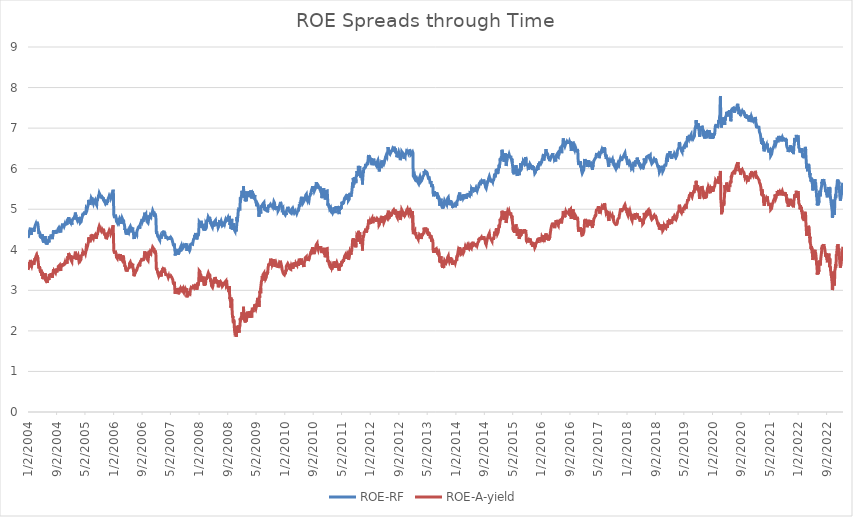
| Category | ROE-RF | ROE-A-yield |
|---|---|---|
| 1/2/04 | 4.291 | 3.504 |
| 1/5/04 | 4.27 | 3.485 |
| 1/6/04 | 4.33 | 3.547 |
| 1/7/04 | 4.342 | 3.57 |
| 1/8/04 | 4.313 | 3.534 |
| 1/9/04 | 4.4 | 3.624 |
| 1/12/04 | 4.406 | 3.625 |
| 1/13/04 | 4.434 | 3.646 |
| 1/14/04 | 4.46 | 3.697 |
| 1/15/04 | 4.479 | 3.71 |
| 1/16/04 | 4.452 | 3.661 |
| 1/19/04 | 4.447 | 3.651 |
| 1/20/04 | 4.445 | 3.657 |
| 1/21/04 | 4.483 | 3.694 |
| 1/22/04 | 4.544 | 3.751 |
| 1/23/04 | 4.451 | 3.655 |
| 1/26/04 | 4.414 | 3.614 |
| 1/27/04 | 4.44 | 3.639 |
| 1/28/04 | 4.366 | 3.569 |
| 1/29/04 | 4.371 | 3.569 |
| 1/30/04 | 4.428 | 3.629 |
| 2/2/04 | 4.411 | 3.604 |
| 2/3/04 | 4.425 | 3.612 |
| 2/4/04 | 4.427 | 3.63 |
| 2/5/04 | 4.421 | 3.623 |
| 2/6/04 | 4.495 | 3.692 |
| 2/9/04 | 4.506 | 3.703 |
| 2/10/04 | 4.475 | 3.671 |
| 2/11/04 | 4.518 | 3.717 |
| 2/12/04 | 4.497 | 3.691 |
| 2/13/04 | 4.512 | 3.704 |
| 2/16/04 | 4.512 | 3.704 |
| 2/17/04 | 4.512 | 3.704 |
| 2/18/04 | 4.49 | 3.679 |
| 2/19/04 | 4.479 | 3.659 |
| 2/20/04 | 4.444 | 3.634 |
| 2/23/04 | 4.468 | 3.662 |
| 2/24/04 | 4.494 | 3.691 |
| 2/25/04 | 4.508 | 3.707 |
| 2/26/04 | 4.498 | 3.694 |
| 2/27/04 | 4.54 | 3.738 |
| 3/1/04 | 4.577 | 3.786 |
| 3/2/04 | 4.575 | 3.754 |
| 3/3/04 | 4.553 | 3.74 |
| 3/4/04 | 4.554 | 3.744 |
| 3/5/04 | 4.616 | 3.8 |
| 3/8/04 | 4.64 | 3.821 |
| 3/9/04 | 4.644 | 3.831 |
| 3/10/04 | 4.634 | 3.815 |
| 3/11/04 | 4.623 | 3.802 |
| 3/12/04 | 4.61 | 3.783 |
| 3/15/04 | 4.634 | 3.786 |
| 3/16/04 | 4.659 | 3.811 |
| 3/17/04 | 4.688 | 3.847 |
| 3/18/04 | 4.682 | 3.829 |
| 3/19/04 | 4.674 | 3.816 |
| 3/22/04 | 4.703 | 3.854 |
| 3/23/04 | 4.702 | 3.856 |
| 3/24/04 | 4.705 | 3.86 |
| 3/25/04 | 4.702 | 3.85 |
| 3/26/04 | 4.622 | 3.77 |
| 3/29/04 | 4.565 | 3.703 |
| 3/30/04 | 4.56 | 3.704 |
| 3/31/04 | 4.565 | 3.699 |
| 4/1/04 | 4.55 | 3.691 |
| 4/2/04 | 4.426 | 3.568 |
| 4/5/04 | 4.393 | 3.542 |
| 4/6/04 | 4.402 | 3.553 |
| 4/7/04 | 4.439 | 3.59 |
| 4/8/04 | 4.437 | 3.586 |
| 4/12/04 | 4.409 | 3.552 |
| 4/13/04 | 4.345 | 3.489 |
| 4/14/04 | 4.321 | 3.472 |
| 4/15/04 | 4.324 | 3.465 |
| 4/16/04 | 4.368 | 3.51 |
| 4/19/04 | 4.336 | 3.479 |
| 4/20/04 | 4.296 | 3.435 |
| 4/21/04 | 4.324 | 3.467 |
| 4/22/04 | 4.364 | 3.51 |
| 4/23/04 | 4.326 | 3.472 |
| 4/26/04 | 4.324 | 3.467 |
| 4/27/04 | 4.336 | 3.484 |
| 4/28/04 | 4.299 | 3.393 |
| 4/29/04 | 4.271 | 3.353 |
| 4/30/04 | 4.35 | 3.432 |
| 5/3/04 | 4.38 | 3.457 |
| 5/4/04 | 4.343 | 3.415 |
| 5/5/04 | 4.327 | 3.401 |
| 5/6/04 | 4.333 | 3.406 |
| 5/7/04 | 4.233 | 3.287 |
| 5/10/04 | 4.247 | 3.341 |
| 5/11/04 | 4.258 | 3.346 |
| 5/12/04 | 4.178 | 3.276 |
| 5/13/04 | 4.154 | 3.257 |
| 5/14/04 | 4.205 | 3.304 |
| 5/17/04 | 4.275 | 3.375 |
| 5/18/04 | 4.247 | 3.35 |
| 5/19/04 | 4.208 | 3.313 |
| 5/20/04 | 4.24 | 3.333 |
| 5/21/04 | 4.22 | 3.301 |
| 5/25/04 | 4.208 | 3.286 |
| 5/26/04 | 4.277 | 3.362 |
| 5/27/04 | 4.339 | 3.418 |
| 5/28/04 | 4.3 | 3.368 |
| 5/31/04 | 4.294 | 3.36 |
| 6/1/04 | 4.27 | 3.34 |
| 6/2/04 | 4.208 | 3.278 |
| 6/3/04 | 4.212 | 3.283 |
| 6/4/04 | 4.139 | 3.219 |
| 6/7/04 | 4.14 | 3.219 |
| 6/8/04 | 4.166 | 3.248 |
| 6/9/04 | 4.159 | 3.251 |
| 6/10/04 | 4.157 | 3.237 |
| 6/11/04 | 4.127 | 3.206 |
| 6/14/04 | 4.107 | 3.181 |
| 6/15/04 | 4.2 | 3.277 |
| 6/16/04 | 4.172 | 3.267 |
| 6/17/04 | 4.181 | 3.274 |
| 6/18/04 | 4.181 | 3.246 |
| 6/21/04 | 4.176 | 3.263 |
| 6/22/04 | 4.169 | 3.263 |
| 6/23/04 | 4.219 | 3.312 |
| 6/24/04 | 4.25 | 3.334 |
| 6/25/04 | 4.239 | 3.31 |
| 6/28/04 | 4.184 | 3.257 |
| 6/29/04 | 4.203 | 3.27 |
| 6/30/04 | 4.265 | 3.336 |
| 7/2/04 | 4.339 | 3.404 |
| 7/5/04 | 4.329 | 3.396 |
| 7/6/04 | 4.306 | 3.37 |
| 7/7/04 | 4.297 | 3.351 |
| 7/8/04 | 4.31 | 3.362 |
| 7/9/04 | 4.323 | 3.374 |
| 7/12/04 | 4.327 | 3.381 |
| 7/13/04 | 4.31 | 3.364 |
| 7/14/04 | 4.308 | 3.364 |
| 7/15/04 | 4.311 | 3.36 |
| 7/16/04 | 4.377 | 3.429 |
| 7/19/04 | 4.375 | 3.434 |
| 7/20/04 | 4.333 | 3.394 |
| 7/21/04 | 4.306 | 3.358 |
| 7/22/04 | 4.324 | 3.374 |
| 7/23/04 | 4.339 | 3.388 |
| 7/26/04 | 4.338 | 3.39 |
| 7/27/04 | 4.263 | 3.312 |
| 7/28/04 | 4.27 | 3.313 |
| 7/29/04 | 4.273 | 3.325 |
| 7/30/04 | 4.32 | 3.37 |
| 8/3/04 | 4.382 | 3.43 |
| 8/4/04 | 4.381 | 3.438 |
| 8/5/04 | 4.381 | 3.428 |
| 8/6/04 | 4.48 | 3.521 |
| 8/9/04 | 4.432 | 3.47 |
| 8/10/04 | 4.394 | 3.437 |
| 8/11/04 | 4.428 | 3.442 |
| 8/12/04 | 4.446 | 3.48 |
| 8/13/04 | 4.462 | 3.495 |
| 8/16/04 | 4.43 | 3.457 |
| 8/17/04 | 4.458 | 3.493 |
| 8/18/04 | 4.42 | 3.458 |
| 8/19/04 | 4.446 | 3.478 |
| 8/20/04 | 4.448 | 3.485 |
| 8/23/04 | 4.399 | 3.432 |
| 8/24/04 | 4.389 | 3.428 |
| 8/25/04 | 4.418 | 3.466 |
| 8/26/04 | 4.433 | 3.479 |
| 8/27/04 | 4.44 | 3.483 |
| 8/30/04 | 4.459 | 3.501 |
| 8/31/04 | 4.483 | 3.522 |
| 9/1/04 | 4.49 | 3.536 |
| 9/2/04 | 4.462 | 3.507 |
| 9/3/04 | 4.41 | 3.444 |
| 9/7/04 | 4.418 | 3.451 |
| 9/8/04 | 4.459 | 3.509 |
| 9/9/04 | 4.443 | 3.492 |
| 9/10/04 | 4.467 | 3.513 |
| 9/13/04 | 4.47 | 3.519 |
| 9/14/04 | 4.474 | 3.532 |
| 9/15/04 | 4.47 | 3.534 |
| 9/16/04 | 4.523 | 3.588 |
| 9/17/04 | 4.509 | 3.58 |
| 9/20/04 | 4.547 | 3.607 |
| 9/21/04 | 4.539 | 3.599 |
| 9/22/04 | 4.55 | 3.603 |
| 9/23/04 | 4.542 | 3.586 |
| 9/24/04 | 4.546 | 3.596 |
| 9/27/04 | 4.563 | 3.621 |
| 9/28/04 | 4.574 | 3.638 |
| 9/29/04 | 4.533 | 3.598 |
| 9/30/04 | 4.498 | 3.555 |
| 10/1/04 | 4.463 | 3.521 |
| 10/4/04 | 4.467 | 3.534 |
| 10/5/04 | 4.481 | 3.545 |
| 10/6/04 | 4.454 | 3.513 |
| 10/7/04 | 4.426 | 3.479 |
| 10/8/04 | 4.488 | 3.54 |
| 10/12/04 | 4.519 | 3.579 |
| 10/13/04 | 4.523 | 3.583 |
| 10/14/04 | 4.558 | 3.615 |
| 10/15/04 | 4.538 | 3.59 |
| 10/18/04 | 4.558 | 3.609 |
| 10/19/04 | 4.577 | 3.62 |
| 10/20/04 | 4.611 | 3.66 |
| 10/21/04 | 4.617 | 3.662 |
| 10/22/04 | 4.635 | 3.663 |
| 10/25/04 | 4.644 | 3.665 |
| 10/26/04 | 4.633 | 3.653 |
| 10/27/04 | 4.583 | 3.595 |
| 10/28/04 | 4.609 | 3.614 |
| 10/29/04 | 4.635 | 3.653 |
| 11/1/04 | 4.614 | 3.627 |
| 11/2/04 | 4.625 | 3.64 |
| 11/3/04 | 4.638 | 3.669 |
| 11/4/04 | 4.635 | 3.674 |
| 11/5/04 | 4.582 | 3.623 |
| 11/8/04 | 4.58 | 3.619 |
| 11/9/04 | 4.565 | 3.607 |
| 11/10/04 | 4.575 | 3.611 |
| 11/12/04 | 4.643 | 3.689 |
| 11/15/04 | 4.624 | 3.673 |
| 11/16/04 | 4.608 | 3.647 |
| 11/17/04 | 4.659 | 3.712 |
| 11/18/04 | 4.655 | 3.717 |
| 11/19/04 | 4.609 | 3.662 |
| 11/22/04 | 4.621 | 3.664 |
| 11/23/04 | 4.652 | 3.704 |
| 11/24/04 | 4.682 | 3.739 |
| 11/25/04 | 4.704 | 3.759 |
| 11/26/04 | 4.682 | 3.726 |
| 11/29/04 | 4.619 | 3.664 |
| 11/30/04 | 4.607 | 3.648 |
| 12/1/04 | 4.635 | 3.698 |
| 12/2/04 | 4.62 | 3.675 |
| 12/3/04 | 4.703 | 3.749 |
| 12/6/04 | 4.724 | 3.793 |
| 12/7/04 | 4.726 | 3.792 |
| 12/8/04 | 4.766 | 3.843 |
| 12/9/04 | 4.714 | 3.786 |
| 12/10/04 | 4.728 | 3.796 |
| 12/13/04 | 4.746 | 3.825 |
| 12/14/04 | 4.78 | 3.879 |
| 12/15/04 | 4.805 | 3.915 |
| 12/16/04 | 4.756 | 3.86 |
| 12/17/04 | 4.727 | 3.828 |
| 12/20/04 | 4.737 | 3.854 |
| 12/21/04 | 4.745 | 3.872 |
| 12/22/04 | 4.708 | 3.832 |
| 12/23/04 | 4.728 | 3.857 |
| 12/24/04 | 4.728 | 3.847 |
| 12/29/04 | 4.674 | 3.796 |
| 12/30/04 | 4.72 | 3.827 |
| 12/31/04 | 4.759 | 3.865 |
| 1/4/05 | 4.636 | 3.741 |
| 1/5/05 | 4.653 | 3.753 |
| 1/6/05 | 4.661 | 3.763 |
| 1/7/05 | 4.638 | 3.727 |
| 1/10/05 | 4.623 | 3.708 |
| 1/11/05 | 4.654 | 3.751 |
| 1/12/05 | 4.669 | 3.774 |
| 1/13/05 | 4.722 | 3.812 |
| 1/14/05 | 4.716 | 3.816 |
| 1/17/05 | 4.737 | 3.814 |
| 1/18/05 | 4.742 | 3.805 |
| 1/19/05 | 4.762 | 3.83 |
| 1/20/05 | 4.751 | 3.805 |
| 1/21/05 | 4.762 | 3.808 |
| 1/24/05 | 4.772 | 3.814 |
| 1/25/05 | 4.756 | 3.8 |
| 1/26/05 | 4.763 | 3.804 |
| 1/27/05 | 4.761 | 3.811 |
| 1/28/05 | 4.792 | 3.831 |
| 1/31/05 | 4.786 | 3.824 |
| 2/1/05 | 4.779 | 3.818 |
| 2/2/05 | 4.768 | 3.803 |
| 2/3/05 | 4.748 | 3.786 |
| 2/4/05 | 4.829 | 3.862 |
| 2/7/05 | 4.87 | 3.906 |
| 2/8/05 | 4.887 | 3.924 |
| 2/9/05 | 4.917 | 3.954 |
| 2/10/05 | 4.871 | 3.911 |
| 2/11/05 | 4.863 | 3.896 |
| 2/14/05 | 4.888 | 3.923 |
| 2/15/05 | 4.876 | 3.926 |
| 2/16/05 | 4.854 | 3.898 |
| 2/17/05 | 4.84 | 3.874 |
| 2/18/05 | 4.785 | 3.822 |
| 2/21/05 | 4.778 | 3.82 |
| 2/22/05 | 4.768 | 3.814 |
| 2/23/05 | 4.747 | 3.803 |
| 2/24/05 | 4.729 | 3.752 |
| 2/25/05 | 4.779 | 3.818 |
| 2/28/05 | 4.749 | 3.805 |
| 3/1/05 | 4.749 | 3.803 |
| 3/2/05 | 4.739 | 3.802 |
| 3/3/05 | 4.754 | 3.817 |
| 3/4/05 | 4.797 | 3.861 |
| 3/7/05 | 4.816 | 3.877 |
| 3/8/05 | 4.794 | 3.856 |
| 3/9/05 | 4.707 | 3.772 |
| 3/10/05 | 4.71 | 3.773 |
| 3/11/05 | 4.673 | 3.735 |
| 3/14/05 | 4.684 | 3.748 |
| 3/15/05 | 4.652 | 3.717 |
| 3/16/05 | 4.691 | 3.75 |
| 3/17/05 | 4.72 | 3.775 |
| 3/18/05 | 4.727 | 3.795 |
| 3/21/05 | 4.71 | 3.784 |
| 3/22/05 | 4.665 | 3.727 |
| 3/23/05 | 4.675 | 3.727 |
| 3/24/05 | 4.677 | 3.741 |
| 3/28/05 | 4.659 | 3.725 |
| 3/29/05 | 4.691 | 3.762 |
| 3/30/05 | 4.72 | 3.796 |
| 3/31/05 | 4.786 | 3.849 |
| 4/1/05 | 4.812 | 3.867 |
| 4/4/05 | 4.803 | 3.861 |
| 4/5/05 | 4.778 | 3.835 |
| 4/6/05 | 4.793 | 3.854 |
| 4/7/05 | 4.765 | 3.826 |
| 4/8/05 | 4.786 | 3.842 |
| 4/11/05 | 4.839 | 3.9 |
| 4/12/05 | 4.879 | 3.939 |
| 4/13/05 | 4.855 | 3.916 |
| 4/14/05 | 4.847 | 3.905 |
| 4/15/05 | 4.884 | 3.94 |
| 4/18/05 | 4.872 | 3.921 |
| 4/19/05 | 4.907 | 3.953 |
| 4/20/05 | 4.907 | 3.95 |
| 4/21/05 | 4.872 | 3.909 |
| 4/22/05 | 4.89 | 3.925 |
| 4/25/05 | 4.894 | 3.925 |
| 4/26/05 | 4.896 | 3.928 |
| 4/27/05 | 4.91 | 3.941 |
| 4/28/05 | 4.942 | 3.973 |
| 4/29/05 | 4.922 | 3.952 |
| 5/2/05 | 4.931 | 3.957 |
| 5/3/05 | 4.943 | 3.99 |
| 5/4/05 | 4.925 | 3.974 |
| 5/5/05 | 4.924 | 3.976 |
| 5/6/05 | 4.866 | 3.907 |
| 5/9/05 | 4.883 | 3.927 |
| 5/10/05 | 4.927 | 3.967 |
| 5/11/05 | 4.96 | 4.008 |
| 5/12/05 | 4.978 | 4.017 |
| 5/13/05 | 5.024 | 4.071 |
| 5/16/05 | 5.016 | 4.053 |
| 5/17/05 | 5.023 | 4.07 |
| 5/18/05 | 5.042 | 4.095 |
| 5/19/05 | 5 | 4.046 |
| 5/20/05 | 4.995 | 4.046 |
| 5/24/05 | 5.048 | 4.097 |
| 5/25/05 | 5.037 | 4.09 |
| 5/26/05 | 5.044 | 4.095 |
| 5/27/05 | 5.08 | 4.136 |
| 5/30/05 | 5.09 | 4.149 |
| 5/31/05 | 5.131 | 4.19 |
| 6/1/05 | 5.227 | 4.296 |
| 6/2/05 | 5.21 | 4.279 |
| 6/3/05 | 5.161 | 4.228 |
| 6/6/05 | 5.182 | 4.248 |
| 6/7/05 | 5.23 | 4.306 |
| 6/8/05 | 5.214 | 4.293 |
| 6/9/05 | 5.21 | 4.293 |
| 6/10/05 | 5.146 | 4.23 |
| 6/13/05 | 5.131 | 4.208 |
| 6/14/05 | 5.106 | 4.185 |
| 6/15/05 | 5.107 | 4.187 |
| 6/16/05 | 5.137 | 4.215 |
| 6/17/05 | 5.143 | 4.232 |
| 6/20/05 | 5.147 | 4.245 |
| 6/21/05 | 5.191 | 4.29 |
| 6/22/05 | 5.238 | 4.338 |
| 6/23/05 | 5.25 | 4.348 |
| 6/24/05 | 5.272 | 4.374 |
| 6/27/05 | 5.281 | 4.377 |
| 6/28/05 | 5.246 | 4.34 |
| 6/29/05 | 5.211 | 4.3 |
| 6/30/05 | 5.286 | 4.371 |
| 7/4/05 | 5.194 | 4.296 |
| 7/5/05 | 5.156 | 4.259 |
| 7/6/05 | 5.174 | 4.273 |
| 7/7/05 | 5.181 | 4.299 |
| 7/8/05 | 5.181 | 4.286 |
| 7/11/05 | 5.164 | 4.298 |
| 7/12/05 | 5.141 | 4.274 |
| 7/13/05 | 5.147 | 4.288 |
| 7/14/05 | 5.167 | 4.304 |
| 7/15/05 | 5.186 | 4.33 |
| 7/18/05 | 5.157 | 4.3 |
| 7/19/05 | 5.182 | 4.322 |
| 7/20/05 | 5.182 | 4.327 |
| 7/21/05 | 5.143 | 4.287 |
| 7/22/05 | 5.203 | 4.343 |
| 7/25/05 | 5.215 | 4.347 |
| 7/26/05 | 5.196 | 4.343 |
| 7/27/05 | 5.187 | 4.34 |
| 7/28/05 | 5.23 | 4.364 |
| 7/29/05 | 5.226 | 4.373 |
| 8/2/05 | 5.168 | 4.338 |
| 8/3/05 | 5.18 | 4.327 |
| 8/4/05 | 5.184 | 4.331 |
| 8/5/05 | 5.128 | 4.271 |
| 8/8/05 | 5.122 | 4.264 |
| 8/9/05 | 5.128 | 4.272 |
| 8/10/05 | 5.1 | 4.258 |
| 8/11/05 | 5.137 | 4.29 |
| 8/12/05 | 5.198 | 4.367 |
| 8/15/05 | 5.182 | 4.35 |
| 8/16/05 | 5.246 | 4.406 |
| 8/17/05 | 5.21 | 4.374 |
| 8/18/05 | 5.25 | 4.412 |
| 8/19/05 | 5.262 | 4.434 |
| 8/22/05 | 5.255 | 4.434 |
| 8/23/05 | 5.27 | 4.449 |
| 8/24/05 | 5.297 | 4.474 |
| 8/25/05 | 5.331 | 4.529 |
| 8/26/05 | 5.333 | 4.538 |
| 8/29/05 | 5.346 | 4.554 |
| 8/30/05 | 5.363 | 4.558 |
| 8/31/05 | 5.378 | 4.572 |
| 9/1/05 | 5.395 | 4.582 |
| 9/2/05 | 5.395 | 4.569 |
| 9/6/05 | 5.362 | 4.545 |
| 9/7/05 | 5.302 | 4.485 |
| 9/8/05 | 5.313 | 4.485 |
| 9/9/05 | 5.344 | 4.518 |
| 9/12/05 | 5.315 | 4.51 |
| 9/13/05 | 5.34 | 4.535 |
| 9/14/05 | 5.327 | 4.52 |
| 9/15/05 | 5.307 | 4.502 |
| 9/16/05 | 5.271 | 4.476 |
| 9/19/05 | 5.288 | 4.48 |
| 9/20/05 | 5.29 | 4.497 |
| 9/21/05 | 5.325 | 4.532 |
| 9/22/05 | 5.325 | 4.526 |
| 9/23/05 | 5.284 | 4.485 |
| 9/26/05 | 5.256 | 4.454 |
| 9/27/05 | 5.27 | 4.471 |
| 9/28/05 | 5.283 | 4.49 |
| 9/29/05 | 5.26 | 4.466 |
| 9/30/05 | 5.279 | 4.476 |
| 10/3/05 | 5.258 | 4.463 |
| 10/4/05 | 5.288 | 4.488 |
| 10/5/05 | 5.308 | 4.512 |
| 10/6/05 | 5.301 | 4.497 |
| 10/7/05 | 5.308 | 4.507 |
| 10/11/05 | 5.271 | 4.466 |
| 10/12/05 | 5.209 | 4.403 |
| 10/13/05 | 5.194 | 4.387 |
| 10/14/05 | 5.2 | 4.389 |
| 10/17/05 | 5.193 | 4.381 |
| 10/18/05 | 5.196 | 4.383 |
| 10/19/05 | 5.173 | 4.368 |
| 10/20/05 | 5.195 | 4.379 |
| 10/21/05 | 5.235 | 4.42 |
| 10/24/05 | 5.224 | 4.408 |
| 10/25/05 | 5.178 | 4.359 |
| 10/26/05 | 5.131 | 4.298 |
| 10/27/05 | 5.141 | 4.304 |
| 10/28/05 | 5.149 | 4.307 |
| 10/31/05 | 5.152 | 4.31 |
| 11/1/05 | 5.148 | 4.306 |
| 11/2/05 | 5.144 | 4.312 |
| 11/3/05 | 5.138 | 4.292 |
| 11/4/05 | 5.135 | 4.289 |
| 11/7/05 | 5.158 | 4.311 |
| 11/8/05 | 5.197 | 4.356 |
| 11/9/05 | 5.163 | 4.319 |
| 11/10/05 | 5.186 | 4.339 |
| 11/14/05 | 5.173 | 4.326 |
| 11/15/05 | 5.213 | 4.365 |
| 11/16/05 | 5.262 | 4.415 |
| 11/17/05 | 5.268 | 4.422 |
| 11/18/05 | 5.252 | 4.404 |
| 11/21/05 | 5.267 | 4.42 |
| 11/22/05 | 5.302 | 4.451 |
| 11/23/05 | 5.32 | 4.468 |
| 11/24/05 | 5.322 | 4.471 |
| 11/25/05 | 5.33 | 4.477 |
| 11/28/05 | 5.342 | 4.478 |
| 11/29/05 | 5.316 | 4.452 |
| 11/30/05 | 5.315 | 4.456 |
| 12/1/05 | 5.321 | 4.457 |
| 12/2/05 | 5.287 | 4.421 |
| 12/5/05 | 5.26 | 4.394 |
| 12/6/05 | 5.315 | 4.452 |
| 12/7/05 | 5.3 | 4.438 |
| 12/8/05 | 5.325 | 4.466 |
| 12/9/05 | 5.276 | 4.402 |
| 12/12/05 | 5.257 | 4.383 |
| 12/13/05 | 5.27 | 4.395 |
| 12/14/05 | 5.314 | 4.438 |
| 12/15/05 | 5.327 | 4.451 |
| 12/16/05 | 5.378 | 4.502 |
| 12/19/05 | 5.39 | 4.508 |
| 12/20/05 | 5.377 | 4.497 |
| 12/21/05 | 5.382 | 4.507 |
| 12/22/05 | 5.41 | 4.532 |
| 12/23/05 | 5.427 | 4.551 |
| 12/28/05 | 5.48 | 4.603 |
| 12/29/05 | 5.457 | 4.575 |
| 12/30/05 | 5.455 | 4.575 |
| 1/3/06 | 4.862 | 3.986 |
| 1/4/06 | 4.874 | 3.993 |
| 1/5/06 | 4.855 | 3.974 |
| 1/6/06 | 4.833 | 3.948 |
| 1/9/06 | 4.816 | 3.941 |
| 1/10/06 | 4.78 | 3.906 |
| 1/11/06 | 4.78 | 3.906 |
| 1/12/06 | 4.79 | 3.908 |
| 1/13/06 | 4.826 | 3.94 |
| 1/16/06 | 4.837 | 3.947 |
| 1/17/06 | 4.866 | 3.976 |
| 1/18/06 | 4.869 | 3.981 |
| 1/19/06 | 4.826 | 3.938 |
| 1/20/06 | 4.822 | 3.934 |
| 1/23/06 | 4.793 | 3.905 |
| 1/24/06 | 4.776 | 3.888 |
| 1/25/06 | 4.726 | 3.843 |
| 1/26/06 | 4.7 | 3.816 |
| 1/27/06 | 4.696 | 3.814 |
| 1/30/06 | 4.681 | 3.802 |
| 1/31/06 | 4.686 | 3.806 |
| 2/1/06 | 4.669 | 3.79 |
| 2/2/06 | 4.681 | 3.8 |
| 2/3/06 | 4.712 | 3.831 |
| 2/6/06 | 4.698 | 3.816 |
| 2/7/06 | 4.687 | 3.806 |
| 2/8/06 | 4.678 | 3.802 |
| 2/9/06 | 4.683 | 3.8 |
| 2/10/06 | 4.663 | 3.774 |
| 2/13/06 | 4.669 | 3.782 |
| 2/14/06 | 4.658 | 3.77 |
| 2/15/06 | 4.658 | 3.773 |
| 2/16/06 | 4.685 | 3.796 |
| 2/17/06 | 4.745 | 3.854 |
| 2/20/06 | 4.755 | 3.862 |
| 2/21/06 | 4.737 | 3.847 |
| 2/22/06 | 4.778 | 3.893 |
| 2/23/06 | 4.758 | 3.863 |
| 2/24/06 | 4.755 | 3.865 |
| 2/27/06 | 4.754 | 3.863 |
| 2/28/06 | 4.785 | 3.893 |
| 3/1/06 | 4.755 | 3.856 |
| 3/2/06 | 4.725 | 3.822 |
| 3/3/06 | 4.697 | 3.798 |
| 3/6/06 | 4.637 | 3.736 |
| 3/7/06 | 4.68 | 3.782 |
| 3/8/06 | 4.688 | 3.779 |
| 3/9/06 | 4.685 | 3.769 |
| 3/10/06 | 4.674 | 3.759 |
| 3/13/06 | 4.67 | 3.754 |
| 3/14/06 | 4.729 | 3.811 |
| 3/15/06 | 4.707 | 3.786 |
| 3/16/06 | 4.774 | 3.853 |
| 3/17/06 | 4.752 | 3.829 |
| 3/20/06 | 4.747 | 3.829 |
| 3/21/06 | 4.726 | 3.806 |
| 3/22/06 | 4.739 | 3.824 |
| 3/23/06 | 4.726 | 3.806 |
| 3/24/06 | 4.77 | 3.853 |
| 3/27/06 | 4.751 | 3.831 |
| 3/28/06 | 4.717 | 3.805 |
| 3/29/06 | 4.695 | 3.786 |
| 3/30/06 | 4.653 | 3.738 |
| 3/31/06 | 4.67 | 3.755 |
| 4/3/06 | 4.64 | 3.725 |
| 4/4/06 | 4.613 | 3.701 |
| 4/5/06 | 4.606 | 3.698 |
| 4/6/06 | 4.564 | 3.649 |
| 4/7/06 | 4.489 | 3.583 |
| 4/10/06 | 4.498 | 3.592 |
| 4/11/06 | 4.515 | 3.61 |
| 4/12/06 | 4.487 | 3.577 |
| 4/13/06 | 4.439 | 3.532 |
| 4/17/06 | 4.451 | 3.544 |
| 4/18/06 | 4.462 | 3.554 |
| 4/19/06 | 4.418 | 3.512 |
| 4/20/06 | 4.378 | 3.471 |
| 4/21/06 | 4.403 | 3.493 |
| 4/24/06 | 4.446 | 3.533 |
| 4/25/06 | 4.382 | 3.468 |
| 4/26/06 | 4.362 | 3.457 |
| 4/27/06 | 4.375 | 3.469 |
| 4/28/06 | 4.412 | 3.5 |
| 5/1/06 | 4.379 | 3.479 |
| 5/2/06 | 4.407 | 3.509 |
| 5/3/06 | 4.42 | 3.521 |
| 5/4/06 | 4.428 | 3.524 |
| 5/5/06 | 4.437 | 3.534 |
| 5/8/06 | 4.442 | 3.546 |
| 5/9/06 | 4.417 | 3.52 |
| 5/10/06 | 4.417 | 3.527 |
| 5/11/06 | 4.412 | 3.514 |
| 5/12/06 | 4.413 | 3.52 |
| 5/15/06 | 4.454 | 3.559 |
| 5/16/06 | 4.497 | 3.606 |
| 5/17/06 | 4.48 | 3.611 |
| 5/18/06 | 4.544 | 3.669 |
| 5/19/06 | 4.544 | 3.653 |
| 5/23/06 | 4.562 | 3.658 |
| 5/24/06 | 4.577 | 3.698 |
| 5/25/06 | 4.582 | 3.705 |
| 5/26/06 | 4.571 | 3.687 |
| 5/29/06 | 4.576 | 3.693 |
| 5/30/06 | 4.525 | 3.641 |
| 5/31/06 | 4.433 | 3.556 |
| 6/1/06 | 4.49 | 3.603 |
| 6/2/06 | 4.555 | 3.67 |
| 6/5/06 | 4.55 | 3.664 |
| 6/6/06 | 4.57 | 3.687 |
| 6/7/06 | 4.546 | 3.665 |
| 6/8/06 | 4.537 | 3.651 |
| 6/9/06 | 4.506 | 3.608 |
| 6/12/06 | 4.515 | 3.624 |
| 6/13/06 | 4.545 | 3.654 |
| 6/14/06 | 4.514 | 3.621 |
| 6/15/06 | 4.477 | 3.575 |
| 6/16/06 | 4.487 | 3.585 |
| 6/19/06 | 4.467 | 3.56 |
| 6/20/06 | 4.406 | 3.504 |
| 6/21/06 | 4.369 | 3.468 |
| 6/22/06 | 4.332 | 3.424 |
| 6/23/06 | 4.292 | 3.384 |
| 6/26/06 | 4.267 | 3.359 |
| 6/27/06 | 4.294 | 3.385 |
| 6/28/06 | 4.267 | 3.349 |
| 6/29/06 | 4.299 | 3.378 |
| 6/30/06 | 4.316 | 3.395 |
| 7/4/06 | 4.288 | 3.366 |
| 7/5/06 | 4.279 | 3.364 |
| 7/6/06 | 4.307 | 3.387 |
| 7/7/06 | 4.39 | 3.461 |
| 7/10/06 | 4.413 | 3.487 |
| 7/11/06 | 4.44 | 3.514 |
| 7/12/06 | 4.41 | 3.472 |
| 7/13/06 | 4.412 | 3.482 |
| 7/14/06 | 4.418 | 3.486 |
| 7/17/06 | 4.425 | 3.49 |
| 7/18/06 | 4.379 | 3.449 |
| 7/19/06 | 4.434 | 3.506 |
| 7/20/06 | 4.441 | 3.505 |
| 7/21/06 | 4.471 | 3.537 |
| 7/24/06 | 4.482 | 3.545 |
| 7/25/06 | 4.457 | 3.533 |
| 7/26/06 | 4.478 | 3.551 |
| 7/27/06 | 4.489 | 3.556 |
| 7/28/06 | 4.52 | 3.584 |
| 7/31/06 | 4.553 | 3.617 |
| 8/1/06 | 4.551 | 3.619 |
| 8/2/06 | 4.537 | 3.616 |
| 8/3/06 | 4.538 | 3.611 |
| 8/4/06 | 4.563 | 3.634 |
| 8/8/06 | 4.578 | 3.652 |
| 8/9/06 | 4.571 | 3.653 |
| 8/10/06 | 4.549 | 3.624 |
| 8/11/06 | 4.523 | 3.594 |
| 8/14/06 | 4.504 | 3.579 |
| 8/15/06 | 4.554 | 3.626 |
| 8/16/06 | 4.592 | 3.664 |
| 8/17/06 | 4.604 | 3.669 |
| 8/18/06 | 4.635 | 3.7 |
| 8/21/06 | 4.653 | 3.717 |
| 8/22/06 | 4.667 | 3.729 |
| 8/23/06 | 4.665 | 3.735 |
| 8/24/06 | 4.666 | 3.734 |
| 8/25/06 | 4.678 | 3.75 |
| 8/28/06 | 4.681 | 3.752 |
| 8/29/06 | 4.689 | 3.76 |
| 8/30/06 | 4.725 | 3.771 |
| 8/31/06 | 4.737 | 3.783 |
| 9/1/06 | 4.761 | 3.797 |
| 9/5/06 | 4.707 | 3.747 |
| 9/6/06 | 4.692 | 3.737 |
| 9/7/06 | 4.706 | 3.747 |
| 9/8/06 | 4.732 | 3.769 |
| 9/11/06 | 4.695 | 3.732 |
| 9/12/06 | 4.729 | 3.766 |
| 9/13/06 | 4.721 | 3.762 |
| 9/14/06 | 4.715 | 3.753 |
| 9/15/06 | 4.737 | 3.775 |
| 9/18/06 | 4.729 | 3.769 |
| 9/19/06 | 4.765 | 3.815 |
| 9/20/06 | 4.763 | 3.811 |
| 9/21/06 | 4.82 | 3.864 |
| 9/22/06 | 4.843 | 3.89 |
| 9/25/06 | 4.915 | 3.96 |
| 9/26/06 | 4.88 | 3.925 |
| 9/27/06 | 4.861 | 3.906 |
| 9/28/06 | 4.849 | 3.896 |
| 9/29/06 | 4.845 | 3.894 |
| 10/2/06 | 4.862 | 3.908 |
| 10/3/06 | 4.861 | 3.915 |
| 10/4/06 | 4.878 | 3.937 |
| 10/5/06 | 4.838 | 3.895 |
| 10/6/06 | 4.773 | 3.834 |
| 10/10/06 | 4.748 | 3.808 |
| 10/11/06 | 4.733 | 3.787 |
| 10/12/06 | 4.724 | 3.778 |
| 10/13/06 | 4.698 | 3.755 |
| 10/16/06 | 4.703 | 3.763 |
| 10/17/06 | 4.692 | 3.762 |
| 10/18/06 | 4.706 | 3.777 |
| 10/19/06 | 4.685 | 3.759 |
| 10/20/06 | 4.684 | 3.756 |
| 10/23/06 | 4.662 | 3.734 |
| 10/24/06 | 4.663 | 3.747 |
| 10/25/06 | 4.688 | 3.783 |
| 10/26/06 | 4.751 | 3.855 |
| 10/27/06 | 4.788 | 3.888 |
| 10/30/06 | 4.794 | 3.897 |
| 10/31/06 | 4.845 | 3.949 |
| 11/1/06 | 4.864 | 3.976 |
| 11/2/06 | 4.835 | 3.945 |
| 11/3/06 | 4.757 | 3.864 |
| 11/6/06 | 4.766 | 3.87 |
| 11/7/06 | 4.815 | 3.923 |
| 11/8/06 | 4.823 | 3.931 |
| 11/9/06 | 4.825 | 3.933 |
| 11/10/06 | 4.85 | 3.953 |
| 11/14/06 | 4.866 | 3.961 |
| 11/15/06 | 4.837 | 3.938 |
| 11/16/06 | 4.822 | 3.924 |
| 11/17/06 | 4.849 | 3.95 |
| 11/20/06 | 4.843 | 3.946 |
| 11/21/06 | 4.853 | 3.956 |
| 11/22/06 | 4.869 | 3.972 |
| 11/23/06 | 4.863 | 3.967 |
| 11/24/06 | 4.882 | 3.985 |
| 11/27/06 | 4.892 | 3.991 |
| 11/28/06 | 4.928 | 4.032 |
| 11/29/06 | 4.91 | 4.008 |
| 11/30/06 | 4.938 | 4.034 |
| 12/1/06 | 4.967 | 4.067 |
| 12/4/06 | 4.958 | 4.057 |
| 12/5/06 | 4.955 | 4.056 |
| 12/6/06 | 4.944 | 4.043 |
| 12/7/06 | 4.949 | 4.041 |
| 12/8/06 | 4.915 | 4.01 |
| 12/11/06 | 4.942 | 4.036 |
| 12/12/06 | 4.957 | 4.051 |
| 12/13/06 | 4.893 | 3.99 |
| 12/14/06 | 4.877 | 3.972 |
| 12/15/06 | 4.849 | 3.944 |
| 12/18/06 | 4.821 | 3.917 |
| 12/19/06 | 4.835 | 3.931 |
| 12/20/06 | 4.845 | 3.939 |
| 12/21/06 | 4.894 | 3.982 |
| 12/22/06 | 4.868 | 3.961 |
| 12/27/06 | 4.831 | 3.959 |
| 12/28/06 | 4.797 | 3.898 |
| 12/29/06 | 4.792 | 3.895 |
| 1/2/07 | 4.394 | 3.497 |
| 1/3/07 | 4.407 | 3.51 |
| 1/4/07 | 4.45 | 3.552 |
| 1/5/07 | 4.417 | 3.521 |
| 1/8/07 | 4.403 | 3.505 |
| 1/9/07 | 4.401 | 3.501 |
| 1/10/07 | 4.38 | 3.481 |
| 1/11/07 | 4.35 | 3.45 |
| 1/12/07 | 4.328 | 3.428 |
| 1/15/07 | 4.324 | 3.417 |
| 1/16/07 | 4.319 | 3.417 |
| 1/17/07 | 4.3 | 3.402 |
| 1/18/07 | 4.332 | 3.397 |
| 1/19/07 | 4.327 | 3.455 |
| 1/22/07 | 4.334 | 3.435 |
| 1/23/07 | 4.305 | 3.405 |
| 1/24/07 | 4.292 | 3.392 |
| 1/25/07 | 4.263 | 3.362 |
| 1/26/07 | 4.27 | 3.366 |
| 1/29/07 | 4.247 | 3.347 |
| 1/30/07 | 4.238 | 3.338 |
| 1/31/07 | 4.291 | 3.394 |
| 2/1/07 | 4.277 | 3.387 |
| 2/2/07 | 4.288 | 3.389 |
| 2/5/07 | 4.304 | 3.402 |
| 2/6/07 | 4.336 | 3.423 |
| 2/7/07 | 4.35 | 3.442 |
| 2/8/07 | 4.353 | 3.444 |
| 2/9/07 | 4.304 | 3.397 |
| 2/12/07 | 4.275 | 3.367 |
| 2/13/07 | 4.252 | 3.342 |
| 2/14/07 | 4.323 | 3.417 |
| 2/15/07 | 4.348 | 3.439 |
| 2/16/07 | 4.362 | 3.454 |
| 2/19/07 | 4.368 | 3.462 |
| 2/20/07 | 4.384 | 3.48 |
| 2/21/07 | 4.37 | 3.471 |
| 2/22/07 | 4.337 | 3.433 |
| 2/23/07 | 4.363 | 3.457 |
| 2/26/07 | 4.406 | 3.499 |
| 2/27/07 | 4.461 | 3.553 |
| 2/28/07 | 4.417 | 3.509 |
| 3/1/07 | 4.416 | 3.513 |
| 3/2/07 | 4.43 | 3.523 |
| 3/5/07 | 4.434 | 3.525 |
| 3/6/07 | 4.429 | 3.52 |
| 3/7/07 | 4.468 | 3.558 |
| 3/8/07 | 4.446 | 3.536 |
| 3/9/07 | 4.397 | 3.488 |
| 3/12/07 | 4.414 | 3.505 |
| 3/13/07 | 4.431 | 3.519 |
| 3/14/07 | 4.402 | 3.484 |
| 3/15/07 | 4.402 | 3.479 |
| 3/16/07 | 4.391 | 3.464 |
| 3/19/07 | 4.362 | 3.437 |
| 3/20/07 | 4.346 | 3.42 |
| 3/21/07 | 4.335 | 3.417 |
| 3/22/07 | 4.305 | 3.388 |
| 3/23/07 | 4.304 | 3.385 |
| 3/26/07 | 4.3 | 3.381 |
| 3/27/07 | 4.314 | 3.389 |
| 3/28/07 | 4.301 | 3.382 |
| 3/29/07 | 4.297 | 3.371 |
| 3/30/07 | 4.31 | 3.384 |
| 4/2/07 | 4.307 | 3.383 |
| 4/3/07 | 4.291 | 3.368 |
| 4/4/07 | 4.321 | 3.397 |
| 4/5/07 | 4.304 | 3.377 |
| 4/9/07 | 4.269 | 3.354 |
| 4/10/07 | 4.291 | 3.366 |
| 4/11/07 | 4.284 | 3.348 |
| 4/12/07 | 4.274 | 3.338 |
| 4/13/07 | 4.256 | 3.318 |
| 4/16/07 | 4.255 | 3.316 |
| 4/17/07 | 4.288 | 3.352 |
| 4/18/07 | 4.286 | 3.355 |
| 4/19/07 | 4.283 | 3.348 |
| 4/20/07 | 4.254 | 3.315 |
| 4/23/07 | 4.286 | 3.344 |
| 4/24/07 | 4.313 | 3.377 |
| 4/25/07 | 4.312 | 3.377 |
| 4/26/07 | 4.27 | 3.331 |
| 4/27/07 | 4.243 | 3.306 |
| 4/30/07 | 4.316 | 3.379 |
| 5/1/07 | 4.309 | 3.368 |
| 5/2/07 | 4.284 | 3.343 |
| 5/3/07 | 4.257 | 3.311 |
| 5/4/07 | 4.275 | 3.329 |
| 5/7/07 | 4.295 | 3.346 |
| 5/8/07 | 4.3 | 3.348 |
| 5/9/07 | 4.29 | 3.343 |
| 5/10/07 | 4.297 | 3.349 |
| 5/11/07 | 4.302 | 3.358 |
| 5/14/07 | 4.265 | 3.316 |
| 5/15/07 | 4.267 | 3.322 |
| 5/16/07 | 4.268 | 3.327 |
| 5/17/07 | 4.229 | 3.286 |
| 5/18/07 | 4.227 | 3.285 |
| 5/22/07 | 4.207 | 3.258 |
| 5/23/07 | 4.162 | 3.215 |
| 5/24/07 | 4.143 | 3.198 |
| 5/25/07 | 4.134 | 3.189 |
| 5/28/07 | 4.118 | 3.172 |
| 5/29/07 | 4.09 | 3.146 |
| 5/30/07 | 4.116 | 3.18 |
| 5/31/07 | 4.123 | 3.182 |
| 6/1/07 | 4.119 | 3.18 |
| 6/4/07 | 4.152 | 3.212 |
| 6/5/07 | 4.122 | 3.181 |
| 6/6/07 | 4.123 | 3.183 |
| 6/7/07 | 4.012 | 3.063 |
| 6/8/07 | 3.985 | 3.03 |
| 6/11/07 | 3.949 | 3.015 |
| 6/12/07 | 3.859 | 2.913 |
| 6/13/07 | 3.91 | 2.984 |
| 6/14/07 | 3.911 | 2.976 |
| 6/15/07 | 3.983 | 3.048 |
| 6/18/07 | 3.961 | 3.029 |
| 6/19/07 | 3.98 | 3.044 |
| 6/20/07 | 3.96 | 3.026 |
| 6/21/07 | 3.913 | 2.968 |
| 6/22/07 | 3.93 | 2.985 |
| 6/25/07 | 3.964 | 3.019 |
| 6/26/07 | 3.955 | 3 |
| 6/27/07 | 3.95 | 2.995 |
| 6/28/07 | 3.95 | 2.983 |
| 6/29/07 | 4.021 | 3.059 |
| 7/3/07 | 4.025 | 3.057 |
| 7/4/07 | 3.999 | 3.036 |
| 7/5/07 | 3.942 | 2.98 |
| 7/6/07 | 3.877 | 2.904 |
| 7/9/07 | 3.915 | 2.931 |
| 7/10/07 | 4 | 3.02 |
| 7/11/07 | 3.959 | 2.977 |
| 7/12/07 | 3.907 | 2.919 |
| 7/13/07 | 3.934 | 2.941 |
| 7/16/07 | 3.978 | 2.985 |
| 7/17/07 | 3.951 | 2.96 |
| 7/18/07 | 3.97 | 3.003 |
| 7/19/07 | 3.97 | 2.998 |
| 7/20/07 | 4.01 | 3.021 |
| 7/23/07 | 4.007 | 3.01 |
| 7/24/07 | 4.002 | 2.998 |
| 7/25/07 | 4.022 | 3.027 |
| 7/26/07 | 4.057 | 3.052 |
| 7/27/07 | 4.076 | 3.047 |
| 7/30/07 | 4.038 | 3.02 |
| 7/31/07 | 4.049 | 3.035 |
| 8/1/07 | 4.056 | 3.053 |
| 8/2/07 | 4.081 | 3.056 |
| 8/3/07 | 4.109 | 3.086 |
| 8/7/07 | 4.1 | 3.071 |
| 8/8/07 | 4.043 | 3.021 |
| 8/9/07 | 4.041 | 3.013 |
| 8/10/07 | 4.031 | 2.998 |
| 8/13/07 | 4.048 | 3.006 |
| 8/14/07 | 4.073 | 3.046 |
| 8/15/07 | 4.04 | 2.986 |
| 8/16/07 | 4.045 | 2.983 |
| 8/17/07 | 4.039 | 2.965 |
| 8/20/07 | 4.045 | 2.986 |
| 8/21/07 | 4.056 | 2.979 |
| 8/22/07 | 4.028 | 2.952 |
| 8/23/07 | 4.043 | 2.974 |
| 8/24/07 | 4.076 | 3.008 |
| 8/27/07 | 4.114 | 3.039 |
| 8/28/07 | 4.135 | 3.071 |
| 8/29/07 | 4.064 | 2.998 |
| 8/30/07 | 4.086 | 3.002 |
| 8/31/07 | 4.049 | 2.978 |
| 9/4/07 | 4.068 | 3 |
| 9/5/07 | 4.113 | 3.047 |
| 9/6/07 | 4.116 | 3.039 |
| 9/7/07 | 4.155 | 3.056 |
| 9/10/07 | 4.167 | 3.053 |
| 9/11/07 | 4.121 | 3.009 |
| 9/12/07 | 4.118 | 3.008 |
| 9/13/07 | 4.107 | 2.996 |
| 9/14/07 | 4.125 | 3.019 |
| 9/17/07 | 4.156 | 3.049 |
| 9/18/07 | 4.133 | 3.014 |
| 9/19/07 | 4.057 | 2.914 |
| 9/20/07 | 3.968 | 2.826 |
| 9/21/07 | 4.04 | 2.893 |
| 9/24/07 | 4.031 | 2.888 |
| 9/25/07 | 4.03 | 2.884 |
| 9/26/07 | 4.005 | 2.85 |
| 9/27/07 | 4.023 | 2.863 |
| 9/28/07 | 4.066 | 2.912 |
| 10/1/07 | 4.088 | 2.936 |
| 10/2/07 | 4.089 | 2.946 |
| 10/3/07 | 4.061 | 2.927 |
| 10/4/07 | 4.102 | 2.978 |
| 10/5/07 | 4.026 | 2.917 |
| 10/9/07 | 4.006 | 2.915 |
| 10/10/07 | 4.03 | 2.938 |
| 10/11/07 | 4.019 | 2.934 |
| 10/12/07 | 3.978 | 2.897 |
| 10/15/07 | 3.988 | 2.902 |
| 10/16/07 | 4.007 | 2.926 |
| 10/17/07 | 4.04 | 2.955 |
| 10/18/07 | 4.072 | 2.972 |
| 10/19/07 | 4.128 | 3.023 |
| 10/22/07 | 4.128 | 3.047 |
| 10/23/07 | 4.119 | 3.049 |
| 10/24/07 | 4.134 | 3.071 |
| 10/25/07 | 4.122 | 3.053 |
| 10/26/07 | 4.143 | 3.075 |
| 10/29/07 | 4.149 | 3.084 |
| 10/30/07 | 4.15 | 3.083 |
| 10/31/07 | 4.131 | 3.065 |
| 11/1/07 | 4.168 | 3.087 |
| 11/2/07 | 4.129 | 3.052 |
| 11/5/07 | 4.148 | 3.058 |
| 11/6/07 | 4.126 | 3.038 |
| 11/7/07 | 4.137 | 3.052 |
| 11/8/07 | 4.132 | 3.043 |
| 11/9/07 | 4.173 | 3.068 |
| 11/13/07 | 4.169 | 3.052 |
| 11/14/07 | 4.194 | 3.081 |
| 11/15/07 | 4.262 | 3.14 |
| 11/16/07 | 4.254 | 3.107 |
| 11/19/07 | 4.286 | 3.121 |
| 11/20/07 | 4.253 | 3.079 |
| 11/21/07 | 4.279 | 3.083 |
| 11/22/07 | 4.287 | 3.078 |
| 11/23/07 | 4.295 | 3.062 |
| 11/26/07 | 4.366 | 3.126 |
| 11/27/07 | 4.304 | 3.066 |
| 11/28/07 | 4.278 | 3.027 |
| 11/29/07 | 4.353 | 3.119 |
| 11/30/07 | 4.343 | 3.106 |
| 12/3/07 | 4.415 | 3.159 |
| 12/4/07 | 4.409 | 3.169 |
| 12/5/07 | 4.357 | 3.105 |
| 12/6/07 | 4.346 | 3.082 |
| 12/7/07 | 4.309 | 3.064 |
| 12/10/07 | 4.289 | 3.044 |
| 12/11/07 | 4.396 | 3.141 |
| 12/12/07 | 4.343 | 3.098 |
| 12/13/07 | 4.255 | 3.017 |
| 12/14/07 | 4.262 | 3.003 |
| 12/17/07 | 4.343 | 3.104 |
| 12/18/07 | 4.366 | 3.145 |
| 12/19/07 | 4.414 | 3.191 |
| 12/20/07 | 4.405 | 3.184 |
| 12/21/07 | 4.342 | 3.109 |
| 12/24/07 | 4.33 | 3.116 |
| 12/27/07 | 4.324 | 3.105 |
| 12/28/07 | 4.389 | 3.18 |
| 12/31/07 | 4.406 | 3.198 |
| 1/2/08 | 4.691 | 3.486 |
| 1/3/08 | 4.667 | 3.47 |
| 1/4/08 | 4.673 | 3.478 |
| 1/7/08 | 4.687 | 3.487 |
| 1/8/08 | 4.693 | 3.496 |
| 1/9/08 | 4.682 | 3.461 |
| 1/10/08 | 4.659 | 3.414 |
| 1/11/08 | 4.684 | 3.399 |
| 1/14/08 | 4.676 | 3.391 |
| 1/15/08 | 4.706 | 3.42 |
| 1/16/08 | 4.667 | 3.383 |
| 1/17/08 | 4.689 | 3.403 |
| 1/18/08 | 4.67 | 3.362 |
| 1/21/08 | 4.686 | 3.388 |
| 1/22/08 | 4.623 | 3.309 |
| 1/23/08 | 4.568 | 3.255 |
| 1/24/08 | 4.538 | 3.214 |
| 1/25/08 | 4.605 | 3.288 |
| 1/28/08 | 4.609 | 3.312 |
| 1/29/08 | 4.576 | 3.279 |
| 1/30/08 | 4.555 | 3.25 |
| 1/31/08 | 4.57 | 3.274 |
| 2/1/08 | 4.613 | 3.312 |
| 2/4/08 | 4.594 | 3.294 |
| 2/5/08 | 4.64 | 3.342 |
| 2/6/08 | 4.6 | 3.297 |
| 2/7/08 | 4.527 | 3.208 |
| 2/8/08 | 4.556 | 3.221 |
| 2/11/08 | 4.585 | 3.247 |
| 2/12/08 | 4.541 | 3.182 |
| 2/13/08 | 4.501 | 3.172 |
| 2/14/08 | 4.48 | 3.12 |
| 2/15/08 | 4.546 | 3.207 |
| 2/18/08 | 4.546 | 3.207 |
| 2/19/08 | 4.474 | 3.122 |
| 2/20/08 | 4.492 | 3.138 |
| 2/21/08 | 4.531 | 3.166 |
| 2/22/08 | 4.518 | 3.155 |
| 2/25/08 | 4.5 | 3.132 |
| 2/26/08 | 4.541 | 3.189 |
| 2/27/08 | 4.566 | 3.237 |
| 2/28/08 | 4.651 | 3.308 |
| 2/29/08 | 4.66 | 3.318 |
| 3/3/08 | 4.666 | 3.306 |
| 3/4/08 | 4.636 | 3.286 |
| 3/5/08 | 4.621 | 3.263 |
| 3/6/08 | 4.666 | 3.308 |
| 3/7/08 | 4.682 | 3.321 |
| 3/10/08 | 4.712 | 3.337 |
| 3/11/08 | 4.687 | 3.305 |
| 3/12/08 | 4.725 | 3.351 |
| 3/13/08 | 4.718 | 3.354 |
| 3/14/08 | 4.733 | 3.368 |
| 3/17/08 | 4.774 | 3.403 |
| 3/18/08 | 4.758 | 3.381 |
| 3/19/08 | 4.807 | 3.424 |
| 3/20/08 | 4.807 | 3.429 |
| 3/24/08 | 4.777 | 3.427 |
| 3/25/08 | 4.803 | 3.425 |
| 3/26/08 | 4.787 | 3.405 |
| 3/27/08 | 4.775 | 3.373 |
| 3/28/08 | 4.797 | 3.393 |
| 3/31/08 | 4.811 | 3.407 |
| 4/1/08 | 4.724 | 3.312 |
| 4/2/08 | 4.701 | 3.299 |
| 4/3/08 | 4.717 | 3.291 |
| 4/4/08 | 4.75 | 3.331 |
| 4/7/08 | 4.696 | 3.278 |
| 4/8/08 | 4.664 | 3.243 |
| 4/9/08 | 4.701 | 3.285 |
| 4/10/08 | 4.647 | 3.219 |
| 4/11/08 | 4.69 | 3.255 |
| 4/14/08 | 4.667 | 3.194 |
| 4/15/08 | 4.614 | 3.151 |
| 4/16/08 | 4.595 | 3.112 |
| 4/17/08 | 4.602 | 3.108 |
| 4/18/08 | 4.607 | 3.106 |
| 4/21/08 | 4.627 | 3.113 |
| 4/22/08 | 4.626 | 3.127 |
| 4/23/08 | 4.594 | 3.123 |
| 4/24/08 | 4.559 | 3.098 |
| 4/25/08 | 4.535 | 3.072 |
| 4/28/08 | 4.553 | 3.106 |
| 4/29/08 | 4.582 | 3.153 |
| 4/30/08 | 4.665 | 3.236 |
| 5/1/08 | 4.688 | 3.256 |
| 5/2/08 | 4.655 | 3.223 |
| 5/5/08 | 4.642 | 3.234 |
| 5/6/08 | 4.575 | 3.166 |
| 5/7/08 | 4.589 | 3.185 |
| 5/8/08 | 4.613 | 3.217 |
| 5/9/08 | 4.666 | 3.264 |
| 5/12/08 | 4.697 | 3.294 |
| 5/13/08 | 4.679 | 3.279 |
| 5/14/08 | 4.693 | 3.292 |
| 5/15/08 | 4.714 | 3.307 |
| 5/16/08 | 4.709 | 3.3 |
| 5/20/08 | 4.727 | 3.318 |
| 5/21/08 | 4.692 | 3.296 |
| 5/22/08 | 4.633 | 3.224 |
| 5/23/08 | 4.671 | 3.27 |
| 5/26/08 | 4.665 | 3.259 |
| 5/27/08 | 4.647 | 3.239 |
| 5/28/08 | 4.633 | 3.219 |
| 5/29/08 | 4.606 | 3.191 |
| 5/30/08 | 4.621 | 3.204 |
| 6/2/08 | 4.666 | 3.242 |
| 6/3/08 | 4.659 | 3.249 |
| 6/4/08 | 4.644 | 3.235 |
| 6/5/08 | 4.595 | 3.171 |
| 6/6/08 | 4.632 | 3.209 |
| 6/9/08 | 4.631 | 3.223 |
| 6/10/08 | 4.584 | 3.162 |
| 6/11/08 | 4.587 | 3.143 |
| 6/12/08 | 4.548 | 3.115 |
| 6/13/08 | 4.531 | 3.074 |
| 6/16/08 | 4.548 | 3.079 |
| 6/17/08 | 4.564 | 3.128 |
| 6/18/08 | 4.587 | 3.144 |
| 6/19/08 | 4.566 | 3.115 |
| 6/20/08 | 4.598 | 3.138 |
| 6/23/08 | 4.618 | 3.164 |
| 6/24/08 | 4.692 | 3.245 |
| 6/25/08 | 4.692 | 3.245 |
| 6/26/08 | 4.671 | 3.212 |
| 6/27/08 | 4.686 | 3.209 |
| 6/30/08 | 4.669 | 3.179 |
| 7/2/08 | 4.677 | 3.184 |
| 7/3/08 | 4.682 | 3.19 |
| 7/4/08 | 4.695 | 3.206 |
| 7/7/08 | 4.71 | 3.221 |
| 7/8/08 | 4.704 | 3.221 |
| 7/9/08 | 4.694 | 3.205 |
| 7/10/08 | 4.69 | 3.196 |
| 7/11/08 | 4.667 | 3.174 |
| 7/14/08 | 4.696 | 3.189 |
| 7/15/08 | 4.686 | 3.203 |
| 7/16/08 | 4.623 | 3.133 |
| 7/17/08 | 4.606 | 3.109 |
| 7/18/08 | 4.595 | 3.1 |
| 7/21/08 | 4.599 | 3.098 |
| 7/22/08 | 4.583 | 3.087 |
| 7/23/08 | 4.584 | 3.093 |
| 7/24/08 | 4.619 | 3.12 |
| 7/25/08 | 4.589 | 3.108 |
| 7/28/08 | 4.624 | 3.139 |
| 7/29/08 | 4.611 | 3.139 |
| 7/30/08 | 4.582 | 3.12 |
| 7/31/08 | 4.653 | 3.169 |
| 8/1/08 | 4.678 | 3.183 |
| 8/5/08 | 4.647 | 3.165 |
| 8/6/08 | 4.634 | 3.152 |
| 8/7/08 | 4.678 | 3.197 |
| 8/8/08 | 4.697 | 3.208 |
| 8/11/08 | 4.698 | 3.194 |
| 8/12/08 | 4.719 | 3.21 |
| 8/13/08 | 4.718 | 3.202 |
| 8/14/08 | 4.733 | 3.214 |
| 8/15/08 | 4.747 | 3.219 |
| 8/18/08 | 4.762 | 3.236 |
| 8/19/08 | 4.731 | 3.208 |
| 8/20/08 | 4.716 | 3.152 |
| 8/21/08 | 4.705 | 3.118 |
| 8/22/08 | 4.696 | 3.095 |
| 8/25/08 | 4.722 | 3.141 |
| 8/26/08 | 4.742 | 3.144 |
| 8/27/08 | 4.74 | 3.105 |
| 8/28/08 | 4.749 | 3.117 |
| 8/29/08 | 4.733 | 3.084 |
| 9/2/08 | 4.755 | 3.101 |
| 9/3/08 | 4.762 | 3.071 |
| 9/4/08 | 4.796 | 3.084 |
| 9/5/08 | 4.806 | 3.088 |
| 9/8/08 | 4.806 | 3.072 |
| 9/9/08 | 4.817 | 3.078 |
| 9/10/08 | 4.812 | 3.088 |
| 9/11/08 | 4.789 | 3.047 |
| 9/12/08 | 4.698 | 2.955 |
| 9/15/08 | 4.835 | 3.106 |
| 9/16/08 | 4.798 | 3.032 |
| 9/17/08 | 4.802 | 3 |
| 9/18/08 | 4.716 | 2.883 |
| 9/19/08 | 4.613 | 2.79 |
| 9/22/08 | 4.645 | 2.818 |
| 9/23/08 | 4.645 | 2.768 |
| 9/24/08 | 4.629 | 2.759 |
| 9/25/08 | 4.625 | 2.755 |
| 9/26/08 | 4.613 | 2.708 |
| 9/29/08 | 4.726 | 2.821 |
| 9/30/08 | 4.517 | 2.573 |
| 10/1/08 | 4.564 | 2.617 |
| 10/2/08 | 4.605 | 2.657 |
| 10/3/08 | 4.654 | 2.695 |
| 10/6/08 | 4.762 | 2.783 |
| 10/7/08 | 4.683 | 2.69 |
| 10/8/08 | 4.616 | 2.611 |
| 10/9/08 | 4.59 | 2.526 |
| 10/10/08 | 4.496 | 2.432 |
| 10/14/08 | 4.473 | 2.333 |
| 10/15/08 | 4.559 | 2.367 |
| 10/16/08 | 4.544 | 2.327 |
| 10/17/08 | 4.517 | 2.24 |
| 10/20/08 | 4.526 | 2.19 |
| 10/21/08 | 4.567 | 2.218 |
| 10/22/08 | 4.652 | 2.277 |
| 10/23/08 | 4.646 | 2.287 |
| 10/24/08 | 4.623 | 2.254 |
| 10/27/08 | 4.624 | 2.223 |
| 10/28/08 | 4.549 | 2.11 |
| 10/29/08 | 4.485 | 2.03 |
| 10/30/08 | 4.507 | 2.033 |
| 10/31/08 | 4.471 | 1.987 |
| 11/3/08 | 4.458 | 1.999 |
| 11/4/08 | 4.5 | 2.014 |
| 11/5/08 | 4.519 | 1.992 |
| 11/6/08 | 4.515 | 1.979 |
| 11/7/08 | 4.521 | 1.979 |
| 11/10/08 | 4.513 | 1.899 |
| 11/12/08 | 4.521 | 1.961 |
| 11/13/08 | 4.45 | 1.856 |
| 11/14/08 | 4.531 | 1.927 |
| 11/17/08 | 4.597 | 1.93 |
| 11/18/08 | 4.618 | 1.946 |
| 11/19/08 | 4.662 | 1.989 |
| 11/20/08 | 4.81 | 2.114 |
| 11/21/08 | 4.704 | 1.958 |
| 11/24/08 | 4.683 | 1.95 |
| 11/25/08 | 4.776 | 2.052 |
| 11/26/08 | 4.81 | 2.033 |
| 11/27/08 | 4.822 | 2.004 |
| 11/28/08 | 4.848 | 2.004 |
| 12/1/08 | 4.992 | 2.132 |
| 12/2/08 | 4.978 | 2.135 |
| 12/3/08 | 4.954 | 2.032 |
| 12/4/08 | 5.006 | 2.038 |
| 12/5/08 | 4.985 | 2.01 |
| 12/8/08 | 4.987 | 1.958 |
| 12/9/08 | 5.005 | 2.027 |
| 12/10/08 | 4.998 | 2.051 |
| 12/11/08 | 5.014 | 2.077 |
| 12/12/08 | 4.988 | 2.066 |
| 12/15/08 | 5.002 | 2.058 |
| 12/16/08 | 5.086 | 2.135 |
| 12/17/08 | 5.206 | 2.259 |
| 12/18/08 | 5.296 | 2.308 |
| 12/19/08 | 5.295 | 2.242 |
| 12/22/08 | 5.279 | 2.253 |
| 12/23/08 | 5.263 | 2.257 |
| 12/24/08 | 5.261 | 2.264 |
| 12/29/08 | 5.356 | 2.364 |
| 12/30/08 | 5.333 | 2.325 |
| 12/31/08 | 5.295 | 2.279 |
| 1/2/09 | 5.452 | 2.456 |
| 1/5/09 | 5.364 | 2.364 |
| 1/6/09 | 5.351 | 2.344 |
| 1/7/09 | 5.298 | 2.292 |
| 1/8/09 | 5.328 | 2.322 |
| 1/9/09 | 5.369 | 2.351 |
| 1/12/09 | 5.399 | 2.37 |
| 1/13/09 | 5.436 | 2.42 |
| 1/14/09 | 5.568 | 2.594 |
| 1/15/09 | 5.52 | 2.556 |
| 1/16/09 | 5.453 | 2.473 |
| 1/19/09 | 5.392 | 2.392 |
| 1/20/09 | 5.444 | 2.449 |
| 1/21/09 | 5.381 | 2.368 |
| 1/22/09 | 5.378 | 2.349 |
| 1/23/09 | 5.351 | 2.332 |
| 1/26/09 | 5.284 | 2.247 |
| 1/27/09 | 5.319 | 2.302 |
| 1/28/09 | 5.286 | 2.278 |
| 1/29/09 | 5.197 | 2.209 |
| 1/30/09 | 5.232 | 2.264 |
| 2/2/09 | 5.311 | 2.346 |
| 2/3/09 | 5.246 | 2.308 |
| 2/4/09 | 5.211 | 2.308 |
| 2/5/09 | 5.274 | 2.381 |
| 2/6/09 | 5.232 | 2.295 |
| 2/9/09 | 5.198 | 2.231 |
| 2/10/09 | 5.271 | 2.287 |
| 2/11/09 | 5.31 | 2.319 |
| 2/12/09 | 5.348 | 2.377 |
| 2/13/09 | 5.328 | 2.35 |
| 2/17/09 | 5.439 | 2.471 |
| 2/18/09 | 5.417 | 2.426 |
| 2/19/09 | 5.371 | 2.351 |
| 2/20/09 | 5.406 | 2.426 |
| 2/23/09 | 5.423 | 2.438 |
| 2/24/09 | 5.399 | 2.425 |
| 2/25/09 | 5.311 | 2.336 |
| 2/26/09 | 5.293 | 2.318 |
| 2/27/09 | 5.296 | 2.328 |
| 3/2/09 | 5.382 | 2.428 |
| 3/3/09 | 5.368 | 2.396 |
| 3/4/09 | 5.328 | 2.364 |
| 3/5/09 | 5.434 | 2.476 |
| 3/6/09 | 5.387 | 2.418 |
| 3/9/09 | 5.359 | 2.388 |
| 3/10/09 | 5.297 | 2.318 |
| 3/11/09 | 5.338 | 2.369 |
| 3/12/09 | 5.362 | 2.378 |
| 3/13/09 | 5.403 | 2.422 |
| 3/16/09 | 5.391 | 2.405 |
| 3/17/09 | 5.362 | 2.399 |
| 3/18/09 | 5.462 | 2.486 |
| 3/19/09 | 5.439 | 2.456 |
| 3/20/09 | 5.401 | 2.439 |
| 3/23/09 | 5.388 | 2.437 |
| 3/24/09 | 5.314 | 2.378 |
| 3/25/09 | 5.264 | 2.329 |
| 3/26/09 | 5.353 | 2.494 |
| 3/27/09 | 5.348 | 2.478 |
| 3/30/09 | 5.406 | 2.53 |
| 3/31/09 | 5.439 | 2.571 |
| 4/1/09 | 5.446 | 2.561 |
| 4/2/09 | 5.392 | 2.525 |
| 4/3/09 | 5.334 | 2.502 |
| 4/6/09 | 5.288 | 2.46 |
| 4/7/09 | 5.33 | 2.496 |
| 4/8/09 | 5.371 | 2.533 |
| 4/9/09 | 5.351 | 2.524 |
| 4/13/09 | 5.353 | 2.532 |
| 4/14/09 | 5.363 | 2.567 |
| 4/15/09 | 5.333 | 2.567 |
| 4/16/09 | 5.298 | 2.56 |
| 4/17/09 | 5.246 | 2.527 |
| 4/20/09 | 5.345 | 2.65 |
| 4/21/09 | 5.306 | 2.628 |
| 4/22/09 | 5.269 | 2.571 |
| 4/23/09 | 5.243 | 2.547 |
| 4/24/09 | 5.237 | 2.551 |
| 4/27/09 | 5.242 | 2.564 |
| 4/28/09 | 5.207 | 2.553 |
| 4/29/09 | 5.178 | 2.533 |
| 4/30/09 | 5.159 | 2.524 |
| 5/1/09 | 5.16 | 2.56 |
| 5/4/09 | 5.146 | 2.59 |
| 5/5/09 | 5.159 | 2.611 |
| 5/6/09 | 5.134 | 2.643 |
| 5/7/09 | 5.071 | 2.601 |
| 5/8/09 | 5.073 | 2.593 |
| 5/11/09 | 5.11 | 2.678 |
| 5/12/09 | 5.094 | 2.65 |
| 5/13/09 | 5.135 | 2.773 |
| 5/14/09 | 5.145 | 2.814 |
| 5/15/09 | 5.143 | 2.812 |
| 5/19/09 | 5.1 | 2.761 |
| 5/20/09 | 5.101 | 2.799 |
| 5/21/09 | 5.018 | 2.734 |
| 5/22/09 | 5.029 | 2.762 |
| 5/25/09 | 5.024 | 2.762 |
| 5/26/09 | 4.914 | 2.645 |
| 5/27/09 | 4.813 | 2.59 |
| 5/28/09 | 4.931 | 2.744 |
| 5/29/09 | 5.006 | 2.845 |
| 6/1/09 | 4.958 | 2.816 |
| 6/2/09 | 4.988 | 2.87 |
| 6/3/09 | 5.037 | 2.971 |
| 6/4/09 | 5.003 | 2.946 |
| 6/5/09 | 5.02 | 2.974 |
| 6/8/09 | 4.998 | 3.003 |
| 6/9/09 | 4.97 | 2.974 |
| 6/10/09 | 4.895 | 2.928 |
| 6/11/09 | 4.994 | 3.056 |
| 6/12/09 | 5.054 | 3.125 |
| 6/15/09 | 5.066 | 3.167 |
| 6/16/09 | 5.1 | 3.213 |
| 6/17/09 | 5.097 | 3.229 |
| 6/18/09 | 5.03 | 3.212 |
| 6/19/09 | 5.031 | 3.209 |
| 6/22/09 | 5.093 | 3.276 |
| 6/23/09 | 5.113 | 3.351 |
| 6/24/09 | 5.091 | 3.327 |
| 6/25/09 | 5.096 | 3.329 |
| 6/26/09 | 5.104 | 3.345 |
| 6/29/09 | 5.108 | 3.359 |
| 6/30/09 | 5.138 | 3.388 |
| 7/2/09 | 5.154 | 3.392 |
| 7/3/09 | 5.152 | 3.391 |
| 7/6/09 | 5.135 | 3.383 |
| 7/7/09 | 5.143 | 3.396 |
| 7/8/09 | 5.166 | 3.424 |
| 7/9/09 | 5.127 | 3.38 |
| 7/10/09 | 5.136 | 3.404 |
| 7/13/09 | 5.096 | 3.358 |
| 7/14/09 | 5.014 | 3.275 |
| 7/15/09 | 4.975 | 3.241 |
| 7/16/09 | 5.039 | 3.316 |
| 7/17/09 | 4.987 | 3.288 |
| 7/20/09 | 5.037 | 3.381 |
| 7/21/09 | 5.027 | 3.348 |
| 7/22/09 | 4.988 | 3.333 |
| 7/23/09 | 4.95 | 3.29 |
| 7/24/09 | 4.943 | 3.29 |
| 7/27/09 | 4.929 | 3.275 |
| 7/28/09 | 4.952 | 3.318 |
| 7/29/09 | 4.951 | 3.323 |
| 7/30/09 | 4.949 | 3.327 |
| 7/31/09 | 5.046 | 3.443 |
| 8/4/09 | 4.985 | 3.428 |
| 8/5/09 | 4.938 | 3.393 |
| 8/6/09 | 4.975 | 3.457 |
| 8/7/09 | 4.926 | 3.428 |
| 8/10/09 | 4.963 | 3.458 |
| 8/11/09 | 5.018 | 3.545 |
| 8/12/09 | 5.002 | 3.532 |
| 8/13/09 | 5.021 | 3.551 |
| 8/14/09 | 5.055 | 3.585 |
| 8/17/09 | 5.11 | 3.626 |
| 8/18/09 | 5.098 | 3.658 |
| 8/19/09 | 5.101 | 3.654 |
| 8/20/09 | 5.108 | 3.659 |
| 8/21/09 | 5.048 | 3.61 |
| 8/24/09 | 5.088 | 3.645 |
| 8/25/09 | 5.098 | 3.662 |
| 8/26/09 | 5.099 | 3.663 |
| 8/27/09 | 5.105 | 3.669 |
| 8/28/09 | 5.093 | 3.671 |
| 8/31/09 | 5.109 | 3.69 |
| 9/1/09 | 5.12 | 3.713 |
| 9/2/09 | 5.141 | 3.78 |
| 9/3/09 | 5.126 | 3.755 |
| 9/4/09 | 5.107 | 3.748 |
| 9/8/09 | 5.071 | 3.657 |
| 9/9/09 | 5.056 | 3.643 |
| 9/10/09 | 5.13 | 3.709 |
| 9/11/09 | 5.138 | 3.774 |
| 9/14/09 | 5.1 | 3.736 |
| 9/15/09 | 5.103 | 3.722 |
| 9/16/09 | 5.116 | 3.694 |
| 9/17/09 | 5.125 | 3.692 |
| 9/18/09 | 5.09 | 3.632 |
| 9/21/09 | 5.071 | 3.632 |
| 9/22/09 | 5.063 | 3.627 |
| 9/23/09 | 5.069 | 3.633 |
| 9/24/09 | 5.093 | 3.655 |
| 9/25/09 | 5.116 | 3.676 |
| 9/28/09 | 5.136 | 3.696 |
| 9/29/09 | 5.138 | 3.702 |
| 9/30/09 | 5.157 | 3.721 |
| 10/1/09 | 5.187 | 3.764 |
| 10/2/09 | 5.176 | 3.738 |
| 10/5/09 | 5.193 | 3.754 |
| 10/6/09 | 5.158 | 3.714 |
| 10/7/09 | 5.159 | 3.712 |
| 10/8/09 | 5.107 | 3.663 |
| 10/9/09 | 5.035 | 3.578 |
| 10/13/09 | 5.054 | 3.597 |
| 10/14/09 | 5.018 | 3.58 |
| 10/15/09 | 4.992 | 3.564 |
| 10/16/09 | 5.048 | 3.625 |
| 10/19/09 | 5.029 | 3.605 |
| 10/20/09 | 5.071 | 3.67 |
| 10/21/09 | 5.059 | 3.673 |
| 10/22/09 | 5.052 | 3.657 |
| 10/23/09 | 5.024 | 3.642 |
| 10/26/09 | 4.984 | 3.608 |
| 10/27/09 | 5.013 | 3.622 |
| 10/28/09 | 5.039 | 3.647 |
| 10/29/09 | 5.021 | 3.606 |
| 10/30/09 | 5.076 | 3.647 |
| 11/2/09 | 5.059 | 3.628 |
| 11/3/09 | 5.059 | 3.636 |
| 11/4/09 | 5.004 | 3.614 |
| 11/5/09 | 4.961 | 3.552 |
| 11/6/09 | 4.963 | 3.558 |
| 11/9/09 | 4.978 | 3.582 |
| 11/10/09 | 4.983 | 3.595 |
| 11/12/09 | 4.968 | 3.569 |
| 11/13/09 | 5.006 | 3.606 |
| 11/16/09 | 5.07 | 3.668 |
| 11/17/09 | 5.087 | 3.676 |
| 11/18/09 | 5.049 | 3.647 |
| 11/19/09 | 5.076 | 3.66 |
| 11/20/09 | 5.07 | 3.666 |
| 11/23/09 | 5.07 | 3.635 |
| 11/24/09 | 5.144 | 3.694 |
| 11/25/09 | 5.152 | 3.703 |
| 11/26/09 | 5.18 | 3.731 |
| 11/27/09 | 5.162 | 3.701 |
| 11/30/09 | 5.159 | 3.686 |
| 12/1/09 | 5.132 | 3.661 |
| 12/2/09 | 5.118 | 3.649 |
| 12/3/09 | 5.132 | 3.662 |
| 12/4/09 | 5.083 | 3.618 |
| 12/7/09 | 5.098 | 3.627 |
| 12/8/09 | 5.072 | 3.598 |
| 12/9/09 | 5.039 | 3.543 |
| 12/10/09 | 5.003 | 3.506 |
| 12/11/09 | 4.999 | 3.507 |
| 12/14/09 | 4.99 | 3.497 |
| 12/15/09 | 4.992 | 3.498 |
| 12/16/09 | 5.008 | 3.527 |
| 12/17/09 | 5.029 | 3.524 |
| 12/18/09 | 4.991 | 3.493 |
| 12/21/09 | 4.916 | 3.408 |
| 12/22/09 | 4.872 | 3.402 |
| 12/23/09 | 4.927 | 3.41 |
| 12/24/09 | 4.916 | 3.41 |
| 12/29/09 | 4.899 | 3.395 |
| 12/30/09 | 4.921 | 3.381 |
| 12/31/09 | 4.921 | 3.406 |
| 1/4/10 | 4.902 | 3.39 |
| 1/5/10 | 4.92 | 3.432 |
| 1/6/10 | 4.861 | 3.403 |
| 1/7/10 | 4.847 | 3.384 |
| 1/8/10 | 4.879 | 3.435 |
| 1/11/10 | 4.864 | 3.45 |
| 1/12/10 | 4.903 | 3.497 |
| 1/13/10 | 4.858 | 3.469 |
| 1/14/10 | 4.906 | 3.526 |
| 1/15/10 | 4.944 | 3.593 |
| 1/18/10 | 4.961 | 3.61 |
| 1/19/10 | 4.954 | 3.59 |
| 1/20/10 | 4.985 | 3.594 |
| 1/21/10 | 5 | 3.628 |
| 1/22/10 | 5.002 | 3.624 |
| 1/25/10 | 4.996 | 3.625 |
| 1/26/10 | 5.027 | 3.649 |
| 1/27/10 | 5.04 | 3.66 |
| 1/28/10 | 5.059 | 3.683 |
| 1/29/10 | 5.052 | 3.663 |
| 2/1/10 | 5.019 | 3.629 |
| 2/2/10 | 5.01 | 3.62 |
| 2/3/10 | 4.958 | 3.581 |
| 2/4/10 | 5.004 | 3.634 |
| 2/5/10 | 4.999 | 3.633 |
| 2/8/10 | 5.009 | 3.606 |
| 2/9/10 | 4.99 | 3.578 |
| 2/10/10 | 4.96 | 3.57 |
| 2/11/10 | 4.94 | 3.536 |
| 2/12/10 | 4.935 | 3.528 |
| 2/16/10 | 4.935 | 3.527 |
| 2/17/10 | 4.917 | 3.522 |
| 2/18/10 | 4.92 | 3.536 |
| 2/19/10 | 4.922 | 3.53 |
| 2/22/10 | 4.91 | 3.517 |
| 2/23/10 | 4.968 | 3.571 |
| 2/24/10 | 4.949 | 3.579 |
| 2/25/10 | 4.972 | 3.586 |
| 2/26/10 | 4.983 | 3.609 |
| 3/1/10 | 4.979 | 3.607 |
| 3/2/10 | 4.998 | 3.622 |
| 3/3/10 | 4.988 | 3.613 |
| 3/4/10 | 4.988 | 3.608 |
| 3/5/10 | 4.939 | 3.557 |
| 3/8/10 | 4.903 | 3.531 |
| 3/9/10 | 4.887 | 3.52 |
| 3/10/10 | 4.875 | 3.509 |
| 3/11/10 | 4.918 | 3.581 |
| 3/12/10 | 4.909 | 3.54 |
| 3/15/10 | 4.933 | 3.599 |
| 3/16/10 | 4.977 | 3.667 |
| 3/17/10 | 4.955 | 3.645 |
| 3/18/10 | 4.978 | 3.67 |
| 3/19/10 | 4.95 | 3.631 |
| 3/22/10 | 4.967 | 3.681 |
| 3/23/10 | 4.969 | 3.668 |
| 3/24/10 | 4.909 | 3.608 |
| 3/25/10 | 4.908 | 3.631 |
| 3/26/10 | 4.911 | 3.641 |
| 3/29/10 | 4.898 | 3.607 |
| 3/30/10 | 4.9 | 3.612 |
| 3/31/10 | 4.933 | 3.633 |
| 4/1/10 | 4.947 | 3.694 |
| 4/5/10 | 4.881 | 3.586 |
| 4/6/10 | 4.883 | 3.596 |
| 4/7/10 | 4.932 | 3.651 |
| 4/8/10 | 4.9 | 3.609 |
| 4/9/10 | 4.935 | 3.657 |
| 4/12/10 | 4.938 | 3.665 |
| 4/13/10 | 4.921 | 3.641 |
| 4/14/10 | 4.893 | 3.64 |
| 4/15/10 | 4.895 | 3.628 |
| 4/16/10 | 4.912 | 3.667 |
| 4/19/10 | 4.933 | 3.639 |
| 4/20/10 | 4.925 | 3.608 |
| 4/21/10 | 4.932 | 3.655 |
| 4/22/10 | 4.916 | 3.656 |
| 4/23/10 | 4.927 | 3.661 |
| 4/26/10 | 4.935 | 3.651 |
| 4/27/10 | 4.983 | 3.683 |
| 4/28/10 | 4.952 | 3.606 |
| 4/29/10 | 4.951 | 3.638 |
| 4/30/10 | 4.989 | 3.715 |
| 5/3/10 | 4.999 | 3.705 |
| 5/4/10 | 5.05 | 3.726 |
| 5/5/10 | 5.065 | 3.746 |
| 5/6/10 | 5.118 | 3.778 |
| 5/7/10 | 5.115 | 3.732 |
| 5/10/10 | 5.065 | 3.646 |
| 5/11/10 | 5.066 | 3.637 |
| 5/12/10 | 5.055 | 3.636 |
| 5/13/10 | 5.133 | 3.7 |
| 5/14/10 | 5.182 | 3.709 |
| 5/17/10 | 5.109 | 3.676 |
| 5/18/10 | 5.182 | 3.765 |
| 5/19/10 | 5.183 | 3.695 |
| 5/20/10 | 5.254 | 3.763 |
| 5/21/10 | 5.232 | 3.712 |
| 5/25/10 | 5.306 | 3.781 |
| 5/26/10 | 5.314 | 3.722 |
| 5/27/10 | 5.245 | 3.626 |
| 5/28/10 | 5.289 | 3.704 |
| 5/31/10 | 5.275 | 3.642 |
| 6/1/10 | 5.302 | 3.686 |
| 6/2/10 | 5.221 | 3.63 |
| 6/3/10 | 5.217 | 3.626 |
| 6/4/10 | 5.283 | 3.7 |
| 6/7/10 | 5.281 | 3.696 |
| 6/8/10 | 5.271 | 3.688 |
| 6/9/10 | 5.239 | 3.652 |
| 6/10/10 | 5.175 | 3.602 |
| 6/11/10 | 5.19 | 3.614 |
| 6/14/10 | 5.161 | 3.576 |
| 6/15/10 | 5.172 | 3.596 |
| 6/16/10 | 5.207 | 3.648 |
| 6/17/10 | 5.253 | 3.678 |
| 6/18/10 | 5.239 | 3.674 |
| 6/21/10 | 5.233 | 3.667 |
| 6/22/10 | 5.291 | 3.721 |
| 6/23/10 | 5.302 | 3.733 |
| 6/24/10 | 5.302 | 3.764 |
| 6/25/10 | 5.314 | 3.802 |
| 6/28/10 | 5.317 | 3.788 |
| 6/29/10 | 5.345 | 3.808 |
| 6/30/10 | 5.353 | 3.816 |
| 7/2/10 | 5.353 | 3.81 |
| 7/5/10 | 5.37 | 3.831 |
| 7/6/10 | 5.36 | 3.818 |
| 7/7/10 | 5.303 | 3.743 |
| 7/8/10 | 5.273 | 3.785 |
| 7/9/10 | 5.248 | 3.756 |
| 7/12/10 | 5.256 | 3.782 |
| 7/13/10 | 5.22 | 3.746 |
| 7/14/10 | 5.212 | 3.746 |
| 7/15/10 | 5.228 | 3.742 |
| 7/16/10 | 5.275 | 3.815 |
| 7/19/10 | 5.263 | 3.798 |
| 7/20/10 | 5.233 | 3.759 |
| 7/21/10 | 5.267 | 3.807 |
| 7/22/10 | 5.229 | 3.722 |
| 7/23/10 | 5.219 | 3.727 |
| 7/26/10 | 5.225 | 3.736 |
| 7/27/10 | 5.202 | 3.702 |
| 7/28/10 | 5.222 | 3.743 |
| 7/29/10 | 5.243 | 3.742 |
| 7/30/10 | 5.302 | 3.81 |
| 8/3/10 | 5.311 | 3.809 |
| 8/4/10 | 5.282 | 3.812 |
| 8/5/10 | 5.33 | 3.871 |
| 8/6/10 | 5.349 | 3.864 |
| 8/9/10 | 5.347 | 3.877 |
| 8/10/10 | 5.364 | 3.891 |
| 8/11/10 | 5.394 | 3.908 |
| 8/12/10 | 5.368 | 3.882 |
| 8/13/10 | 5.398 | 3.926 |
| 8/16/10 | 5.451 | 3.965 |
| 8/17/10 | 5.431 | 3.937 |
| 8/18/10 | 5.454 | 3.96 |
| 8/19/10 | 5.48 | 3.987 |
| 8/20/10 | 5.475 | 3.989 |
| 8/23/10 | 5.468 | 3.991 |
| 8/24/10 | 5.494 | 3.988 |
| 8/25/10 | 5.526 | 4.02 |
| 8/26/10 | 5.568 | 4.069 |
| 8/27/10 | 5.506 | 3.977 |
| 8/30/10 | 5.565 | 4.055 |
| 8/31/10 | 5.567 | 4.017 |
| 9/1/10 | 5.498 | 3.941 |
| 9/2/10 | 5.482 | 3.907 |
| 9/3/10 | 5.431 | 3.887 |
| 9/7/10 | 5.533 | 4.001 |
| 9/8/10 | 5.47 | 3.893 |
| 9/9/10 | 5.448 | 3.925 |
| 9/10/10 | 5.444 | 3.92 |
| 9/13/10 | 5.464 | 3.928 |
| 9/14/10 | 5.471 | 3.91 |
| 9/15/10 | 5.46 | 3.927 |
| 9/16/10 | 5.451 | 3.928 |
| 9/17/10 | 5.494 | 3.961 |
| 9/20/10 | 5.495 | 3.947 |
| 9/21/10 | 5.519 | 3.971 |
| 9/22/10 | 5.567 | 4.038 |
| 9/23/10 | 5.586 | 4.048 |
| 9/24/10 | 5.573 | 4.052 |
| 9/27/10 | 5.614 | 4.122 |
| 9/28/10 | 5.667 | 4.117 |
| 9/29/10 | 5.668 | 4.129 |
| 9/30/10 | 5.643 | 4.139 |
| 10/1/10 | 5.61 | 4.136 |
| 10/4/10 | 5.632 | 4.155 |
| 10/5/10 | 5.614 | 4.094 |
| 10/6/10 | 5.623 | 4.145 |
| 10/7/10 | 5.58 | 4.078 |
| 10/8/10 | 5.597 | 4.113 |
| 10/12/10 | 5.567 | 4.028 |
| 10/13/10 | 5.56 | 4.037 |
| 10/14/10 | 5.547 | 4.018 |
| 10/15/10 | 5.508 | 3.999 |
| 10/18/10 | 5.517 | 4.033 |
| 10/19/10 | 5.551 | 4.038 |
| 10/20/10 | 5.536 | 4.024 |
| 10/21/10 | 5.551 | 4.079 |
| 10/22/10 | 5.558 | 4.07 |
| 10/25/10 | 5.574 | 4.078 |
| 10/26/10 | 5.542 | 4.055 |
| 10/27/10 | 5.5 | 4.025 |
| 10/28/10 | 5.515 | 4.05 |
| 10/29/10 | 5.554 | 4.067 |
| 11/1/10 | 5.526 | 4.03 |
| 11/2/10 | 5.516 | 4.084 |
| 11/3/10 | 5.503 | 4.059 |
| 11/4/10 | 5.524 | 4.084 |
| 11/5/10 | 5.513 | 4.047 |
| 11/8/10 | 5.495 | 4.064 |
| 11/9/10 | 5.427 | 4.03 |
| 11/10/10 | 5.408 | 4.061 |
| 11/12/10 | 5.373 | 4.029 |
| 11/15/10 | 5.273 | 3.918 |
| 11/16/10 | 5.321 | 3.98 |
| 11/17/10 | 5.328 | 3.976 |
| 11/18/10 | 5.334 | 3.958 |
| 11/19/10 | 5.384 | 3.968 |
| 11/22/10 | 5.414 | 3.999 |
| 11/23/10 | 5.403 | 3.956 |
| 11/24/10 | 5.353 | 3.952 |
| 11/25/10 | 5.365 | 3.965 |
| 11/26/10 | 5.428 | 3.981 |
| 11/29/10 | 5.477 | 4.02 |
| 11/30/10 | 5.517 | 4.048 |
| 12/1/10 | 5.422 | 3.971 |
| 12/2/10 | 5.393 | 3.974 |
| 12/3/10 | 5.364 | 3.951 |
| 12/6/10 | 5.398 | 3.984 |
| 12/7/10 | 5.323 | 3.919 |
| 12/8/10 | 5.319 | 3.917 |
| 12/9/10 | 5.311 | 3.899 |
| 12/10/10 | 5.283 | 3.872 |
| 12/13/10 | 5.338 | 3.925 |
| 12/14/10 | 5.242 | 3.818 |
| 12/15/10 | 5.255 | 3.854 |
| 12/16/10 | 5.32 | 3.892 |
| 12/17/10 | 5.393 | 3.962 |
| 12/20/10 | 5.415 | 3.984 |
| 12/21/10 | 5.444 | 4.021 |
| 12/22/10 | 5.433 | 4.008 |
| 12/23/10 | 5.432 | 4.015 |
| 12/24/10 | 5.441 | 4.024 |
| 12/29/10 | 5.456 | 4.039 |
| 12/30/10 | 5.452 | 4.03 |
| 12/31/10 | 5.472 | 4.039 |
| 1/4/11 | 5.174 | 3.758 |
| 1/5/11 | 5.088 | 3.696 |
| 1/6/11 | 5.108 | 3.715 |
| 1/7/11 | 5.134 | 3.742 |
| 1/10/11 | 5.149 | 3.756 |
| 1/11/11 | 5.105 | 3.713 |
| 1/12/11 | 5.068 | 3.694 |
| 1/13/11 | 5.082 | 3.696 |
| 1/14/11 | 5.058 | 3.664 |
| 1/17/11 | 5.063 | 3.676 |
| 1/18/11 | 5.042 | 3.65 |
| 1/19/11 | 5.06 | 3.679 |
| 1/20/11 | 5.007 | 3.612 |
| 1/21/11 | 5.005 | 3.63 |
| 1/24/11 | 4.998 | 3.613 |
| 1/25/11 | 5.021 | 3.628 |
| 1/26/11 | 4.993 | 3.605 |
| 1/27/11 | 5.024 | 3.645 |
| 1/28/11 | 5.041 | 3.645 |
| 1/31/11 | 5.021 | 3.625 |
| 2/1/11 | 4.982 | 3.587 |
| 2/2/11 | 4.962 | 3.584 |
| 2/3/11 | 4.946 | 3.562 |
| 2/4/11 | 4.929 | 3.548 |
| 2/7/11 | 4.946 | 3.575 |
| 2/8/11 | 4.902 | 3.512 |
| 2/9/11 | 4.938 | 3.589 |
| 2/10/11 | 4.914 | 3.56 |
| 2/11/11 | 4.921 | 3.577 |
| 2/14/11 | 4.906 | 3.562 |
| 2/15/11 | 4.911 | 3.572 |
| 2/16/11 | 4.894 | 3.553 |
| 2/17/11 | 4.891 | 3.56 |
| 2/18/11 | 4.894 | 3.57 |
| 2/22/11 | 4.963 | 3.634 |
| 2/23/11 | 4.998 | 3.671 |
| 2/24/11 | 5.022 | 3.692 |
| 2/25/11 | 5.046 | 3.713 |
| 2/28/11 | 5.051 | 3.719 |
| 3/1/11 | 5.046 | 3.727 |
| 3/2/11 | 5.002 | 3.676 |
| 3/3/11 | 4.95 | 3.635 |
| 3/4/11 | 4.977 | 3.665 |
| 3/7/11 | 4.955 | 3.616 |
| 3/8/11 | 4.904 | 3.552 |
| 3/9/11 | 4.96 | 3.619 |
| 3/10/11 | 5.009 | 3.65 |
| 3/11/11 | 4.996 | 3.616 |
| 3/14/11 | 5.012 | 3.643 |
| 3/15/11 | 5.031 | 3.655 |
| 3/16/11 | 5.073 | 3.693 |
| 3/17/11 | 5.032 | 3.647 |
| 3/18/11 | 5.039 | 3.666 |
| 3/21/11 | 5.016 | 3.642 |
| 3/22/11 | 5.051 | 3.688 |
| 3/23/11 | 5.051 | 3.673 |
| 3/24/11 | 5.051 | 3.665 |
| 3/25/11 | 5.047 | 3.663 |
| 3/28/11 | 5.042 | 3.644 |
| 3/29/11 | 5.001 | 3.617 |
| 3/30/11 | 5.029 | 3.641 |
| 3/31/11 | 4.994 | 3.592 |
| 4/1/11 | 4.976 | 3.597 |
| 4/4/11 | 4.983 | 3.591 |
| 4/5/11 | 4.98 | 3.598 |
| 4/6/11 | 4.93 | 3.547 |
| 4/7/11 | 4.905 | 3.519 |
| 4/8/11 | 4.906 | 3.508 |
| 4/11/11 | 4.88 | 3.484 |
| 4/12/11 | 4.93 | 3.538 |
| 4/13/11 | 4.963 | 3.554 |
| 4/14/11 | 4.971 | 3.564 |
| 4/15/11 | 5.024 | 3.62 |
| 4/18/11 | 5.062 | 3.654 |
| 4/19/11 | 5.037 | 3.641 |
| 4/20/11 | 4.982 | 3.581 |
| 4/21/11 | 5.012 | 3.604 |
| 4/25/11 | 5.042 | 3.63 |
| 4/26/11 | 5.071 | 3.663 |
| 4/27/11 | 5.009 | 3.595 |
| 4/28/11 | 5.042 | 3.626 |
| 4/29/11 | 5.061 | 3.634 |
| 5/2/11 | 5.061 | 3.635 |
| 5/3/11 | 5.114 | 3.7 |
| 5/4/11 | 5.152 | 3.729 |
| 5/5/11 | 5.185 | 3.753 |
| 5/6/11 | 5.167 | 3.723 |
| 5/9/11 | 5.161 | 3.715 |
| 5/10/11 | 5.105 | 3.669 |
| 5/11/11 | 5.131 | 3.719 |
| 5/12/11 | 5.124 | 3.702 |
| 5/13/11 | 5.161 | 3.734 |
| 5/16/11 | 5.171 | 3.733 |
| 5/17/11 | 5.187 | 3.76 |
| 5/18/11 | 5.141 | 3.705 |
| 5/19/11 | 5.155 | 3.723 |
| 5/20/11 | 5.186 | 3.748 |
| 5/24/11 | 5.225 | 3.756 |
| 5/25/11 | 5.246 | 3.807 |
| 5/26/11 | 5.267 | 3.834 |
| 5/27/11 | 5.249 | 3.826 |
| 5/30/11 | 5.254 | 3.83 |
| 5/31/11 | 5.256 | 3.815 |
| 6/1/11 | 5.293 | 3.866 |
| 6/2/11 | 5.254 | 3.816 |
| 6/3/11 | 5.274 | 3.826 |
| 6/6/11 | 5.255 | 3.803 |
| 6/7/11 | 5.23 | 3.772 |
| 6/8/11 | 5.258 | 3.817 |
| 6/9/11 | 5.232 | 3.774 |
| 6/10/11 | 5.271 | 3.808 |
| 6/13/11 | 5.288 | 3.825 |
| 6/14/11 | 5.241 | 3.788 |
| 6/15/11 | 5.327 | 3.88 |
| 6/16/11 | 5.359 | 3.903 |
| 6/17/11 | 5.352 | 3.896 |
| 6/20/11 | 5.332 | 3.877 |
| 6/21/11 | 5.326 | 3.865 |
| 6/22/11 | 5.332 | 3.876 |
| 6/23/11 | 5.375 | 3.917 |
| 6/24/11 | 5.384 | 3.918 |
| 6/27/11 | 5.331 | 3.864 |
| 6/28/11 | 5.282 | 3.845 |
| 6/29/11 | 5.216 | 3.757 |
| 6/30/11 | 5.203 | 3.758 |
| 7/4/11 | 5.221 | 3.788 |
| 7/5/11 | 5.232 | 3.774 |
| 7/6/11 | 5.248 | 3.806 |
| 7/7/11 | 5.257 | 3.822 |
| 7/8/11 | 5.334 | 3.884 |
| 7/11/11 | 5.387 | 3.946 |
| 7/12/11 | 5.393 | 3.949 |
| 7/13/11 | 5.37 | 3.929 |
| 7/14/11 | 5.349 | 3.909 |
| 7/15/11 | 5.403 | 3.958 |
| 7/18/11 | 5.391 | 3.952 |
| 7/19/11 | 5.402 | 3.967 |
| 7/20/11 | 5.359 | 3.932 |
| 7/21/11 | 5.309 | 3.88 |
| 7/22/11 | 5.36 | 3.929 |
| 7/25/11 | 5.353 | 3.92 |
| 7/26/11 | 5.381 | 3.949 |
| 7/27/11 | 5.398 | 3.976 |
| 7/28/11 | 5.403 | 3.976 |
| 7/29/11 | 5.461 | 4.047 |
| 8/2/11 | 5.582 | 4.156 |
| 8/3/11 | 5.561 | 4.15 |
| 8/4/11 | 5.659 | 4.246 |
| 8/5/11 | 5.529 | 4.086 |
| 8/8/11 | 5.622 | 4.177 |
| 8/9/11 | 5.67 | 4.204 |
| 8/10/11 | 5.768 | 4.285 |
| 8/11/11 | 5.674 | 4.184 |
| 8/12/11 | 5.657 | 4.143 |
| 8/15/11 | 5.613 | 4.097 |
| 8/16/11 | 5.635 | 4.116 |
| 8/17/11 | 5.7 | 4.172 |
| 8/18/11 | 5.791 | 4.257 |
| 8/19/11 | 5.79 | 4.249 |
| 8/22/11 | 5.798 | 4.252 |
| 8/23/11 | 5.732 | 4.196 |
| 8/24/11 | 5.666 | 4.136 |
| 8/25/11 | 5.709 | 4.157 |
| 8/26/11 | 5.739 | 4.185 |
| 8/29/11 | 5.689 | 4.122 |
| 8/30/11 | 5.731 | 4.158 |
| 8/31/11 | 5.644 | 4.061 |
| 9/1/11 | 5.711 | 4.134 |
| 9/2/11 | 5.787 | 4.196 |
| 9/6/11 | 5.833 | 4.24 |
| 9/7/11 | 5.803 | 4.21 |
| 9/8/11 | 5.859 | 4.25 |
| 9/9/11 | 5.941 | 4.339 |
| 9/12/11 | 5.937 | 4.355 |
| 9/13/11 | 5.91 | 4.322 |
| 9/14/11 | 5.898 | 4.314 |
| 9/15/11 | 5.831 | 4.204 |
| 9/16/11 | 5.822 | 4.214 |
| 9/19/11 | 5.881 | 4.292 |
| 9/20/11 | 5.888 | 4.306 |
| 9/21/11 | 5.984 | 4.377 |
| 9/22/11 | 6.069 | 4.431 |
| 9/23/11 | 6.044 | 4.468 |
| 9/26/11 | 5.979 | 4.376 |
| 9/27/11 | 5.925 | 4.318 |
| 9/28/11 | 5.921 | 4.275 |
| 9/29/11 | 5.908 | 4.241 |
| 9/30/11 | 5.978 | 4.336 |
| 10/3/11 | 6.059 | 4.427 |
| 10/4/11 | 6.044 | 4.409 |
| 10/5/11 | 6.016 | 4.379 |
| 10/6/11 | 5.949 | 4.283 |
| 10/7/11 | 5.93 | 4.27 |
| 10/11/11 | 5.878 | 4.216 |
| 10/12/11 | 5.804 | 4.141 |
| 10/13/11 | 5.858 | 4.179 |
| 10/14/11 | 5.778 | 4.146 |
| 10/17/11 | 5.867 | 4.281 |
| 10/18/11 | 5.841 | 4.246 |
| 10/19/11 | 5.811 | 4.212 |
| 10/20/11 | 5.813 | 4.221 |
| 10/21/11 | 5.766 | 4.174 |
| 10/24/11 | 5.756 | 4.164 |
| 10/25/11 | 5.826 | 4.217 |
| 10/26/11 | 5.721 | 4.106 |
| 10/27/11 | 5.612 | 3.981 |
| 10/28/11 | 5.691 | 4.095 |
| 10/31/11 | 5.824 | 4.244 |
| 11/1/11 | 5.957 | 4.361 |
| 11/2/11 | 5.938 | 4.368 |
| 11/3/11 | 5.892 | 4.304 |
| 11/4/11 | 5.923 | 4.332 |
| 11/7/11 | 5.936 | 4.346 |
| 11/8/11 | 5.941 | 4.357 |
| 11/9/11 | 6.027 | 4.424 |
| 11/10/11 | 6 | 4.414 |
| 11/14/11 | 6.004 | 4.417 |
| 11/15/11 | 5.996 | 4.433 |
| 11/16/11 | 6.028 | 4.448 |
| 11/17/11 | 6.037 | 4.455 |
| 11/18/11 | 6.009 | 4.433 |
| 11/21/11 | 6.032 | 4.446 |
| 11/22/11 | 6.074 | 4.488 |
| 11/23/11 | 6.121 | 4.522 |
| 11/24/11 | 6.12 | 4.521 |
| 11/25/11 | 6.106 | 4.489 |
| 11/28/11 | 6.077 | 4.454 |
| 11/29/11 | 6.079 | 4.456 |
| 11/30/11 | 6.058 | 4.456 |
| 12/1/11 | 6.054 | 4.423 |
| 12/2/11 | 6.073 | 4.456 |
| 12/5/11 | 6.097 | 4.477 |
| 12/6/11 | 6.067 | 4.452 |
| 12/7/11 | 6.126 | 4.527 |
| 12/8/11 | 6.168 | 4.573 |
| 12/9/11 | 6.092 | 4.511 |
| 12/12/11 | 6.132 | 4.544 |
| 12/13/11 | 6.183 | 4.591 |
| 12/14/11 | 6.213 | 4.614 |
| 12/15/11 | 6.222 | 4.623 |
| 12/16/11 | 6.296 | 4.647 |
| 12/19/11 | 6.337 | 4.713 |
| 12/20/11 | 6.285 | 4.743 |
| 12/21/11 | 6.256 | 4.678 |
| 12/22/11 | 6.252 | 4.696 |
| 12/23/11 | 6.204 | 4.633 |
| 12/28/11 | 6.247 | 4.644 |
| 12/29/11 | 6.253 | 4.697 |
| 12/30/11 | 6.256 | 4.698 |
| 1/3/12 | 6.197 | 4.643 |
| 1/4/12 | 6.176 | 4.625 |
| 1/5/12 | 6.203 | 4.652 |
| 1/6/12 | 6.23 | 4.66 |
| 1/9/12 | 6.23 | 4.71 |
| 1/10/12 | 6.204 | 4.715 |
| 1/11/12 | 6.247 | 4.733 |
| 1/12/12 | 6.2 | 4.742 |
| 1/13/12 | 6.243 | 4.753 |
| 1/16/12 | 6.239 | 4.756 |
| 1/17/12 | 6.248 | 4.771 |
| 1/18/12 | 6.221 | 4.742 |
| 1/19/12 | 6.178 | 4.715 |
| 1/20/12 | 6.123 | 4.744 |
| 1/23/12 | 6.085 | 4.688 |
| 1/24/12 | 6.081 | 4.656 |
| 1/25/12 | 6.099 | 4.698 |
| 1/26/12 | 6.124 | 4.693 |
| 1/27/12 | 6.148 | 4.718 |
| 1/30/12 | 6.202 | 4.721 |
| 1/31/12 | 6.246 | 4.81 |
| 2/1/12 | 6.235 | 4.8 |
| 2/2/12 | 6.197 | 4.763 |
| 2/3/12 | 6.14 | 4.728 |
| 2/6/12 | 6.174 | 4.728 |
| 2/7/12 | 6.128 | 4.778 |
| 2/8/12 | 6.108 | 4.718 |
| 2/9/12 | 6.099 | 4.727 |
| 2/10/12 | 6.134 | 4.75 |
| 2/13/12 | 6.112 | 4.743 |
| 2/14/12 | 6.15 | 4.783 |
| 2/15/12 | 6.152 | 4.791 |
| 2/16/12 | 6.134 | 4.768 |
| 2/17/12 | 6.119 | 4.73 |
| 2/21/12 | 6.082 | 4.691 |
| 2/22/12 | 6.108 | 4.72 |
| 2/23/12 | 6.107 | 4.721 |
| 2/24/12 | 6.114 | 4.731 |
| 2/27/12 | 6.125 | 4.735 |
| 2/28/12 | 6.154 | 4.734 |
| 2/29/12 | 6.152 | 4.771 |
| 3/1/12 | 6.136 | 4.751 |
| 3/2/12 | 6.17 | 4.778 |
| 3/5/12 | 6.164 | 4.787 |
| 3/6/12 | 6.199 | 4.782 |
| 3/7/12 | 6.178 | 4.79 |
| 3/8/12 | 6.154 | 4.742 |
| 3/9/12 | 6.155 | 4.756 |
| 3/12/12 | 6.171 | 4.772 |
| 3/13/12 | 6.112 | 4.737 |
| 3/14/12 | 6.05 | 4.749 |
| 3/15/12 | 6.016 | 4.646 |
| 3/16/12 | 5.982 | 4.608 |
| 3/19/12 | 5.932 | 4.62 |
| 3/20/12 | 5.944 | 4.594 |
| 3/21/12 | 5.985 | 4.632 |
| 3/22/12 | 6.02 | 4.662 |
| 3/23/12 | 6.033 | 4.668 |
| 3/26/12 | 6.029 | 4.677 |
| 3/27/12 | 6.079 | 4.678 |
| 3/28/12 | 6.083 | 4.73 |
| 3/29/12 | 6.114 | 4.755 |
| 3/30/12 | 6.094 | 4.744 |
| 4/2/12 | 6.085 | 4.737 |
| 4/3/12 | 6.014 | 4.739 |
| 4/4/12 | 6.067 | 4.668 |
| 4/5/12 | 6.071 | 4.718 |
| 4/9/12 | 6.12 | 4.778 |
| 4/10/12 | 6.194 | 4.783 |
| 4/11/12 | 6.166 | 4.828 |
| 4/12/12 | 6.152 | 4.812 |
| 4/13/12 | 6.198 | 4.79 |
| 4/16/12 | 6.177 | 4.834 |
| 4/17/12 | 6.138 | 4.77 |
| 4/18/12 | 6.162 | 4.76 |
| 4/19/12 | 6.157 | 4.759 |
| 4/20/12 | 6.137 | 4.766 |
| 4/23/12 | 6.155 | 4.742 |
| 4/24/12 | 6.125 | 4.705 |
| 4/25/12 | 6.104 | 4.712 |
| 4/26/12 | 6.128 | 4.673 |
| 4/27/12 | 6.117 | 4.688 |
| 4/30/12 | 6.142 | 4.675 |
| 5/1/12 | 6.136 | 4.69 |
| 5/2/12 | 6.156 | 4.689 |
| 5/3/12 | 6.159 | 4.724 |
| 5/4/12 | 6.207 | 4.73 |
| 5/7/12 | 6.208 | 4.77 |
| 5/8/12 | 6.246 | 4.767 |
| 5/9/12 | 6.239 | 4.797 |
| 5/10/12 | 6.253 | 4.783 |
| 5/11/12 | 6.285 | 4.778 |
| 5/14/12 | 6.305 | 4.823 |
| 5/15/12 | 6.292 | 4.849 |
| 5/16/12 | 6.296 | 4.83 |
| 5/17/12 | 6.333 | 4.821 |
| 5/18/12 | 6.321 | 4.84 |
| 5/22/12 | 6.304 | 4.796 |
| 5/23/12 | 6.348 | 4.802 |
| 5/24/12 | 6.351 | 4.835 |
| 5/25/12 | 6.392 | 4.843 |
| 5/28/12 | 6.378 | 4.89 |
| 5/29/12 | 6.361 | 4.821 |
| 5/30/12 | 6.416 | 4.82 |
| 5/31/12 | 6.458 | 4.875 |
| 6/1/12 | 6.531 | 4.901 |
| 6/4/12 | 6.521 | 4.965 |
| 6/5/12 | 6.465 | 4.914 |
| 6/6/12 | 6.4 | 4.857 |
| 6/7/12 | 6.379 | 4.794 |
| 6/8/12 | 6.386 | 4.762 |
| 6/11/12 | 6.415 | 4.838 |
| 6/12/12 | 6.376 | 4.81 |
| 6/13/12 | 6.403 | 4.81 |
| 6/14/12 | 6.373 | 4.833 |
| 6/15/12 | 6.417 | 4.812 |
| 6/18/12 | 6.411 | 4.844 |
| 6/19/12 | 6.388 | 4.824 |
| 6/20/12 | 6.389 | 4.809 |
| 6/21/12 | 6.432 | 4.852 |
| 6/22/12 | 6.392 | 4.814 |
| 6/25/12 | 6.451 | 4.869 |
| 6/26/12 | 6.425 | 4.841 |
| 6/27/12 | 6.426 | 4.842 |
| 6/28/12 | 6.46 | 4.89 |
| 6/29/12 | 6.421 | 4.833 |
| 7/3/12 | 6.422 | 4.84 |
| 7/4/12 | 6.449 | 4.884 |
| 7/5/12 | 6.441 | 4.876 |
| 7/6/12 | 6.455 | 4.895 |
| 7/9/12 | 6.476 | 4.911 |
| 7/10/12 | 6.486 | 4.927 |
| 7/11/12 | 6.471 | 4.905 |
| 7/12/12 | 6.502 | 4.958 |
| 7/13/12 | 6.497 | 4.94 |
| 7/16/12 | 6.505 | 4.965 |
| 7/17/12 | 6.488 | 4.961 |
| 7/18/12 | 6.502 | 4.976 |
| 7/19/12 | 6.475 | 4.951 |
| 7/20/12 | 6.514 | 4.988 |
| 7/23/12 | 6.542 | 5.012 |
| 7/24/12 | 6.552 | 5.01 |
| 7/25/12 | 6.529 | 4.998 |
| 7/26/12 | 6.476 | 4.943 |
| 7/27/12 | 6.42 | 4.885 |
| 7/30/12 | 6.455 | 4.913 |
| 7/31/12 | 6.481 | 4.964 |
| 8/1/12 | 6.455 | 4.944 |
| 8/2/12 | 6.501 | 4.993 |
| 8/3/12 | 6.441 | 4.937 |
| 8/7/12 | 6.38 | 4.861 |
| 8/8/12 | 6.399 | 4.894 |
| 8/9/12 | 6.412 | 4.909 |
| 8/10/12 | 6.431 | 4.929 |
| 8/13/12 | 6.415 | 4.925 |
| 8/14/12 | 6.368 | 4.893 |
| 8/15/12 | 6.281 | 4.819 |
| 8/16/12 | 6.261 | 4.799 |
| 8/17/12 | 6.273 | 4.798 |
| 8/20/12 | 6.27 | 4.791 |
| 8/21/12 | 6.27 | 4.803 |
| 8/22/12 | 6.341 | 4.86 |
| 8/23/12 | 6.348 | 4.874 |
| 8/24/12 | 6.339 | 4.872 |
| 8/27/12 | 6.364 | 4.892 |
| 8/28/12 | 6.386 | 4.927 |
| 8/29/12 | 6.381 | 4.914 |
| 8/30/12 | 6.409 | 4.935 |
| 8/31/12 | 6.414 | 4.958 |
| 9/4/12 | 6.437 | 4.969 |
| 9/5/12 | 6.424 | 4.955 |
| 9/6/12 | 6.352 | 4.876 |
| 9/7/12 | 6.32 | 4.855 |
| 9/10/12 | 6.329 | 4.873 |
| 9/11/12 | 6.306 | 4.84 |
| 9/12/12 | 6.255 | 4.797 |
| 9/13/12 | 6.277 | 4.816 |
| 9/14/12 | 6.211 | 4.736 |
| 9/17/12 | 6.233 | 4.769 |
| 9/18/12 | 6.256 | 4.809 |
| 9/19/12 | 6.294 | 4.845 |
| 9/20/12 | 6.326 | 4.869 |
| 9/21/12 | 6.332 | 4.892 |
| 9/24/12 | 6.36 | 4.922 |
| 9/25/12 | 6.369 | 4.927 |
| 9/26/12 | 6.419 | 4.987 |
| 9/27/12 | 6.402 | 4.974 |
| 9/28/12 | 6.431 | 4.981 |
| 10/1/12 | 6.433 | 4.984 |
| 10/2/12 | 6.429 | 4.987 |
| 10/3/12 | 6.43 | 4.987 |
| 10/4/12 | 6.382 | 4.939 |
| 10/5/12 | 6.346 | 4.913 |
| 10/9/12 | 6.343 | 4.918 |
| 10/10/12 | 6.353 | 4.928 |
| 10/11/12 | 6.35 | 4.922 |
| 10/12/12 | 6.357 | 4.92 |
| 10/15/12 | 6.34 | 4.908 |
| 10/16/12 | 6.308 | 4.866 |
| 10/17/12 | 6.244 | 4.808 |
| 10/18/12 | 6.262 | 4.821 |
| 10/19/12 | 6.318 | 4.873 |
| 10/22/12 | 6.301 | 4.844 |
| 10/23/12 | 6.332 | 4.865 |
| 10/24/12 | 6.323 | 4.859 |
| 10/25/12 | 6.289 | 4.823 |
| 10/26/12 | 6.334 | 4.857 |
| 10/29/12 | 6.35 | 4.877 |
| 10/30/12 | 6.352 | 4.887 |
| 10/31/12 | 6.37 | 4.895 |
| 11/1/12 | 6.37 | 4.882 |
| 11/2/12 | 6.387 | 4.915 |
| 11/5/12 | 6.399 | 4.923 |
| 11/6/12 | 6.365 | 4.877 |
| 11/7/12 | 6.407 | 4.923 |
| 11/8/12 | 6.44 | 4.956 |
| 11/9/12 | 6.441 | 4.944 |
| 11/13/12 | 6.46 | 4.966 |
| 11/14/12 | 6.45 | 4.998 |
| 11/15/12 | 6.44 | 4.983 |
| 11/16/12 | 6.457 | 4.993 |
| 11/19/12 | 6.422 | 4.939 |
| 11/20/12 | 6.403 | 4.924 |
| 11/21/12 | 6.4 | 4.916 |
| 11/22/12 | 6.394 | 4.909 |
| 11/23/12 | 6.389 | 4.912 |
| 11/26/12 | 6.407 | 4.924 |
| 11/27/12 | 6.441 | 4.967 |
| 11/28/12 | 6.448 | 4.975 |
| 11/29/12 | 6.453 | 4.988 |
| 11/30/12 | 6.456 | 4.989 |
| 12/3/12 | 6.447 | 4.987 |
| 12/4/12 | 6.449 | 4.984 |
| 12/5/12 | 6.455 | 4.994 |
| 12/6/12 | 6.448 | 4.983 |
| 12/7/12 | 6.438 | 4.978 |
| 12/10/12 | 6.443 | 4.968 |
| 12/11/12 | 6.414 | 4.944 |
| 12/12/12 | 6.383 | 4.918 |
| 12/13/12 | 6.351 | 4.876 |
| 12/14/12 | 6.369 | 4.892 |
| 12/17/12 | 6.346 | 4.87 |
| 12/18/12 | 6.334 | 4.868 |
| 12/19/12 | 6.331 | 4.868 |
| 12/20/12 | 6.341 | 4.891 |
| 12/21/12 | 6.379 | 4.92 |
| 12/24/12 | 6.373 | 4.931 |
| 12/27/12 | 6.395 | 4.958 |
| 12/28/12 | 6.412 | 4.98 |
| 12/31/12 | 6.385 | 4.943 |
| 1/2/13 | 5.874 | 4.44 |
| 1/3/13 | 5.819 | 4.385 |
| 1/4/13 | 5.816 | 4.395 |
| 1/7/13 | 5.799 | 4.39 |
| 1/8/13 | 5.825 | 4.416 |
| 1/9/13 | 5.825 | 4.428 |
| 1/10/13 | 5.783 | 4.396 |
| 1/11/13 | 5.794 | 4.399 |
| 1/14/13 | 5.795 | 4.402 |
| 1/15/13 | 5.82 | 4.426 |
| 1/16/13 | 5.839 | 4.458 |
| 1/17/13 | 5.788 | 4.392 |
| 1/18/13 | 5.805 | 4.409 |
| 1/21/13 | 5.792 | 4.402 |
| 1/22/13 | 5.801 | 4.409 |
| 1/23/13 | 5.826 | 4.434 |
| 1/24/13 | 5.813 | 4.415 |
| 1/25/13 | 5.763 | 4.361 |
| 1/28/13 | 5.761 | 4.363 |
| 1/29/13 | 5.731 | 4.327 |
| 1/30/13 | 5.728 | 4.334 |
| 1/31/13 | 5.73 | 4.336 |
| 2/1/13 | 5.669 | 4.28 |
| 2/4/13 | 5.703 | 4.313 |
| 2/5/13 | 5.68 | 4.296 |
| 2/6/13 | 5.701 | 4.31 |
| 2/7/13 | 5.7 | 4.306 |
| 2/8/13 | 5.726 | 4.329 |
| 2/11/13 | 5.714 | 4.308 |
| 2/12/13 | 5.688 | 4.291 |
| 2/13/13 | 5.655 | 4.261 |
| 2/14/13 | 5.687 | 4.294 |
| 2/15/13 | 5.671 | 4.267 |
| 2/19/13 | 5.658 | 4.26 |
| 2/20/13 | 5.664 | 4.261 |
| 2/21/13 | 5.693 | 4.291 |
| 2/22/13 | 5.715 | 4.318 |
| 2/25/13 | 5.773 | 4.376 |
| 2/26/13 | 5.773 | 4.367 |
| 2/27/13 | 5.77 | 4.375 |
| 2/28/13 | 5.776 | 4.372 |
| 3/1/13 | 5.805 | 4.397 |
| 3/4/13 | 5.794 | 4.384 |
| 3/5/13 | 5.79 | 4.38 |
| 3/6/13 | 5.752 | 4.349 |
| 3/7/13 | 5.72 | 4.307 |
| 3/8/13 | 5.678 | 4.272 |
| 3/11/13 | 5.669 | 4.27 |
| 3/12/13 | 5.691 | 4.295 |
| 3/13/13 | 5.695 | 4.307 |
| 3/14/13 | 5.675 | 4.274 |
| 3/15/13 | 5.705 | 4.32 |
| 3/18/13 | 5.74 | 4.35 |
| 3/19/13 | 5.781 | 4.394 |
| 3/20/13 | 5.742 | 4.348 |
| 3/21/13 | 5.778 | 4.383 |
| 3/22/13 | 5.771 | 4.362 |
| 3/25/13 | 5.769 | 4.38 |
| 3/26/13 | 5.763 | 4.373 |
| 3/27/13 | 5.81 | 4.406 |
| 3/28/13 | 5.8 | 4.39 |
| 4/1/13 | 5.805 | 4.404 |
| 4/2/13 | 5.797 | 4.401 |
| 4/3/13 | 5.846 | 4.445 |
| 4/4/13 | 5.873 | 4.47 |
| 4/5/13 | 5.938 | 4.545 |
| 4/8/13 | 5.929 | 4.524 |
| 4/9/13 | 5.905 | 4.483 |
| 4/10/13 | 5.858 | 4.446 |
| 4/11/13 | 5.869 | 4.449 |
| 4/12/13 | 5.911 | 4.509 |
| 4/15/13 | 5.941 | 4.512 |
| 4/16/13 | 5.918 | 4.496 |
| 4/17/13 | 5.94 | 4.526 |
| 4/18/13 | 5.948 | 4.53 |
| 4/19/13 | 5.942 | 4.523 |
| 4/22/13 | 5.934 | 4.518 |
| 4/23/13 | 5.922 | 4.501 |
| 4/24/13 | 5.921 | 4.507 |
| 4/25/13 | 5.895 | 4.482 |
| 4/26/13 | 5.925 | 4.505 |
| 4/29/13 | 5.933 | 4.496 |
| 4/30/13 | 5.929 | 4.495 |
| 5/1/13 | 5.948 | 4.523 |
| 5/2/13 | 5.949 | 4.519 |
| 5/3/13 | 5.862 | 4.427 |
| 5/6/13 | 5.832 | 4.398 |
| 5/7/13 | 5.82 | 4.39 |
| 5/8/13 | 5.835 | 4.418 |
| 5/9/13 | 5.852 | 4.45 |
| 5/10/13 | 5.787 | 4.381 |
| 5/13/13 | 5.768 | 4.372 |
| 5/14/13 | 5.737 | 4.348 |
| 5/15/13 | 5.767 | 4.393 |
| 5/16/13 | 5.806 | 4.432 |
| 5/17/13 | 5.773 | 4.402 |
| 5/21/13 | 5.773 | 4.415 |
| 5/22/13 | 5.73 | 4.38 |
| 5/23/13 | 5.727 | 4.377 |
| 5/24/13 | 5.733 | 4.385 |
| 5/27/13 | 5.712 | 4.363 |
| 5/28/13 | 5.635 | 4.283 |
| 5/29/13 | 5.655 | 4.313 |
| 5/30/13 | 5.66 | 4.326 |
| 5/31/13 | 5.669 | 4.333 |
| 6/3/13 | 5.695 | 4.355 |
| 6/4/13 | 5.662 | 4.326 |
| 6/5/13 | 5.68 | 4.344 |
| 6/6/13 | 5.684 | 4.344 |
| 6/7/13 | 5.582 | 4.231 |
| 6/10/13 | 5.547 | 4.203 |
| 6/11/13 | 5.577 | 4.233 |
| 6/12/13 | 5.551 | 4.213 |
| 6/13/13 | 5.608 | 4.261 |
| 6/14/13 | 5.622 | 4.262 |
| 6/17/13 | 5.599 | 4.236 |
| 6/18/13 | 5.596 | 4.243 |
| 6/19/13 | 5.551 | 4.192 |
| 6/20/13 | 5.491 | 4.125 |
| 6/21/13 | 5.395 | 4.003 |
| 6/24/13 | 5.369 | 3.987 |
| 6/25/13 | 5.318 | 3.929 |
| 6/26/13 | 5.343 | 3.964 |
| 6/27/13 | 5.407 | 4.012 |
| 6/28/13 | 5.404 | 4.002 |
| 7/2/13 | 5.447 | 4.042 |
| 7/3/13 | 5.441 | 4.041 |
| 7/4/13 | 5.437 | 4.037 |
| 7/5/13 | 5.327 | 3.933 |
| 7/8/13 | 5.377 | 3.994 |
| 7/9/13 | 5.37 | 3.981 |
| 7/10/13 | 5.354 | 3.975 |
| 7/11/13 | 5.374 | 3.977 |
| 7/12/13 | 5.371 | 3.989 |
| 7/15/13 | 5.379 | 3.997 |
| 7/16/13 | 5.376 | 3.991 |
| 7/17/13 | 5.394 | 4.02 |
| 7/18/13 | 5.381 | 3.995 |
| 7/19/13 | 5.414 | 4.016 |
| 7/22/13 | 5.423 | 4.029 |
| 7/23/13 | 5.374 | 3.986 |
| 7/24/13 | 5.318 | 3.944 |
| 7/25/13 | 5.333 | 3.953 |
| 7/26/13 | 5.346 | 3.96 |
| 7/29/13 | 5.3 | 3.932 |
| 7/30/13 | 5.272 | 3.914 |
| 7/31/13 | 5.329 | 3.972 |
| 8/1/13 | 5.257 | 3.886 |
| 8/2/13 | 5.299 | 3.919 |
| 8/6/13 | 5.272 | 3.899 |
| 8/7/13 | 5.287 | 3.921 |
| 8/8/13 | 5.297 | 3.934 |
| 8/9/13 | 5.315 | 3.949 |
| 8/12/13 | 5.271 | 3.907 |
| 8/13/13 | 5.203 | 3.841 |
| 8/14/13 | 5.196 | 3.836 |
| 8/15/13 | 5.16 | 3.784 |
| 8/16/13 | 5.125 | 3.732 |
| 8/19/13 | 5.091 | 3.697 |
| 8/20/13 | 5.139 | 3.756 |
| 8/21/13 | 5.084 | 3.707 |
| 8/22/13 | 5.092 | 3.673 |
| 8/23/13 | 5.138 | 3.717 |
| 8/26/13 | 5.178 | 3.759 |
| 8/27/13 | 5.26 | 3.839 |
| 8/28/13 | 5.217 | 3.79 |
| 8/29/13 | 5.233 | 3.783 |
| 8/30/13 | 5.229 | 3.787 |
| 9/3/13 | 5.15 | 3.694 |
| 9/4/13 | 5.118 | 3.672 |
| 9/5/13 | 5.042 | 3.585 |
| 9/6/13 | 5.059 | 3.604 |
| 9/9/13 | 5.079 | 3.613 |
| 9/10/13 | 5.017 | 3.551 |
| 9/11/13 | 5.037 | 3.571 |
| 9/12/13 | 5.038 | 3.574 |
| 9/13/13 | 5.053 | 3.572 |
| 9/16/13 | 5.026 | 3.54 |
| 9/17/13 | 5.047 | 3.533 |
| 9/18/13 | 5.108 | 3.607 |
| 9/19/13 | 5.071 | 3.563 |
| 9/20/13 | 5.094 | 3.606 |
| 9/23/13 | 5.135 | 3.634 |
| 9/24/13 | 5.176 | 3.67 |
| 9/25/13 | 5.2 | 3.703 |
| 9/26/13 | 5.191 | 3.692 |
| 9/27/13 | 5.218 | 3.737 |
| 9/30/13 | 5.228 | 3.74 |
| 10/1/13 | 5.206 | 3.725 |
| 10/2/13 | 5.211 | 3.74 |
| 10/3/13 | 5.203 | 3.717 |
| 10/4/13 | 5.18 | 3.702 |
| 10/7/13 | 5.19 | 3.711 |
| 10/8/13 | 5.19 | 3.719 |
| 10/9/13 | 5.173 | 3.695 |
| 10/10/13 | 5.148 | 3.673 |
| 10/11/13 | 5.152 | 3.671 |
| 10/15/13 | 5.119 | 3.65 |
| 10/16/13 | 5.144 | 3.676 |
| 10/17/13 | 5.182 | 3.717 |
| 10/18/13 | 5.199 | 3.725 |
| 10/21/13 | 5.182 | 3.714 |
| 10/22/13 | 5.232 | 3.768 |
| 10/23/13 | 5.268 | 3.81 |
| 10/24/13 | 5.272 | 3.814 |
| 10/25/13 | 5.275 | 3.805 |
| 10/28/13 | 5.273 | 3.819 |
| 10/29/13 | 5.293 | 3.847 |
| 10/30/13 | 5.282 | 3.83 |
| 10/31/13 | 5.286 | 3.832 |
| 11/1/13 | 5.229 | 3.78 |
| 11/4/13 | 5.231 | 3.778 |
| 11/5/13 | 5.197 | 3.758 |
| 11/6/13 | 5.191 | 3.766 |
| 11/7/13 | 5.215 | 3.783 |
| 11/8/13 | 5.137 | 3.702 |
| 11/12/13 | 5.104 | 3.684 |
| 11/13/13 | 5.159 | 3.736 |
| 11/14/13 | 5.191 | 3.755 |
| 11/15/13 | 5.18 | 3.762 |
| 11/18/13 | 5.221 | 3.814 |
| 11/19/13 | 5.197 | 3.782 |
| 11/20/13 | 5.097 | 3.681 |
| 11/21/13 | 5.104 | 3.713 |
| 11/22/13 | 5.153 | 3.748 |
| 11/25/13 | 5.176 | 3.765 |
| 11/26/13 | 5.189 | 3.783 |
| 11/27/13 | 5.155 | 3.76 |
| 11/28/13 | 5.16 | 3.764 |
| 11/29/13 | 5.15 | 3.739 |
| 12/2/13 | 5.114 | 3.705 |
| 12/3/13 | 5.12 | 3.708 |
| 12/4/13 | 5.039 | 3.629 |
| 12/5/13 | 5.019 | 3.608 |
| 12/6/13 | 5.02 | 3.615 |
| 12/9/13 | 5.046 | 3.652 |
| 12/10/13 | 5.117 | 3.718 |
| 12/11/13 | 5.09 | 3.7 |
| 12/12/13 | 5.083 | 3.678 |
| 12/13/13 | 5.088 | 3.682 |
| 12/16/13 | 5.084 | 3.683 |
| 12/17/13 | 5.111 | 3.721 |
| 12/18/13 | 5.082 | 3.691 |
| 12/19/13 | 5.082 | 3.695 |
| 12/20/13 | 5.12 | 3.732 |
| 12/23/13 | 5.126 | 3.755 |
| 12/24/13 | 5.093 | 3.714 |
| 12/27/13 | 5.049 | 3.672 |
| 12/30/13 | 5.087 | 3.708 |
| 12/31/13 | 5.071 | 3.702 |
| 1/2/14 | 5.086 | 3.694 |
| 1/3/14 | 5.086 | 3.713 |
| 1/6/14 | 5.109 | 3.728 |
| 1/7/14 | 5.132 | 3.762 |
| 1/8/14 | 5.087 | 3.731 |
| 1/9/14 | 5.109 | 3.74 |
| 1/10/14 | 5.189 | 3.819 |
| 1/13/14 | 5.206 | 3.863 |
| 1/14/14 | 5.17 | 3.818 |
| 1/15/14 | 5.176 | 3.839 |
| 1/16/14 | 5.217 | 3.873 |
| 1/17/14 | 5.234 | 3.902 |
| 1/20/14 | 5.244 | 3.903 |
| 1/21/14 | 5.242 | 3.905 |
| 1/22/14 | 5.246 | 3.92 |
| 1/23/14 | 5.315 | 3.994 |
| 1/24/14 | 5.33 | 3.994 |
| 1/27/14 | 5.307 | 3.967 |
| 1/28/14 | 5.311 | 3.967 |
| 1/29/14 | 5.355 | 4.026 |
| 1/30/14 | 5.35 | 4.008 |
| 1/31/14 | 5.375 | 4.031 |
| 2/3/14 | 5.413 | 4.067 |
| 2/4/14 | 5.365 | 4.007 |
| 2/5/14 | 5.311 | 3.958 |
| 2/6/14 | 5.274 | 3.921 |
| 2/7/14 | 5.289 | 3.925 |
| 2/10/14 | 5.293 | 3.939 |
| 2/11/14 | 5.244 | 3.88 |
| 2/12/14 | 5.23 | 3.877 |
| 2/13/14 | 5.249 | 3.895 |
| 2/14/14 | 5.251 | 3.897 |
| 2/18/14 | 5.258 | 3.905 |
| 2/19/14 | 5.251 | 3.898 |
| 2/20/14 | 5.254 | 3.9 |
| 2/21/14 | 5.282 | 3.924 |
| 2/24/14 | 5.28 | 3.924 |
| 2/25/14 | 5.305 | 3.95 |
| 2/26/14 | 5.336 | 3.992 |
| 2/27/14 | 5.361 | 4.007 |
| 2/28/14 | 5.359 | 4.01 |
| 3/3/14 | 5.371 | 4.024 |
| 3/4/14 | 5.311 | 3.964 |
| 3/5/14 | 5.31 | 3.966 |
| 3/6/14 | 5.275 | 3.945 |
| 3/7/14 | 5.257 | 3.926 |
| 3/10/14 | 5.271 | 3.944 |
| 3/11/14 | 5.281 | 3.952 |
| 3/12/14 | 5.31 | 3.987 |
| 3/13/14 | 5.369 | 4.069 |
| 3/14/14 | 5.373 | 4.069 |
| 3/17/14 | 5.351 | 4.044 |
| 3/18/14 | 5.36 | 4.036 |
| 3/19/14 | 5.324 | 4.006 |
| 3/20/14 | 5.308 | 3.994 |
| 3/21/14 | 5.345 | 4.035 |
| 3/24/14 | 5.36 | 4.05 |
| 3/25/14 | 5.321 | 4.003 |
| 3/26/14 | 5.338 | 4.036 |
| 3/27/14 | 5.366 | 4.064 |
| 3/28/14 | 5.355 | 4.056 |
| 3/31/14 | 5.336 | 4.038 |
| 4/1/14 | 5.291 | 4.015 |
| 4/2/14 | 5.26 | 4.006 |
| 4/3/14 | 5.266 | 4.012 |
| 4/4/14 | 5.302 | 4.049 |
| 4/7/14 | 5.327 | 4.073 |
| 4/8/14 | 5.334 | 4.081 |
| 4/9/14 | 5.312 | 4.06 |
| 4/10/14 | 5.329 | 4.078 |
| 4/11/14 | 5.36 | 4.108 |
| 4/14/14 | 5.361 | 4.109 |
| 4/15/14 | 5.38 | 4.099 |
| 4/16/14 | 5.393 | 4.111 |
| 4/17/14 | 5.352 | 4.07 |
| 4/21/14 | 5.355 | 4.092 |
| 4/22/14 | 5.362 | 4.11 |
| 4/23/14 | 5.366 | 4.115 |
| 4/24/14 | 5.368 | 4.117 |
| 4/25/14 | 5.375 | 4.124 |
| 4/28/14 | 5.328 | 4.056 |
| 4/29/14 | 5.337 | 4.065 |
| 4/30/14 | 5.373 | 4.037 |
| 5/1/14 | 5.398 | 4.068 |
| 5/2/14 | 5.421 | 4.088 |
| 5/5/14 | 5.401 | 4.066 |
| 5/6/14 | 5.407 | 4.078 |
| 5/7/14 | 5.399 | 4.067 |
| 5/8/14 | 5.403 | 4.073 |
| 5/9/14 | 5.404 | 4.077 |
| 5/12/14 | 5.376 | 4.048 |
| 5/13/14 | 5.409 | 4.082 |
| 5/14/14 | 5.467 | 4.142 |
| 5/15/14 | 5.506 | 4.174 |
| 5/16/14 | 5.501 | 4.173 |
| 5/20/14 | 5.48 | 4.153 |
| 5/21/14 | 5.454 | 4.121 |
| 5/22/14 | 5.431 | 4.103 |
| 5/23/14 | 5.461 | 4.126 |
| 5/26/14 | 5.451 | 4.114 |
| 5/27/14 | 5.463 | 4.129 |
| 5/28/14 | 5.535 | 4.198 |
| 5/29/14 | 5.507 | 4.17 |
| 5/30/14 | 5.52 | 4.181 |
| 6/2/14 | 5.496 | 4.149 |
| 6/3/14 | 5.449 | 4.112 |
| 6/4/14 | 5.438 | 4.094 |
| 6/5/14 | 5.446 | 4.103 |
| 6/6/14 | 5.46 | 4.116 |
| 6/9/14 | 5.459 | 4.113 |
| 6/10/14 | 5.436 | 4.098 |
| 6/11/14 | 5.433 | 4.102 |
| 6/12/14 | 5.463 | 4.129 |
| 6/13/14 | 5.468 | 4.121 |
| 6/16/14 | 5.488 | 4.14 |
| 6/17/14 | 5.463 | 4.114 |
| 6/18/14 | 5.499 | 4.143 |
| 6/19/14 | 5.475 | 4.125 |
| 6/20/14 | 5.465 | 4.104 |
| 6/23/14 | 5.435 | 4.092 |
| 6/24/14 | 5.474 | 4.131 |
| 6/25/14 | 5.478 | 4.138 |
| 6/26/14 | 5.501 | 4.163 |
| 6/27/14 | 5.499 | 4.158 |
| 6/30/14 | 5.52 | 4.178 |
| 7/2/14 | 5.456 | 4.114 |
| 7/3/14 | 5.458 | 4.116 |
| 7/4/14 | 5.454 | 4.118 |
| 7/7/14 | 5.473 | 4.13 |
| 7/8/14 | 5.515 | 4.177 |
| 7/9/14 | 5.512 | 4.179 |
| 7/10/14 | 5.512 | 4.173 |
| 7/11/14 | 5.531 | 4.19 |
| 7/14/14 | 5.53 | 4.197 |
| 7/15/14 | 5.533 | 4.191 |
| 7/16/14 | 5.551 | 4.211 |
| 7/17/14 | 5.609 | 4.269 |
| 7/18/14 | 5.589 | 4.244 |
| 7/21/14 | 5.629 | 4.287 |
| 7/22/14 | 5.635 | 4.292 |
| 7/23/14 | 5.624 | 4.279 |
| 7/24/14 | 5.595 | 4.236 |
| 7/25/14 | 5.631 | 4.28 |
| 7/28/14 | 5.629 | 4.278 |
| 7/29/14 | 5.657 | 4.308 |
| 7/30/14 | 5.594 | 4.243 |
| 7/31/14 | 5.606 | 4.242 |
| 8/1/14 | 5.644 | 4.283 |
| 8/5/14 | 5.647 | 4.276 |
| 8/6/14 | 5.653 | 4.282 |
| 8/7/14 | 5.679 | 4.308 |
| 8/8/14 | 5.673 | 4.306 |
| 8/11/14 | 5.662 | 4.289 |
| 8/12/14 | 5.63 | 4.251 |
| 8/13/14 | 5.658 | 4.269 |
| 8/14/14 | 5.677 | 4.284 |
| 8/15/14 | 5.718 | 4.323 |
| 8/18/14 | 5.679 | 4.28 |
| 8/19/14 | 5.672 | 4.278 |
| 8/20/14 | 5.647 | 4.245 |
| 8/21/14 | 5.662 | 4.257 |
| 8/22/14 | 5.672 | 4.272 |
| 8/25/14 | 5.703 | 4.302 |
| 8/26/14 | 5.697 | 4.3 |
| 8/27/14 | 5.731 | 4.334 |
| 8/28/14 | 5.741 | 4.343 |
| 8/29/14 | 5.744 | 4.347 |
| 9/2/14 | 5.659 | 4.263 |
| 9/3/14 | 5.67 | 4.272 |
| 9/4/14 | 5.633 | 4.241 |
| 9/5/14 | 5.631 | 4.24 |
| 9/8/14 | 5.62 | 4.23 |
| 9/9/14 | 5.598 | 4.211 |
| 9/10/14 | 5.573 | 4.187 |
| 9/11/14 | 5.583 | 4.19 |
| 9/12/14 | 5.54 | 4.154 |
| 9/15/14 | 5.541 | 4.154 |
| 9/16/14 | 5.533 | 4.143 |
| 9/17/14 | 5.514 | 4.123 |
| 9/18/14 | 5.509 | 4.121 |
| 9/19/14 | 5.545 | 4.164 |
| 9/22/14 | 5.545 | 4.187 |
| 9/23/14 | 5.581 | 4.213 |
| 9/24/14 | 5.564 | 4.197 |
| 9/25/14 | 5.622 | 4.246 |
| 9/26/14 | 5.618 | 4.236 |
| 9/29/14 | 5.653 | 4.263 |
| 9/30/14 | 5.629 | 4.241 |
| 10/1/14 | 5.704 | 4.309 |
| 10/2/14 | 5.676 | 4.287 |
| 10/3/14 | 5.692 | 4.298 |
| 10/6/14 | 5.703 | 4.319 |
| 10/7/14 | 5.749 | 4.362 |
| 10/8/14 | 5.745 | 4.369 |
| 10/9/14 | 5.737 | 4.343 |
| 10/10/14 | 5.753 | 4.358 |
| 10/14/14 | 5.809 | 4.406 |
| 10/15/14 | 5.833 | 4.409 |
| 10/16/14 | 5.806 | 4.36 |
| 10/17/14 | 5.78 | 4.326 |
| 10/20/14 | 5.777 | 4.325 |
| 10/21/14 | 5.759 | 4.309 |
| 10/22/14 | 5.769 | 4.315 |
| 10/23/14 | 5.739 | 4.287 |
| 10/24/14 | 5.737 | 4.291 |
| 10/27/14 | 5.739 | 4.297 |
| 10/28/14 | 5.719 | 4.271 |
| 10/29/14 | 5.712 | 4.261 |
| 10/30/14 | 5.713 | 4.266 |
| 10/31/14 | 5.71 | 4.268 |
| 11/3/14 | 5.711 | 4.269 |
| 11/4/14 | 5.727 | 4.276 |
| 11/5/14 | 5.701 | 4.264 |
| 11/6/14 | 5.661 | 4.215 |
| 11/7/14 | 5.706 | 4.257 |
| 11/10/14 | 5.685 | 4.236 |
| 11/12/14 | 5.673 | 4.237 |
| 11/13/14 | 5.692 | 4.247 |
| 11/14/14 | 5.707 | 4.258 |
| 11/17/14 | 5.716 | 4.27 |
| 11/18/14 | 5.742 | 4.295 |
| 11/19/14 | 5.695 | 4.254 |
| 11/20/14 | 5.727 | 4.276 |
| 11/21/14 | 5.747 | 4.299 |
| 11/24/14 | 5.772 | 4.331 |
| 11/25/14 | 5.811 | 4.368 |
| 11/26/14 | 5.816 | 4.375 |
| 11/27/14 | 5.843 | 4.401 |
| 11/28/14 | 5.876 | 4.447 |
| 12/1/14 | 5.847 | 4.414 |
| 12/2/14 | 5.788 | 4.351 |
| 12/3/14 | 5.813 | 4.369 |
| 12/4/14 | 5.845 | 4.394 |
| 12/5/14 | 5.819 | 4.366 |
| 12/8/14 | 5.876 | 4.427 |
| 12/9/14 | 5.89 | 4.434 |
| 12/10/14 | 5.92 | 4.467 |
| 12/11/14 | 5.936 | 4.46 |
| 12/12/14 | 5.997 | 4.521 |
| 12/15/14 | 5.978 | 4.49 |
| 12/16/14 | 6.007 | 4.528 |
| 12/17/14 | 5.966 | 4.477 |
| 12/18/14 | 5.909 | 4.429 |
| 12/19/14 | 5.965 | 4.482 |
| 12/22/14 | 5.971 | 4.483 |
| 12/23/14 | 5.874 | 4.398 |
| 12/24/14 | 5.861 | 4.382 |
| 12/29/14 | 5.918 | 4.438 |
| 12/30/14 | 5.941 | 4.462 |
| 12/31/14 | 5.965 | 4.493 |
| 1/2/15 | 6.004 | 4.533 |
| 1/5/15 | 6.054 | 4.579 |
| 1/6/15 | 6.099 | 4.619 |
| 1/7/15 | 6.084 | 4.611 |
| 1/8/15 | 6.026 | 4.552 |
| 1/9/15 | 6.079 | 4.595 |
| 1/12/15 | 6.128 | 4.645 |
| 1/13/15 | 6.135 | 4.657 |
| 1/14/15 | 6.16 | 4.689 |
| 1/15/15 | 6.253 | 4.761 |
| 1/16/15 | 6.192 | 4.713 |
| 1/19/15 | 6.216 | 4.732 |
| 1/20/15 | 6.246 | 4.758 |
| 1/21/15 | 6.249 | 4.772 |
| 1/22/15 | 6.228 | 4.741 |
| 1/23/15 | 6.278 | 4.785 |
| 1/26/15 | 6.272 | 4.773 |
| 1/27/15 | 6.306 | 4.823 |
| 1/28/15 | 6.372 | 4.872 |
| 1/29/15 | 6.361 | 4.864 |
| 1/30/15 | 6.466 | 4.963 |
| 2/2/15 | 6.467 | 4.968 |
| 2/3/15 | 6.397 | 4.91 |
| 2/4/15 | 6.433 | 4.954 |
| 2/5/15 | 6.342 | 4.869 |
| 2/6/15 | 6.268 | 4.802 |
| 2/9/15 | 6.269 | 4.807 |
| 2/10/15 | 6.261 | 4.778 |
| 2/11/15 | 6.236 | 4.785 |
| 2/12/15 | 6.26 | 4.81 |
| 2/13/15 | 6.23 | 4.777 |
| 2/17/15 | 6.171 | 4.737 |
| 2/18/15 | 6.187 | 4.736 |
| 2/19/15 | 6.194 | 4.767 |
| 2/20/15 | 6.239 | 4.776 |
| 2/23/15 | 6.288 | 4.837 |
| 2/24/15 | 6.335 | 4.891 |
| 2/25/15 | 6.349 | 4.909 |
| 2/26/15 | 6.338 | 4.896 |
| 2/27/15 | 6.381 | 4.946 |
| 3/2/15 | 6.32 | 4.877 |
| 3/3/15 | 6.263 | 4.84 |
| 3/4/15 | 6.198 | 4.778 |
| 3/5/15 | 6.171 | 4.757 |
| 3/6/15 | 6.07 | 4.664 |
| 3/9/15 | 6.096 | 4.675 |
| 3/10/15 | 6.131 | 4.717 |
| 3/11/15 | 6.165 | 4.758 |
| 3/12/15 | 6.169 | 4.763 |
| 3/13/15 | 6.189 | 4.778 |
| 3/16/15 | 6.23 | 4.81 |
| 3/17/15 | 6.255 | 4.849 |
| 3/18/15 | 6.329 | 4.926 |
| 3/19/15 | 6.349 | 4.947 |
| 3/20/15 | 6.361 | 4.955 |
| 3/23/15 | 6.351 | 4.947 |
| 3/24/15 | 6.36 | 4.967 |
| 3/25/15 | 6.316 | 4.925 |
| 3/26/15 | 6.261 | 4.851 |
| 3/27/15 | 6.303 | 4.902 |
| 3/30/15 | 6.309 | 4.904 |
| 3/31/15 | 6.316 | 4.906 |
| 4/1/15 | 6.353 | 4.949 |
| 4/2/15 | 6.341 | 4.928 |
| 4/6/15 | 6.305 | 4.891 |
| 4/7/15 | 6.312 | 4.909 |
| 4/8/15 | 6.309 | 4.916 |
| 4/9/15 | 6.266 | 4.866 |
| 4/10/15 | 6.26 | 4.858 |
| 4/13/15 | 6.278 | 4.867 |
| 4/14/15 | 6.315 | 4.915 |
| 4/15/15 | 6.315 | 4.907 |
| 4/16/15 | 6.275 | 4.869 |
| 4/17/15 | 6.279 | 4.864 |
| 4/20/15 | 6.265 | 4.851 |
| 4/21/15 | 6.264 | 4.84 |
| 4/22/15 | 6.209 | 4.796 |
| 4/23/15 | 6.222 | 4.804 |
| 4/24/15 | 6.249 | 4.844 |
| 4/27/15 | 6.226 | 4.822 |
| 4/28/15 | 6.139 | 4.728 |
| 4/29/15 | 6.111 | 4.695 |
| 4/30/15 | 6.122 | 4.701 |
| 5/1/15 | 6.059 | 4.641 |
| 5/4/15 | 6.006 | 4.592 |
| 5/5/15 | 5.976 | 4.569 |
| 5/6/15 | 5.896 | 4.482 |
| 5/7/15 | 5.969 | 4.546 |
| 5/8/15 | 6.002 | 4.58 |
| 5/11/15 | 5.892 | 4.465 |
| 5/12/15 | 5.906 | 4.477 |
| 5/13/15 | 5.863 | 4.439 |
| 5/14/15 | 5.884 | 4.441 |
| 5/15/15 | 5.964 | 4.516 |
| 5/19/15 | 5.867 | 4.418 |
| 5/20/15 | 5.897 | 4.444 |
| 5/21/15 | 5.954 | 4.5 |
| 5/22/15 | 5.945 | 4.487 |
| 5/25/15 | 5.943 | 4.47 |
| 5/26/15 | 6.013 | 4.55 |
| 5/27/15 | 6.053 | 4.575 |
| 5/28/15 | 6.043 | 4.59 |
| 5/29/15 | 6.087 | 4.626 |
| 6/1/15 | 6.069 | 4.597 |
| 6/2/15 | 6.003 | 4.525 |
| 6/3/15 | 5.931 | 4.449 |
| 6/4/15 | 5.967 | 4.495 |
| 6/5/15 | 5.909 | 4.434 |
| 6/8/15 | 5.911 | 4.433 |
| 6/9/15 | 5.856 | 4.38 |
| 6/10/15 | 5.818 | 4.342 |
| 6/11/15 | 5.896 | 4.407 |
| 6/12/15 | 5.904 | 4.418 |
| 6/15/15 | 5.939 | 4.441 |
| 6/16/15 | 5.963 | 4.457 |
| 6/17/15 | 5.942 | 4.427 |
| 6/18/15 | 5.906 | 4.4 |
| 6/19/15 | 5.968 | 4.447 |
| 6/22/15 | 5.899 | 4.373 |
| 6/23/15 | 5.875 | 4.351 |
| 6/24/15 | 5.916 | 4.367 |
| 6/25/15 | 5.889 | 4.315 |
| 6/26/15 | 5.838 | 4.266 |
| 6/29/15 | 5.944 | 4.347 |
| 6/30/15 | 5.997 | 4.378 |
| 7/2/15 | 5.925 | 4.316 |
| 7/3/15 | 5.955 | 4.342 |
| 7/6/15 | 6.023 | 4.402 |
| 7/7/15 | 6.077 | 4.461 |
| 7/8/15 | 6.134 | 4.505 |
| 7/9/15 | 6.055 | 4.435 |
| 7/10/15 | 5.961 | 4.347 |
| 7/13/15 | 5.946 | 4.342 |
| 7/14/15 | 5.98 | 4.356 |
| 7/15/15 | 6.019 | 4.403 |
| 7/16/15 | 6.029 | 4.41 |
| 7/17/15 | 6.056 | 4.426 |
| 7/20/15 | 6.04 | 4.407 |
| 7/21/15 | 6.051 | 4.381 |
| 7/22/15 | 6.078 | 4.402 |
| 7/23/15 | 6.131 | 4.448 |
| 7/24/15 | 6.148 | 4.462 |
| 7/27/15 | 6.172 | 4.485 |
| 7/28/15 | 6.128 | 4.43 |
| 7/29/15 | 6.097 | 4.402 |
| 7/30/15 | 6.141 | 4.428 |
| 7/31/15 | 6.174 | 4.458 |
| 8/4/15 | 6.192 | 4.486 |
| 8/5/15 | 6.146 | 4.452 |
| 8/6/15 | 6.171 | 4.465 |
| 8/7/15 | 6.21 | 4.496 |
| 8/10/15 | 6.158 | 4.448 |
| 8/11/15 | 6.213 | 4.499 |
| 8/12/15 | 6.204 | 4.484 |
| 8/13/15 | 6.203 | 4.474 |
| 8/14/15 | 6.212 | 4.484 |
| 8/17/15 | 6.222 | 4.425 |
| 8/18/15 | 6.203 | 4.405 |
| 8/19/15 | 6.249 | 4.457 |
| 8/20/15 | 6.287 | 4.485 |
| 8/21/15 | 6.291 | 4.451 |
| 8/24/15 | 6.292 | 4.441 |
| 8/25/15 | 6.216 | 4.371 |
| 8/26/15 | 6.104 | 4.237 |
| 8/27/15 | 6.089 | 4.216 |
| 8/28/15 | 6.11 | 4.24 |
| 8/31/15 | 6.065 | 4.197 |
| 9/1/15 | 6.121 | 4.241 |
| 9/2/15 | 6.093 | 4.216 |
| 9/3/15 | 6.08 | 4.212 |
| 9/4/15 | 6.103 | 4.232 |
| 9/8/15 | 6.067 | 4.206 |
| 9/9/15 | 6.041 | 4.207 |
| 9/10/15 | 6.037 | 4.214 |
| 9/11/15 | 6.063 | 4.245 |
| 9/14/15 | 6.066 | 4.266 |
| 9/15/15 | 5.979 | 4.18 |
| 9/16/15 | 5.961 | 4.165 |
| 9/17/15 | 6.01 | 4.219 |
| 9/18/15 | 6.074 | 4.281 |
| 9/21/15 | 6.007 | 4.212 |
| 9/22/15 | 6.069 | 4.268 |
| 9/23/15 | 6.058 | 4.259 |
| 9/24/15 | 6.08 | 4.266 |
| 9/25/15 | 6.03 | 4.193 |
| 9/28/15 | 6.103 | 4.272 |
| 9/29/15 | 6.111 | 4.268 |
| 9/30/15 | 6.101 | 4.237 |
| 10/1/15 | 6.1 | 4.24 |
| 10/2/15 | 6.114 | 4.248 |
| 10/5/15 | 6.068 | 4.193 |
| 10/6/15 | 6.081 | 4.2 |
| 10/7/15 | 6.048 | 4.169 |
| 10/8/15 | 6 | 4.115 |
| 10/9/15 | 5.986 | 4.098 |
| 10/13/15 | 6.05 | 4.157 |
| 10/14/15 | 6.085 | 4.195 |
| 10/15/15 | 6.056 | 4.163 |
| 10/16/15 | 6.036 | 4.149 |
| 10/19/15 | 6.04 | 4.138 |
| 10/20/15 | 5.968 | 4.074 |
| 10/21/15 | 6.033 | 4.14 |
| 10/22/15 | 6.038 | 4.146 |
| 10/23/15 | 5.997 | 4.114 |
| 10/26/15 | 6.054 | 4.177 |
| 10/27/15 | 6.067 | 4.19 |
| 10/28/15 | 6.028 | 4.162 |
| 10/29/15 | 5.978 | 4.111 |
| 10/30/15 | 5.996 | 4.141 |
| 11/2/15 | 5.974 | 4.119 |
| 11/3/15 | 5.946 | 4.09 |
| 11/4/15 | 5.935 | 4.088 |
| 11/5/15 | 5.925 | 4.082 |
| 11/6/15 | 5.884 | 4.049 |
| 11/9/15 | 5.882 | 4.047 |
| 11/10/15 | 5.899 | 4.067 |
| 11/12/15 | 5.911 | 4.087 |
| 11/13/15 | 5.955 | 4.129 |
| 11/16/15 | 5.955 | 4.132 |
| 11/17/15 | 5.951 | 4.129 |
| 11/18/15 | 5.946 | 4.13 |
| 11/19/15 | 5.975 | 4.163 |
| 11/20/15 | 5.972 | 4.164 |
| 11/23/15 | 5.975 | 4.16 |
| 11/24/15 | 5.978 | 4.168 |
| 11/25/15 | 6.004 | 4.2 |
| 11/26/15 | 6.019 | 4.213 |
| 11/27/15 | 6.008 | 4.212 |
| 11/30/15 | 6.014 | 4.215 |
| 12/1/15 | 6.074 | 4.272 |
| 12/2/15 | 6.072 | 4.278 |
| 12/3/15 | 5.975 | 4.17 |
| 12/4/15 | 6.002 | 4.199 |
| 12/7/15 | 6.062 | 4.262 |
| 12/8/15 | 6.062 | 4.241 |
| 12/9/15 | 6.062 | 4.235 |
| 12/10/15 | 6.063 | 4.242 |
| 12/11/15 | 6.138 | 4.296 |
| 12/14/15 | 6.088 | 4.249 |
| 12/15/15 | 6.077 | 4.225 |
| 12/16/15 | 6.075 | 4.223 |
| 12/17/15 | 6.144 | 4.271 |
| 12/18/15 | 6.178 | 4.302 |
| 12/21/15 | 6.191 | 4.294 |
| 12/22/15 | 6.16 | 4.273 |
| 12/23/15 | 6.134 | 4.241 |
| 12/24/15 | 6.163 | 4.271 |
| 12/29/15 | 6.128 | 4.237 |
| 12/30/15 | 6.143 | 4.246 |
| 12/31/15 | 6.151 | 4.25 |
| 1/4/16 | 6.163 | 4.266 |
| 1/5/16 | 6.168 | 4.263 |
| 1/6/16 | 6.215 | 4.314 |
| 1/7/16 | 6.228 | 4.317 |
| 1/8/16 | 6.239 | 4.32 |
| 1/11/16 | 6.206 | 4.284 |
| 1/12/16 | 6.256 | 4.314 |
| 1/13/16 | 6.262 | 4.352 |
| 1/14/16 | 6.247 | 4.316 |
| 1/15/16 | 6.316 | 4.355 |
| 1/18/16 | 6.316 | 4.333 |
| 1/19/16 | 6.309 | 4.326 |
| 1/20/16 | 6.363 | 4.354 |
| 1/21/16 | 6.274 | 4.272 |
| 1/22/16 | 6.201 | 4.191 |
| 1/25/16 | 6.241 | 4.224 |
| 1/26/16 | 6.229 | 4.2 |
| 1/27/16 | 6.244 | 4.225 |
| 1/28/16 | 6.253 | 4.221 |
| 1/29/16 | 6.265 | 4.229 |
| 2/1/16 | 6.254 | 4.205 |
| 2/2/16 | 6.356 | 4.304 |
| 2/3/16 | 6.326 | 4.27 |
| 2/4/16 | 6.334 | 4.271 |
| 2/5/16 | 6.352 | 4.287 |
| 2/8/16 | 6.428 | 4.363 |
| 2/9/16 | 6.44 | 4.354 |
| 2/10/16 | 6.482 | 4.404 |
| 2/11/16 | 6.454 | 4.389 |
| 2/12/16 | 6.369 | 4.275 |
| 2/16/16 | 6.338 | 4.244 |
| 2/17/16 | 6.326 | 4.229 |
| 2/18/16 | 6.386 | 4.282 |
| 2/19/16 | 6.38 | 4.302 |
| 2/22/16 | 6.379 | 4.302 |
| 2/23/16 | 6.384 | 4.311 |
| 2/24/16 | 6.361 | 4.306 |
| 2/25/16 | 6.362 | 4.323 |
| 2/26/16 | 6.336 | 4.288 |
| 2/29/16 | 6.325 | 4.285 |
| 3/1/16 | 6.269 | 4.229 |
| 3/2/16 | 6.254 | 4.233 |
| 3/3/16 | 6.266 | 4.274 |
| 3/4/16 | 6.234 | 4.256 |
| 3/7/16 | 6.225 | 4.248 |
| 3/8/16 | 6.308 | 4.35 |
| 3/9/16 | 6.264 | 4.301 |
| 3/10/16 | 6.232 | 4.295 |
| 3/11/16 | 6.184 | 4.265 |
| 3/14/16 | 6.208 | 4.35 |
| 3/15/16 | 6.215 | 4.365 |
| 3/16/16 | 6.23 | 4.379 |
| 3/17/16 | 6.225 | 4.402 |
| 3/18/16 | 6.222 | 4.423 |
| 3/21/16 | 6.204 | 4.43 |
| 3/22/16 | 6.201 | 4.434 |
| 3/23/16 | 6.265 | 4.518 |
| 3/24/16 | 6.248 | 4.51 |
| 3/28/16 | 6.26 | 4.525 |
| 3/29/16 | 6.324 | 4.593 |
| 3/30/16 | 6.291 | 4.567 |
| 3/31/16 | 6.292 | 4.569 |
| 4/1/16 | 6.293 | 4.56 |
| 4/4/16 | 6.314 | 4.585 |
| 4/5/16 | 6.363 | 4.65 |
| 4/6/16 | 6.33 | 4.624 |
| 4/7/16 | 6.38 | 4.666 |
| 4/8/16 | 6.346 | 4.633 |
| 4/11/16 | 6.345 | 4.627 |
| 4/12/16 | 6.308 | 4.595 |
| 4/13/16 | 6.327 | 4.621 |
| 4/14/16 | 6.301 | 4.594 |
| 4/15/16 | 6.325 | 4.626 |
| 4/18/16 | 6.306 | 4.599 |
| 4/19/16 | 6.287 | 4.587 |
| 4/20/16 | 6.267 | 4.578 |
| 4/21/16 | 6.25 | 4.563 |
| 4/22/16 | 6.22 | 4.551 |
| 4/25/16 | 6.2 | 4.534 |
| 4/26/16 | 6.206 | 4.574 |
| 4/27/16 | 6.241 | 4.616 |
| 4/28/16 | 6.245 | 4.639 |
| 4/29/16 | 6.216 | 4.637 |
| 5/2/16 | 6.176 | 4.612 |
| 5/3/16 | 6.228 | 4.665 |
| 5/4/16 | 6.265 | 4.7 |
| 5/5/16 | 6.312 | 4.734 |
| 5/6/16 | 6.31 | 4.714 |
| 5/9/16 | 6.332 | 4.716 |
| 5/10/16 | 6.336 | 4.716 |
| 5/11/16 | 6.334 | 4.71 |
| 5/12/16 | 6.315 | 4.682 |
| 5/13/16 | 6.35 | 4.713 |
| 5/16/16 | 6.312 | 4.664 |
| 5/17/16 | 6.32 | 4.671 |
| 5/18/16 | 6.295 | 4.627 |
| 5/19/16 | 6.316 | 4.645 |
| 5/20/16 | 6.311 | 4.625 |
| 5/24/16 | 6.298 | 4.607 |
| 5/25/16 | 6.288 | 4.595 |
| 5/26/16 | 6.323 | 4.628 |
| 5/27/16 | 6.315 | 4.612 |
| 5/30/16 | 6.318 | 4.613 |
| 5/31/16 | 6.339 | 4.641 |
| 6/1/16 | 6.352 | 4.642 |
| 6/2/16 | 6.405 | 4.687 |
| 6/3/16 | 6.459 | 4.735 |
| 6/6/16 | 6.415 | 4.677 |
| 6/7/16 | 6.419 | 4.681 |
| 6/8/16 | 6.433 | 4.692 |
| 6/9/16 | 6.455 | 4.713 |
| 6/10/16 | 6.501 | 4.763 |
| 6/13/16 | 6.515 | 4.764 |
| 6/14/16 | 6.518 | 4.756 |
| 6/15/16 | 6.541 | 4.778 |
| 6/16/16 | 6.54 | 4.779 |
| 6/17/16 | 6.532 | 4.767 |
| 6/20/16 | 6.458 | 4.694 |
| 6/21/16 | 6.414 | 4.651 |
| 6/22/16 | 6.428 | 4.667 |
| 6/23/16 | 6.383 | 4.63 |
| 6/24/16 | 6.502 | 4.703 |
| 6/27/16 | 6.58 | 4.785 |
| 6/28/16 | 6.572 | 4.78 |
| 6/29/16 | 6.535 | 4.753 |
| 6/30/16 | 6.584 | 4.799 |
| 7/4/16 | 6.626 | 4.845 |
| 7/5/16 | 6.699 | 4.92 |
| 7/6/16 | 6.746 | 4.958 |
| 7/7/16 | 6.744 | 4.96 |
| 7/8/16 | 6.752 | 4.975 |
| 7/11/16 | 6.741 | 4.963 |
| 7/12/16 | 6.649 | 4.872 |
| 7/13/16 | 6.687 | 4.923 |
| 7/14/16 | 6.622 | 4.875 |
| 7/15/16 | 6.591 | 4.804 |
| 7/18/16 | 6.567 | 4.815 |
| 7/19/16 | 6.592 | 4.838 |
| 7/20/16 | 6.551 | 4.809 |
| 7/21/16 | 6.556 | 4.815 |
| 7/22/16 | 6.57 | 4.853 |
| 7/25/16 | 6.573 | 4.856 |
| 7/26/16 | 6.569 | 4.862 |
| 7/27/16 | 6.612 | 4.9 |
| 7/28/16 | 6.615 | 4.905 |
| 7/29/16 | 6.659 | 4.942 |
| 8/2/16 | 6.626 | 4.917 |
| 8/3/16 | 6.626 | 4.909 |
| 8/4/16 | 6.664 | 4.94 |
| 8/5/16 | 6.618 | 4.9 |
| 8/8/16 | 6.623 | 4.901 |
| 8/9/16 | 6.668 | 4.958 |
| 8/10/16 | 6.692 | 4.974 |
| 8/11/16 | 6.66 | 4.932 |
| 8/12/16 | 6.683 | 4.956 |
| 8/15/16 | 6.654 | 4.935 |
| 8/16/16 | 6.64 | 4.91 |
| 8/17/16 | 6.636 | 4.906 |
| 8/18/16 | 6.639 | 4.911 |
| 8/19/16 | 6.612 | 4.892 |
| 8/22/16 | 6.661 | 4.941 |
| 8/23/16 | 6.661 | 4.946 |
| 8/24/16 | 6.653 | 4.946 |
| 8/25/16 | 6.628 | 4.92 |
| 8/26/16 | 6.612 | 4.913 |
| 8/29/16 | 6.671 | 4.973 |
| 8/30/16 | 6.672 | 4.978 |
| 8/31/16 | 6.672 | 4.983 |
| 9/1/16 | 6.68 | 4.991 |
| 9/2/16 | 6.642 | 4.956 |
| 9/6/16 | 6.674 | 4.979 |
| 9/7/16 | 6.683 | 5.003 |
| 9/8/16 | 6.603 | 4.924 |
| 9/9/16 | 6.529 | 4.849 |
| 9/12/16 | 6.514 | 4.833 |
| 9/13/16 | 6.438 | 4.763 |
| 9/14/16 | 6.473 | 4.795 |
| 9/15/16 | 6.461 | 4.78 |
| 9/16/16 | 6.476 | 4.792 |
| 9/19/16 | 6.475 | 4.795 |
| 9/20/16 | 6.512 | 4.828 |
| 9/21/16 | 6.524 | 4.841 |
| 9/22/16 | 6.568 | 4.891 |
| 9/23/16 | 6.602 | 4.932 |
| 9/26/16 | 6.64 | 4.97 |
| 9/27/16 | 6.665 | 4.992 |
| 9/28/16 | 6.656 | 4.984 |
| 9/29/16 | 6.675 | 4.999 |
| 9/30/16 | 6.639 | 4.95 |
| 10/3/16 | 6.627 | 4.95 |
| 10/4/16 | 6.567 | 4.883 |
| 10/5/16 | 6.541 | 4.849 |
| 10/6/16 | 6.504 | 4.818 |
| 10/7/16 | 6.482 | 4.794 |
| 10/11/16 | 6.465 | 4.774 |
| 10/12/16 | 6.469 | 4.774 |
| 10/13/16 | 6.494 | 4.819 |
| 10/14/16 | 6.43 | 4.741 |
| 10/17/16 | 6.454 | 4.773 |
| 10/18/16 | 6.466 | 4.784 |
| 10/19/16 | 6.454 | 4.773 |
| 10/20/16 | 6.471 | 4.793 |
| 10/21/16 | 6.503 | 4.83 |
| 10/24/16 | 6.475 | 4.811 |
| 10/25/16 | 6.488 | 4.818 |
| 10/26/16 | 6.471 | 4.802 |
| 10/27/16 | 6.407 | 4.736 |
| 10/28/16 | 6.409 | 4.737 |
| 10/31/16 | 6.451 | 4.776 |
| 11/1/16 | 6.448 | 4.774 |
| 11/2/16 | 6.472 | 4.804 |
| 11/3/16 | 6.453 | 4.783 |
| 11/4/16 | 6.484 | 4.821 |
| 11/7/16 | 6.429 | 4.759 |
| 11/8/16 | 6.388 | 4.712 |
| 11/9/16 | 6.282 | 4.601 |
| 11/10/16 | 6.23 | 4.572 |
| 11/14/16 | 6.106 | 4.45 |
| 11/15/16 | 6.136 | 4.481 |
| 11/16/16 | 6.174 | 4.542 |
| 11/17/16 | 6.119 | 4.497 |
| 11/18/16 | 6.088 | 4.458 |
| 11/21/16 | 6.098 | 4.472 |
| 11/22/16 | 6.12 | 4.497 |
| 11/23/16 | 6.132 | 4.498 |
| 11/24/16 | 6.119 | 4.483 |
| 11/25/16 | 6.153 | 4.52 |
| 11/28/16 | 6.185 | 4.557 |
| 11/29/16 | 6.208 | 4.58 |
| 11/30/16 | 6.134 | 4.518 |
| 12/1/16 | 6.038 | 4.441 |
| 12/2/16 | 6.076 | 4.488 |
| 12/5/16 | 6.079 | 4.504 |
| 12/6/16 | 6.062 | 4.498 |
| 12/7/16 | 6.093 | 4.532 |
| 12/8/16 | 6.022 | 4.462 |
| 12/9/16 | 5.958 | 4.396 |
| 12/12/16 | 5.923 | 4.359 |
| 12/13/16 | 5.924 | 4.38 |
| 12/14/16 | 5.909 | 4.372 |
| 12/15/16 | 5.888 | 4.344 |
| 12/16/16 | 5.875 | 4.339 |
| 12/19/16 | 5.914 | 4.37 |
| 12/20/16 | 5.901 | 4.362 |
| 12/21/16 | 5.902 | 4.37 |
| 12/22/16 | 5.892 | 4.363 |
| 12/23/16 | 5.912 | 4.384 |
| 12/28/16 | 5.967 | 4.435 |
| 12/29/16 | 5.982 | 4.453 |
| 12/30/16 | 5.988 | 4.465 |
| 1/3/17 | 6.171 | 4.65 |
| 1/4/17 | 6.204 | 4.697 |
| 1/5/17 | 6.24 | 4.741 |
| 1/6/17 | 6.183 | 4.697 |
| 1/9/17 | 6.222 | 4.728 |
| 1/10/17 | 6.218 | 4.731 |
| 1/11/17 | 6.219 | 4.744 |
| 1/12/17 | 6.234 | 4.762 |
| 1/13/17 | 6.184 | 4.704 |
| 1/16/17 | 6.2 | 4.728 |
| 1/17/17 | 6.214 | 4.741 |
| 1/18/17 | 6.179 | 4.7 |
| 1/19/17 | 6.128 | 4.651 |
| 1/20/17 | 6.117 | 4.643 |
| 1/23/17 | 6.173 | 4.692 |
| 1/24/17 | 6.108 | 4.632 |
| 1/25/17 | 6.043 | 4.557 |
| 1/26/17 | 6.041 | 4.558 |
| 1/27/17 | 6.072 | 4.589 |
| 1/30/17 | 6.065 | 4.588 |
| 1/31/17 | 6.092 | 4.615 |
| 2/1/17 | 6.095 | 4.614 |
| 2/2/17 | 6.089 | 4.617 |
| 2/3/17 | 6.079 | 4.602 |
| 2/6/17 | 6.123 | 4.648 |
| 2/7/17 | 6.142 | 4.671 |
| 2/8/17 | 6.207 | 4.74 |
| 2/9/17 | 6.149 | 4.675 |
| 2/10/17 | 6.133 | 4.664 |
| 2/13/17 | 6.092 | 4.624 |
| 2/14/17 | 6.067 | 4.596 |
| 2/15/17 | 6.039 | 4.577 |
| 2/16/17 | 6.065 | 4.616 |
| 2/17/17 | 6.091 | 4.639 |
| 2/21/17 | 6.076 | 4.621 |
| 2/22/17 | 6.07 | 4.631 |
| 2/23/17 | 6.107 | 4.661 |
| 2/24/17 | 6.172 | 4.727 |
| 2/27/17 | 6.136 | 4.697 |
| 2/28/17 | 6.158 | 4.717 |
| 3/1/17 | 6.106 | 4.659 |
| 3/2/17 | 6.102 | 4.658 |
| 3/3/17 | 6.093 | 4.653 |
| 3/6/17 | 6.085 | 4.66 |
| 3/7/17 | 6.07 | 4.645 |
| 3/8/17 | 6.033 | 4.603 |
| 3/9/17 | 6.007 | 4.573 |
| 3/10/17 | 6.019 | 4.579 |
| 3/13/17 | 5.976 | 4.538 |
| 3/14/17 | 6.011 | 4.581 |
| 3/15/17 | 6.083 | 4.642 |
| 3/16/17 | 6.05 | 4.602 |
| 3/17/17 | 6.089 | 4.643 |
| 3/20/17 | 6.111 | 4.668 |
| 3/21/17 | 6.137 | 4.69 |
| 3/22/17 | 6.158 | 4.714 |
| 3/23/17 | 6.153 | 4.719 |
| 3/24/17 | 6.192 | 4.761 |
| 3/27/17 | 6.216 | 4.781 |
| 3/28/17 | 6.187 | 4.753 |
| 3/29/17 | 6.215 | 4.779 |
| 3/30/17 | 6.172 | 4.745 |
| 3/31/17 | 6.198 | 4.763 |
| 4/3/17 | 6.247 | 4.816 |
| 4/4/17 | 6.237 | 4.81 |
| 4/5/17 | 6.256 | 4.837 |
| 4/6/17 | 6.271 | 4.857 |
| 4/7/17 | 6.24 | 4.826 |
| 4/10/17 | 6.237 | 4.829 |
| 4/11/17 | 6.279 | 4.873 |
| 4/12/17 | 6.317 | 4.905 |
| 4/13/17 | 6.337 | 4.946 |
| 4/17/17 | 6.318 | 4.934 |
| 4/18/17 | 6.387 | 5.007 |
| 4/19/17 | 6.361 | 4.99 |
| 4/20/17 | 6.35 | 4.97 |
| 4/21/17 | 6.359 | 4.999 |
| 4/24/17 | 6.347 | 4.989 |
| 4/25/17 | 6.308 | 4.972 |
| 4/26/17 | 6.335 | 5.008 |
| 4/27/17 | 6.318 | 4.999 |
| 4/28/17 | 6.338 | 5.026 |
| 5/1/17 | 6.313 | 5.017 |
| 5/2/17 | 6.364 | 5.074 |
| 5/3/17 | 6.355 | 5.061 |
| 5/4/17 | 6.354 | 5.063 |
| 5/5/17 | 6.348 | 5.052 |
| 5/8/17 | 6.295 | 5.008 |
| 5/9/17 | 6.259 | 4.965 |
| 5/10/17 | 6.235 | 4.929 |
| 5/11/17 | 6.254 | 4.936 |
| 5/12/17 | 6.266 | 4.922 |
| 5/15/17 | 6.251 | 4.896 |
| 5/16/17 | 6.276 | 4.91 |
| 5/17/17 | 6.395 | 5.019 |
| 5/18/17 | 6.421 | 5.025 |
| 5/19/17 | 6.395 | 4.999 |
| 5/23/17 | 6.36 | 4.975 |
| 5/24/17 | 6.39 | 4.99 |
| 5/25/17 | 6.408 | 5.008 |
| 5/26/17 | 6.421 | 5.022 |
| 5/29/17 | 6.453 | 5.041 |
| 5/30/17 | 6.44 | 5.026 |
| 5/31/17 | 6.448 | 5.036 |
| 6/1/17 | 6.45 | 5.033 |
| 6/2/17 | 6.485 | 5.073 |
| 6/5/17 | 6.476 | 5.062 |
| 6/6/17 | 6.501 | 5.086 |
| 6/7/17 | 6.48 | 5.066 |
| 6/8/17 | 6.467 | 5.049 |
| 6/9/17 | 6.466 | 5.053 |
| 6/12/17 | 6.426 | 5.024 |
| 6/13/17 | 6.388 | 4.99 |
| 6/14/17 | 6.465 | 5.067 |
| 6/15/17 | 6.449 | 5.062 |
| 6/16/17 | 6.465 | 5.076 |
| 6/19/17 | 6.458 | 5.073 |
| 6/20/17 | 6.492 | 5.106 |
| 6/21/17 | 6.501 | 5.116 |
| 6/22/17 | 6.507 | 5.125 |
| 6/23/17 | 6.525 | 5.147 |
| 6/26/17 | 6.543 | 5.169 |
| 6/27/17 | 6.469 | 5.11 |
| 6/28/17 | 6.435 | 5.088 |
| 6/29/17 | 6.382 | 5.047 |
| 6/30/17 | 6.352 | 5.022 |
| 7/4/17 | 6.307 | 4.975 |
| 7/5/17 | 6.346 | 4.998 |
| 7/6/17 | 6.289 | 4.961 |
| 7/7/17 | 6.242 | 4.916 |
| 7/10/17 | 6.235 | 4.914 |
| 7/11/17 | 6.258 | 4.933 |
| 7/12/17 | 6.272 | 4.947 |
| 7/13/17 | 6.25 | 4.926 |
| 7/14/17 | 6.26 | 4.94 |
| 7/17/17 | 6.238 | 4.933 |
| 7/18/17 | 6.265 | 4.957 |
| 7/19/17 | 6.237 | 4.938 |
| 7/20/17 | 6.252 | 4.928 |
| 7/21/17 | 6.25 | 4.93 |
| 7/24/17 | 6.229 | 4.91 |
| 7/25/17 | 6.139 | 4.816 |
| 7/26/17 | 6.147 | 4.832 |
| 7/27/17 | 6.08 | 4.762 |
| 7/28/17 | 6.049 | 4.739 |
| 7/31/17 | 6.035 | 4.712 |
| 8/1/17 | 6.122 | 4.8 |
| 8/2/17 | 6.134 | 4.822 |
| 8/3/17 | 6.176 | 4.86 |
| 8/4/17 | 6.148 | 4.826 |
| 8/8/17 | 6.135 | 4.806 |
| 8/9/17 | 6.158 | 4.832 |
| 8/10/17 | 6.206 | 4.877 |
| 8/11/17 | 6.205 | 4.868 |
| 8/14/17 | 6.181 | 4.845 |
| 8/15/17 | 6.151 | 4.818 |
| 8/16/17 | 6.189 | 4.839 |
| 8/17/17 | 6.21 | 4.856 |
| 8/18/17 | 6.212 | 4.839 |
| 8/21/17 | 6.203 | 4.826 |
| 8/22/17 | 6.181 | 4.799 |
| 8/23/17 | 6.207 | 4.822 |
| 8/24/17 | 6.193 | 4.819 |
| 8/25/17 | 6.202 | 4.821 |
| 8/28/17 | 6.197 | 4.818 |
| 8/29/17 | 6.224 | 4.848 |
| 8/30/17 | 6.231 | 4.845 |
| 8/31/17 | 6.237 | 4.854 |
| 9/1/17 | 6.196 | 4.811 |
| 9/5/17 | 6.225 | 4.844 |
| 9/6/17 | 6.16 | 4.775 |
| 9/7/17 | 6.173 | 4.787 |
| 9/8/17 | 6.156 | 4.761 |
| 9/11/17 | 6.123 | 4.723 |
| 9/12/17 | 6.102 | 4.701 |
| 9/13/17 | 6.08 | 4.682 |
| 9/14/17 | 6.087 | 4.679 |
| 9/15/17 | 6.063 | 4.662 |
| 9/18/17 | 6.065 | 4.662 |
| 9/19/17 | 6.052 | 4.659 |
| 9/20/17 | 6.051 | 4.647 |
| 9/21/17 | 6.041 | 4.639 |
| 9/22/17 | 6.049 | 4.647 |
| 9/25/17 | 6.065 | 4.671 |
| 9/26/17 | 6.048 | 4.654 |
| 9/27/17 | 6.003 | 4.623 |
| 9/28/17 | 5.996 | 4.602 |
| 9/29/17 | 6.028 | 4.646 |
| 10/2/17 | 6 | 4.619 |
| 10/3/17 | 6.007 | 4.619 |
| 10/4/17 | 6.012 | 4.63 |
| 10/5/17 | 6.021 | 4.638 |
| 10/6/17 | 6.006 | 4.628 |
| 10/10/17 | 6.018 | 4.641 |
| 10/11/17 | 6.039 | 4.664 |
| 10/12/17 | 6.066 | 4.684 |
| 10/13/17 | 6.108 | 4.727 |
| 10/16/17 | 6.117 | 4.742 |
| 10/17/17 | 6.142 | 4.765 |
| 10/18/17 | 6.128 | 4.768 |
| 10/19/17 | 6.148 | 4.773 |
| 10/20/17 | 6.127 | 4.755 |
| 10/23/17 | 6.13 | 4.762 |
| 10/24/17 | 6.104 | 4.748 |
| 10/25/17 | 6.11 | 4.759 |
| 10/26/17 | 6.121 | 4.786 |
| 10/27/17 | 6.161 | 4.837 |
| 10/30/17 | 6.186 | 4.868 |
| 10/31/17 | 6.198 | 4.884 |
| 11/1/17 | 6.198 | 4.902 |
| 11/2/17 | 6.214 | 4.92 |
| 11/3/17 | 6.231 | 4.938 |
| 11/6/17 | 6.254 | 4.983 |
| 11/7/17 | 6.276 | 5.015 |
| 11/8/17 | 6.246 | 4.996 |
| 11/9/17 | 6.229 | 4.971 |
| 11/10/17 | 6.193 | 4.933 |
| 11/14/17 | 6.222 | 4.956 |
| 11/15/17 | 6.254 | 4.995 |
| 11/16/17 | 6.204 | 4.941 |
| 11/17/17 | 6.224 | 4.961 |
| 11/20/17 | 6.206 | 4.933 |
| 11/21/17 | 6.238 | 4.97 |
| 11/22/17 | 6.25 | 4.985 |
| 11/23/17 | 6.261 | 4.996 |
| 11/24/17 | 6.267 | 4.999 |
| 11/27/17 | 6.276 | 5.006 |
| 11/28/17 | 6.297 | 5.016 |
| 11/29/17 | 6.265 | 4.99 |
| 11/30/17 | 6.27 | 4.989 |
| 12/1/17 | 6.295 | 5.016 |
| 12/4/17 | 6.284 | 5.002 |
| 12/5/17 | 6.31 | 5.027 |
| 12/6/17 | 6.334 | 5.063 |
| 12/7/17 | 6.332 | 5.047 |
| 12/8/17 | 6.333 | 5.051 |
| 12/11/17 | 6.338 | 5.056 |
| 12/12/17 | 6.333 | 5.051 |
| 12/13/17 | 6.345 | 5.063 |
| 12/14/17 | 6.352 | 5.064 |
| 12/15/17 | 6.386 | 5.114 |
| 12/18/17 | 6.365 | 5.086 |
| 12/19/17 | 6.302 | 5.032 |
| 12/20/17 | 6.252 | 4.985 |
| 12/21/17 | 6.25 | 4.979 |
| 12/22/17 | 6.252 | 4.984 |
| 12/27/17 | 6.304 | 5.035 |
| 12/28/17 | 6.261 | 4.998 |
| 12/29/17 | 6.234 | 4.964 |
| 1/2/18 | 6.182 | 4.916 |
| 1/3/18 | 6.206 | 4.942 |
| 1/4/18 | 6.18 | 4.916 |
| 1/5/18 | 6.141 | 4.881 |
| 1/8/18 | 6.146 | 4.886 |
| 1/9/18 | 6.09 | 4.852 |
| 1/10/18 | 6.11 | 4.874 |
| 1/11/18 | 6.123 | 4.884 |
| 1/12/18 | 6.13 | 4.893 |
| 1/15/18 | 6.129 | 4.906 |
| 1/16/18 | 6.156 | 4.932 |
| 1/17/18 | 6.153 | 4.938 |
| 1/18/18 | 6.15 | 4.933 |
| 1/19/18 | 6.125 | 4.907 |
| 1/22/18 | 6.134 | 4.915 |
| 1/23/18 | 6.147 | 4.933 |
| 1/24/18 | 6.128 | 4.92 |
| 1/25/18 | 6.158 | 4.953 |
| 1/26/18 | 6.17 | 4.961 |
| 1/29/18 | 6.157 | 4.948 |
| 1/30/18 | 6.124 | 4.912 |
| 1/31/18 | 6.14 | 4.922 |
| 2/1/18 | 6.084 | 4.87 |
| 2/2/18 | 6.062 | 4.85 |
| 2/5/18 | 6.083 | 4.836 |
| 2/6/18 | 6.04 | 4.783 |
| 2/7/18 | 6.025 | 4.773 |
| 2/8/18 | 6.003 | 4.758 |
| 2/9/18 | 6.001 | 4.734 |
| 2/12/18 | 6.011 | 4.746 |
| 2/13/18 | 6.024 | 4.757 |
| 2/14/18 | 5.993 | 4.718 |
| 2/15/18 | 5.993 | 4.721 |
| 2/16/18 | 6.036 | 4.763 |
| 2/20/18 | 6.037 | 4.757 |
| 2/21/18 | 6.009 | 4.74 |
| 2/22/18 | 6.047 | 4.766 |
| 2/23/18 | 6.101 | 4.816 |
| 2/26/18 | 6.09 | 4.809 |
| 2/27/18 | 6.066 | 4.786 |
| 2/28/18 | 6.125 | 4.849 |
| 3/1/18 | 6.17 | 4.883 |
| 3/2/18 | 6.138 | 4.847 |
| 3/5/18 | 6.127 | 4.836 |
| 3/6/18 | 6.104 | 4.809 |
| 3/7/18 | 6.087 | 4.785 |
| 3/8/18 | 6.099 | 4.791 |
| 3/9/18 | 6.057 | 4.747 |
| 3/12/18 | 6.087 | 4.776 |
| 3/13/18 | 6.116 | 4.807 |
| 3/14/18 | 6.176 | 4.869 |
| 3/15/18 | 6.205 | 4.906 |
| 3/16/18 | 6.213 | 4.899 |
| 3/19/18 | 6.195 | 4.892 |
| 3/20/18 | 6.159 | 4.862 |
| 3/21/18 | 6.128 | 4.817 |
| 3/22/18 | 6.201 | 4.893 |
| 3/23/18 | 6.187 | 4.875 |
| 3/26/18 | 6.151 | 4.82 |
| 3/27/18 | 6.215 | 4.895 |
| 3/28/18 | 6.243 | 4.889 |
| 3/29/18 | 6.272 | 4.894 |
| 4/2/18 | 6.25 | 4.878 |
| 4/3/18 | 6.207 | 4.831 |
| 4/4/18 | 6.171 | 4.791 |
| 4/5/18 | 6.159 | 4.769 |
| 4/6/18 | 6.193 | 4.807 |
| 4/9/18 | 6.209 | 4.829 |
| 4/10/18 | 6.182 | 4.825 |
| 4/11/18 | 6.179 | 4.822 |
| 4/12/18 | 6.108 | 4.773 |
| 4/13/18 | 6.15 | 4.812 |
| 4/16/18 | 6.126 | 4.783 |
| 4/17/18 | 6.155 | 4.828 |
| 4/18/18 | 6.112 | 4.784 |
| 4/19/18 | 6.074 | 4.742 |
| 4/20/18 | 6.055 | 4.728 |
| 4/23/18 | 6.056 | 4.728 |
| 4/24/18 | 6.049 | 4.735 |
| 4/25/18 | 6.025 | 4.696 |
| 4/26/18 | 6.057 | 4.728 |
| 4/27/18 | 6.088 | 4.763 |
| 4/30/18 | 6.099 | 4.773 |
| 5/1/18 | 6.09 | 4.742 |
| 5/2/18 | 6.067 | 4.725 |
| 5/3/18 | 6.094 | 4.752 |
| 5/4/18 | 6.092 | 4.747 |
| 5/7/18 | 6.089 | 4.739 |
| 5/8/18 | 6.079 | 4.729 |
| 5/9/18 | 6.052 | 4.7 |
| 5/10/18 | 6.069 | 4.711 |
| 5/11/18 | 6.093 | 4.738 |
| 5/14/18 | 6.04 | 4.691 |
| 5/15/18 | 5.986 | 4.632 |
| 5/16/18 | 5.986 | 4.635 |
| 5/17/18 | 5.971 | 4.622 |
| 5/18/18 | 6.004 | 4.655 |
| 5/22/18 | 6.003 | 4.658 |
| 5/23/18 | 6.051 | 4.699 |
| 5/24/18 | 6.077 | 4.735 |
| 5/25/18 | 6.117 | 4.77 |
| 5/28/18 | 6.156 | 4.816 |
| 5/29/18 | 6.251 | 4.91 |
| 5/30/18 | 6.203 | 4.862 |
| 5/31/18 | 6.236 | 4.885 |
| 6/1/18 | 6.219 | 4.871 |
| 6/4/18 | 6.185 | 4.832 |
| 6/5/18 | 6.195 | 4.845 |
| 6/6/18 | 6.144 | 4.798 |
| 6/7/18 | 6.165 | 4.82 |
| 6/8/18 | 6.136 | 4.792 |
| 6/11/18 | 6.146 | 4.797 |
| 6/12/18 | 6.165 | 4.817 |
| 6/13/18 | 6.172 | 4.826 |
| 6/14/18 | 6.21 | 4.864 |
| 6/15/18 | 6.255 | 4.909 |
| 6/18/18 | 6.26 | 4.921 |
| 6/19/18 | 6.299 | 4.96 |
| 6/20/18 | 6.272 | 4.93 |
| 6/21/18 | 6.297 | 4.949 |
| 6/22/18 | 6.294 | 4.937 |
| 6/25/18 | 6.318 | 4.952 |
| 6/26/18 | 6.313 | 4.955 |
| 6/27/18 | 6.321 | 4.966 |
| 6/28/18 | 6.295 | 4.914 |
| 6/29/18 | 6.295 | 4.912 |
| 7/3/18 | 6.317 | 4.934 |
| 7/4/18 | 6.297 | 4.911 |
| 7/5/18 | 6.313 | 4.93 |
| 7/6/18 | 6.332 | 4.956 |
| 7/9/18 | 6.282 | 4.909 |
| 7/10/18 | 6.297 | 4.907 |
| 7/11/18 | 6.309 | 4.921 |
| 7/12/18 | 6.299 | 4.902 |
| 7/13/18 | 6.31 | 4.914 |
| 7/16/18 | 6.311 | 4.922 |
| 7/17/18 | 6.327 | 4.935 |
| 7/18/18 | 6.302 | 4.913 |
| 7/19/18 | 6.336 | 4.945 |
| 7/20/18 | 6.281 | 4.887 |
| 7/23/18 | 6.234 | 4.836 |
| 7/24/18 | 6.235 | 4.842 |
| 7/25/18 | 6.18 | 4.808 |
| 7/26/18 | 6.173 | 4.791 |
| 7/27/18 | 6.168 | 4.779 |
| 7/30/18 | 6.161 | 4.779 |
| 7/31/18 | 6.171 | 4.779 |
| 8/1/18 | 6.122 | 4.746 |
| 8/2/18 | 6.118 | 4.736 |
| 8/3/18 | 6.135 | 4.758 |
| 8/7/18 | 6.116 | 4.741 |
| 8/8/18 | 6.129 | 4.752 |
| 8/9/18 | 6.152 | 4.773 |
| 8/10/18 | 6.183 | 4.809 |
| 8/13/18 | 6.178 | 4.801 |
| 8/14/18 | 6.156 | 4.772 |
| 8/15/18 | 6.214 | 4.829 |
| 8/16/18 | 6.229 | 4.845 |
| 8/17/18 | 6.223 | 4.845 |
| 8/20/18 | 6.242 | 4.852 |
| 8/21/18 | 6.234 | 4.846 |
| 8/22/18 | 6.239 | 4.856 |
| 8/23/18 | 6.236 | 4.858 |
| 8/24/18 | 6.242 | 4.853 |
| 8/27/18 | 6.205 | 4.822 |
| 8/28/18 | 6.18 | 4.802 |
| 8/29/18 | 6.177 | 4.791 |
| 8/30/18 | 6.207 | 4.815 |
| 8/31/18 | 6.248 | 4.856 |
| 9/4/18 | 6.244 | 4.851 |
| 9/5/18 | 6.241 | 4.836 |
| 9/6/18 | 6.25 | 4.843 |
| 9/7/18 | 6.201 | 4.79 |
| 9/10/18 | 6.2 | 4.791 |
| 9/11/18 | 6.149 | 4.749 |
| 9/12/18 | 6.148 | 4.745 |
| 9/13/18 | 6.153 | 4.743 |
| 9/14/18 | 6.139 | 4.73 |
| 9/17/18 | 6.144 | 4.725 |
| 9/18/18 | 6.094 | 4.684 |
| 9/19/18 | 6.07 | 4.648 |
| 9/20/18 | 6.073 | 4.644 |
| 9/21/18 | 6.06 | 4.638 |
| 9/24/18 | 6.043 | 4.623 |
| 9/25/18 | 6.033 | 4.611 |
| 9/26/18 | 6.082 | 4.656 |
| 9/27/18 | 6.079 | 4.661 |
| 9/28/18 | 6.078 | 4.657 |
| 10/1/18 | 6.016 | 4.587 |
| 10/2/18 | 6.048 | 4.626 |
| 10/3/18 | 5.964 | 4.563 |
| 10/4/18 | 5.958 | 4.537 |
| 10/5/18 | 5.915 | 4.496 |
| 10/9/18 | 5.941 | 4.521 |
| 10/10/18 | 5.968 | 4.526 |
| 10/11/18 | 5.991 | 4.575 |
| 10/12/18 | 5.987 | 4.571 |
| 10/15/18 | 5.976 | 4.551 |
| 10/16/18 | 5.979 | 4.557 |
| 10/17/18 | 5.959 | 4.544 |
| 10/18/18 | 5.975 | 4.552 |
| 10/19/18 | 5.971 | 4.55 |
| 10/22/18 | 5.981 | 4.556 |
| 10/23/18 | 6.012 | 4.576 |
| 10/24/18 | 6.029 | 4.594 |
| 10/25/18 | 6.026 | 4.569 |
| 10/26/18 | 6.071 | 4.625 |
| 10/29/18 | 6.062 | 4.621 |
| 10/30/18 | 6.006 | 4.56 |
| 10/31/18 | 5.967 | 4.516 |
| 11/1/18 | 5.979 | 4.517 |
| 11/2/18 | 5.929 | 4.47 |
| 11/5/18 | 5.951 | 4.489 |
| 11/6/18 | 5.941 | 4.479 |
| 11/7/18 | 5.941 | 4.495 |
| 11/8/18 | 5.938 | 4.48 |
| 11/9/18 | 5.973 | 4.514 |
| 11/13/18 | 6.009 | 4.545 |
| 11/14/18 | 6.031 | 4.563 |
| 11/15/18 | 6.061 | 4.592 |
| 11/16/18 | 6.08 | 4.597 |
| 11/19/18 | 6.078 | 4.592 |
| 11/20/18 | 6.091 | 4.569 |
| 11/21/18 | 6.081 | 4.553 |
| 11/22/18 | 6.081 | 4.547 |
| 11/23/18 | 6.112 | 4.559 |
| 11/26/18 | 6.096 | 4.539 |
| 11/27/18 | 6.105 | 4.556 |
| 11/28/18 | 6.085 | 4.54 |
| 11/29/18 | 6.088 | 4.535 |
| 11/30/18 | 6.11 | 4.53 |
| 12/3/18 | 6.149 | 4.574 |
| 12/4/18 | 6.238 | 4.641 |
| 12/5/18 | 6.244 | 4.641 |
| 12/6/18 | 6.265 | 4.645 |
| 12/7/18 | 6.266 | 4.635 |
| 12/10/18 | 6.286 | 4.635 |
| 12/11/18 | 6.272 | 4.626 |
| 12/12/18 | 6.22 | 4.581 |
| 12/13/18 | 6.173 | 4.541 |
| 12/14/18 | 6.224 | 4.593 |
| 12/17/18 | 6.281 | 4.64 |
| 12/18/18 | 6.317 | 4.681 |
| 12/19/18 | 6.377 | 4.728 |
| 12/20/18 | 6.335 | 4.703 |
| 12/21/18 | 6.319 | 4.654 |
| 12/24/18 | 6.348 | 4.681 |
| 12/27/18 | 6.331 | 4.665 |
| 12/28/18 | 6.354 | 4.664 |
| 12/31/18 | 6.316 | 4.623 |
| 1/2/19 | 6.38 | 4.678 |
| 1/3/19 | 6.437 | 4.745 |
| 1/4/19 | 6.364 | 4.672 |
| 1/7/19 | 6.341 | 4.656 |
| 1/8/19 | 6.325 | 4.656 |
| 1/9/19 | 6.323 | 4.662 |
| 1/10/19 | 6.309 | 4.657 |
| 1/11/19 | 6.338 | 4.688 |
| 1/14/19 | 6.328 | 4.674 |
| 1/15/19 | 6.306 | 4.654 |
| 1/16/19 | 6.278 | 4.641 |
| 1/17/19 | 6.274 | 4.658 |
| 1/18/19 | 6.243 | 4.652 |
| 1/21/19 | 6.263 | 4.685 |
| 1/22/19 | 6.313 | 4.731 |
| 1/23/19 | 6.312 | 4.73 |
| 1/24/19 | 6.341 | 4.76 |
| 1/25/19 | 6.303 | 4.726 |
| 1/28/19 | 6.319 | 4.749 |
| 1/29/19 | 6.33 | 4.763 |
| 1/30/19 | 6.338 | 4.768 |
| 1/31/19 | 6.362 | 4.82 |
| 2/1/19 | 6.316 | 4.781 |
| 2/4/19 | 6.302 | 4.768 |
| 2/5/19 | 6.32 | 4.792 |
| 2/6/19 | 6.324 | 4.792 |
| 2/7/19 | 6.358 | 4.819 |
| 2/8/19 | 6.362 | 4.822 |
| 2/11/19 | 6.349 | 4.804 |
| 2/12/19 | 6.335 | 4.791 |
| 2/13/19 | 6.323 | 4.784 |
| 2/14/19 | 6.36 | 4.818 |
| 2/15/19 | 6.348 | 4.804 |
| 2/19/19 | 6.358 | 4.815 |
| 2/20/19 | 6.354 | 4.811 |
| 2/21/19 | 6.326 | 4.783 |
| 2/22/19 | 6.359 | 4.814 |
| 2/25/19 | 6.359 | 4.811 |
| 2/26/19 | 6.379 | 4.838 |
| 2/27/19 | 6.338 | 4.8 |
| 2/28/19 | 6.31 | 4.774 |
| 3/1/19 | 6.296 | 4.762 |
| 3/4/19 | 6.332 | 4.796 |
| 3/5/19 | 6.342 | 4.81 |
| 3/6/19 | 6.381 | 4.851 |
| 3/7/19 | 6.432 | 4.889 |
| 3/8/19 | 6.444 | 4.889 |
| 3/11/19 | 6.451 | 4.897 |
| 3/12/19 | 6.473 | 4.925 |
| 3/13/19 | 6.456 | 4.909 |
| 3/14/19 | 6.451 | 4.907 |
| 3/15/19 | 6.479 | 4.934 |
| 3/18/19 | 6.484 | 4.948 |
| 3/19/19 | 6.487 | 4.953 |
| 3/20/19 | 6.515 | 4.975 |
| 3/21/19 | 6.531 | 4.996 |
| 3/22/19 | 6.608 | 5.075 |
| 3/25/19 | 6.653 | 5.111 |
| 3/26/19 | 6.639 | 5.102 |
| 3/27/19 | 6.664 | 5.118 |
| 3/28/19 | 6.642 | 5.108 |
| 3/29/19 | 6.608 | 5.054 |
| 4/1/19 | 6.524 | 4.979 |
| 4/2/19 | 6.547 | 4.989 |
| 4/3/19 | 6.507 | 4.953 |
| 4/4/19 | 6.521 | 4.96 |
| 4/5/19 | 6.529 | 4.963 |
| 4/8/19 | 6.496 | 4.934 |
| 4/9/19 | 6.49 | 4.932 |
| 4/10/19 | 6.522 | 4.959 |
| 4/11/19 | 6.483 | 4.936 |
| 4/12/19 | 6.436 | 4.909 |
| 4/15/19 | 6.442 | 4.939 |
| 4/16/19 | 6.416 | 4.91 |
| 4/17/19 | 6.409 | 4.9 |
| 4/18/19 | 6.449 | 4.94 |
| 4/22/19 | 6.419 | 4.909 |
| 4/23/19 | 6.446 | 4.939 |
| 4/24/19 | 6.504 | 4.999 |
| 4/25/19 | 6.505 | 4.996 |
| 4/26/19 | 6.521 | 5.013 |
| 4/29/19 | 6.495 | 4.987 |
| 4/30/19 | 6.51 | 5.002 |
| 5/1/19 | 6.537 | 5.032 |
| 5/2/19 | 6.492 | 4.982 |
| 5/3/19 | 6.497 | 4.978 |
| 5/6/19 | 6.518 | 5.007 |
| 5/7/19 | 6.558 | 5.047 |
| 5/8/19 | 6.543 | 5.037 |
| 5/9/19 | 6.573 | 5.046 |
| 5/10/19 | 6.542 | 5.022 |
| 5/13/19 | 6.598 | 5.081 |
| 5/14/19 | 6.582 | 5.055 |
| 5/15/19 | 6.596 | 5.077 |
| 5/16/19 | 6.587 | 5.066 |
| 5/17/19 | 6.584 | 5.059 |
| 5/21/19 | 6.526 | 5.012 |
| 5/22/19 | 6.548 | 5.026 |
| 5/23/19 | 6.614 | 5.097 |
| 5/24/19 | 6.634 | 5.106 |
| 5/27/19 | 6.649 | 5.138 |
| 5/28/19 | 6.669 | 5.159 |
| 5/29/19 | 6.673 | 5.148 |
| 5/30/19 | 6.693 | 5.165 |
| 5/31/19 | 6.733 | 5.186 |
| 6/3/19 | 6.799 | 5.233 |
| 6/4/19 | 6.756 | 5.199 |
| 6/5/19 | 6.754 | 5.218 |
| 6/6/19 | 6.758 | 5.22 |
| 6/7/19 | 6.777 | 5.246 |
| 6/10/19 | 6.733 | 5.22 |
| 6/11/19 | 6.725 | 5.225 |
| 6/12/19 | 6.749 | 5.25 |
| 6/13/19 | 6.785 | 5.281 |
| 6/14/19 | 6.803 | 5.303 |
| 6/17/19 | 6.797 | 5.31 |
| 6/18/19 | 6.832 | 5.343 |
| 6/19/19 | 6.827 | 5.341 |
| 6/20/19 | 6.795 | 5.342 |
| 6/21/19 | 6.775 | 5.324 |
| 6/24/19 | 6.79 | 5.342 |
| 6/25/19 | 6.812 | 5.366 |
| 6/26/19 | 6.765 | 5.333 |
| 6/27/19 | 6.788 | 5.361 |
| 6/28/19 | 6.815 | 5.388 |
| 7/2/19 | 6.822 | 5.393 |
| 7/3/19 | 6.842 | 5.421 |
| 7/4/19 | 6.838 | 5.427 |
| 7/5/19 | 6.759 | 5.345 |
| 7/8/19 | 6.772 | 5.355 |
| 7/9/19 | 6.772 | 5.365 |
| 7/10/19 | 6.745 | 5.346 |
| 7/11/19 | 6.697 | 5.307 |
| 7/12/19 | 6.707 | 5.32 |
| 7/15/19 | 6.711 | 5.327 |
| 7/16/19 | 6.717 | 5.328 |
| 7/17/19 | 6.767 | 5.382 |
| 7/18/19 | 6.763 | 5.391 |
| 7/19/19 | 6.769 | 5.397 |
| 7/22/19 | 6.779 | 5.403 |
| 7/23/19 | 6.759 | 5.394 |
| 7/24/19 | 6.796 | 5.428 |
| 7/25/19 | 6.769 | 5.407 |
| 7/26/19 | 6.773 | 5.4 |
| 7/29/19 | 6.761 | 5.387 |
| 7/30/19 | 6.758 | 5.383 |
| 7/31/19 | 6.804 | 5.424 |
| 8/1/19 | 6.869 | 5.494 |
| 8/2/19 | 6.886 | 5.495 |
| 8/6/19 | 6.999 | 5.599 |
| 8/7/19 | 7.015 | 5.578 |
| 8/8/19 | 7.008 | 5.538 |
| 8/9/19 | 6.979 | 5.498 |
| 8/12/19 | 7.052 | 5.57 |
| 8/13/19 | 7.035 | 5.554 |
| 8/14/19 | 7.147 | 5.651 |
| 8/15/19 | 7.201 | 5.7 |
| 8/16/19 | 7.123 | 5.638 |
| 8/19/19 | 7.088 | 5.567 |
| 8/20/19 | 7.106 | 5.58 |
| 8/21/19 | 7.042 | 5.526 |
| 8/22/19 | 6.981 | 5.467 |
| 8/23/19 | 7.068 | 5.538 |
| 8/26/19 | 7.033 | 5.51 |
| 8/27/19 | 7.114 | 5.587 |
| 8/28/19 | 7.128 | 5.605 |
| 8/29/19 | 7.101 | 5.574 |
| 8/30/19 | 7.072 | 5.547 |
| 9/3/19 | 7.11 | 5.565 |
| 9/4/19 | 7.09 | 5.543 |
| 9/5/19 | 6.993 | 5.444 |
| 9/6/19 | 7.001 | 5.462 |
| 9/9/19 | 6.945 | 5.414 |
| 9/10/19 | 6.882 | 5.346 |
| 9/11/19 | 6.865 | 5.328 |
| 9/12/19 | 6.829 | 5.299 |
| 9/13/19 | 6.787 | 5.255 |
| 9/16/19 | 6.83 | 5.299 |
| 9/17/19 | 6.877 | 5.346 |
| 9/18/19 | 6.911 | 5.383 |
| 9/19/19 | 6.921 | 5.408 |
| 9/20/19 | 6.963 | 5.463 |
| 9/23/19 | 6.972 | 5.492 |
| 9/24/19 | 7.021 | 5.54 |
| 9/25/19 | 6.93 | 5.452 |
| 9/26/19 | 6.956 | 5.481 |
| 9/27/19 | 6.955 | 5.478 |
| 9/30/19 | 6.971 | 5.488 |
| 10/1/19 | 6.99 | 5.506 |
| 10/2/19 | 7.012 | 5.515 |
| 10/3/19 | 7.058 | 5.572 |
| 10/4/19 | 7.078 | 5.582 |
| 10/7/19 | 7.013 | 5.526 |
| 10/8/19 | 7.023 | 5.517 |
| 10/9/19 | 6.99 | 5.471 |
| 10/10/19 | 6.912 | 5.402 |
| 10/11/19 | 6.855 | 5.348 |
| 10/15/19 | 6.83 | 5.321 |
| 10/16/19 | 6.832 | 5.318 |
| 10/17/19 | 6.829 | 5.315 |
| 10/18/19 | 6.852 | 5.344 |
| 10/21/19 | 6.831 | 5.331 |
| 10/22/19 | 6.873 | 5.373 |
| 10/23/19 | 6.878 | 5.385 |
| 10/24/19 | 6.865 | 5.371 |
| 10/25/19 | 6.835 | 5.342 |
| 10/28/19 | 6.743 | 5.26 |
| 10/29/19 | 6.761 | 5.276 |
| 10/30/19 | 6.873 | 5.383 |
| 10/31/19 | 6.924 | 5.423 |
| 11/1/19 | 6.894 | 5.4 |
| 11/4/19 | 6.813 | 5.327 |
| 11/5/19 | 6.753 | 5.273 |
| 11/6/19 | 6.814 | 5.333 |
| 11/7/19 | 6.756 | 5.295 |
| 11/8/19 | 6.765 | 5.308 |
| 11/12/19 | 6.758 | 5.312 |
| 11/13/19 | 6.798 | 5.353 |
| 11/14/19 | 6.883 | 5.428 |
| 11/15/19 | 6.877 | 5.423 |
| 11/18/19 | 6.878 | 5.422 |
| 11/19/19 | 6.92 | 5.482 |
| 11/20/19 | 6.946 | 5.525 |
| 11/21/19 | 6.915 | 5.486 |
| 11/22/19 | 6.919 | 5.499 |
| 11/25/19 | 6.928 | 5.509 |
| 11/26/19 | 6.952 | 5.552 |
| 11/27/19 | 6.922 | 5.528 |
| 11/28/19 | 6.926 | 5.534 |
| 11/29/19 | 6.943 | 5.539 |
| 12/2/19 | 6.881 | 5.502 |
| 12/3/19 | 6.95 | 5.561 |
| 12/4/19 | 6.877 | 5.493 |
| 12/5/19 | 6.81 | 5.439 |
| 12/6/19 | 6.817 | 5.447 |
| 12/9/19 | 6.801 | 5.422 |
| 12/10/19 | 6.797 | 5.427 |
| 12/11/19 | 6.819 | 5.458 |
| 12/12/19 | 6.746 | 5.392 |
| 12/13/19 | 6.818 | 5.467 |
| 12/16/19 | 6.776 | 5.423 |
| 12/17/19 | 6.782 | 5.438 |
| 12/18/19 | 6.75 | 5.416 |
| 12/19/19 | 6.783 | 5.465 |
| 12/20/19 | 6.834 | 5.515 |
| 12/23/19 | 6.828 | 5.506 |
| 12/24/19 | 6.832 | 5.516 |
| 12/27/19 | 6.839 | 5.529 |
| 12/30/19 | 6.789 | 5.469 |
| 12/31/19 | 6.737 | 5.425 |
| 1/2/20 | 6.798 | 5.484 |
| 1/3/20 | 6.876 | 5.563 |
| 1/6/20 | 6.812 | 5.498 |
| 1/7/20 | 6.808 | 5.491 |
| 1/8/20 | 6.751 | 5.44 |
| 1/9/20 | 6.777 | 5.46 |
| 1/10/20 | 6.807 | 5.494 |
| 1/13/20 | 6.79 | 5.483 |
| 1/14/20 | 6.813 | 5.498 |
| 1/15/20 | 6.856 | 5.539 |
| 1/16/20 | 6.828 | 5.519 |
| 1/17/20 | 6.827 | 5.52 |
| 1/20/20 | 6.827 | 5.522 |
| 1/21/20 | 6.882 | 5.576 |
| 1/22/20 | 6.927 | 5.611 |
| 1/23/20 | 6.958 | 5.626 |
| 1/24/20 | 7.011 | 5.669 |
| 1/27/20 | 7.072 | 5.706 |
| 1/28/20 | 7.019 | 5.656 |
| 1/29/20 | 7.064 | 5.71 |
| 1/30/20 | 7.05 | 5.686 |
| 1/31/20 | 7.081 | 5.706 |
| 2/3/20 | 7.097 | 5.729 |
| 2/4/20 | 7.046 | 5.683 |
| 2/5/20 | 7.004 | 5.642 |
| 2/6/20 | 7.026 | 5.662 |
| 2/7/20 | 7.076 | 5.712 |
| 2/10/20 | 7.096 | 5.729 |
| 2/11/20 | 7.044 | 5.681 |
| 2/12/20 | 7.001 | 5.639 |
| 2/13/20 | 7.004 | 5.638 |
| 2/14/20 | 7.026 | 5.659 |
| 2/18/20 | 7.061 | 5.694 |
| 2/19/20 | 7.048 | 5.685 |
| 2/20/20 | 7.092 | 5.728 |
| 2/21/20 | 7.13 | 5.768 |
| 2/24/20 | 7.201 | 5.809 |
| 2/25/20 | 7.192 | 5.779 |
| 2/26/20 | 7.157 | 5.729 |
| 2/27/20 | 7.195 | 5.73 |
| 2/28/20 | 7.206 | 5.675 |
| 3/2/20 | 7.163 | 5.623 |
| 3/3/20 | 7.28 | 5.73 |
| 3/4/20 | 7.224 | 5.671 |
| 3/5/20 | 7.328 | 5.771 |
| 3/6/20 | 7.536 | 5.881 |
| 3/9/20 | 7.794 | 5.945 |
| 3/10/20 | 7.614 | 5.799 |
| 3/11/20 | 7.482 | 5.623 |
| 3/12/20 | 7.35 | 5.367 |
| 3/13/20 | 7.208 | 5.209 |
| 3/16/20 | 7.227 | 5.213 |
| 3/17/20 | 7.11 | 5.085 |
| 3/18/20 | 7.013 | 4.91 |
| 3/19/20 | 7.073 | 4.877 |
| 3/20/20 | 7.202 | 4.936 |
| 3/23/20 | 7.234 | 4.977 |
| 3/24/20 | 7.176 | 4.931 |
| 3/25/20 | 7.129 | 4.914 |
| 3/26/20 | 7.144 | 4.928 |
| 3/27/20 | 7.209 | 5.046 |
| 3/30/20 | 7.166 | 5.028 |
| 3/31/20 | 7.167 | 5.066 |
| 4/1/20 | 7.263 | 5.176 |
| 4/2/20 | 7.259 | 5.184 |
| 4/3/20 | 7.261 | 5.166 |
| 4/6/20 | 7.216 | 5.152 |
| 4/7/20 | 7.151 | 5.093 |
| 4/8/20 | 7.136 | 5.094 |
| 4/9/20 | 7.149 | 5.225 |
| 4/13/20 | 7.157 | 5.324 |
| 4/14/20 | 7.079 | 5.302 |
| 4/15/20 | 7.159 | 5.521 |
| 4/16/20 | 7.221 | 5.594 |
| 4/17/20 | 7.187 | 5.538 |
| 4/20/20 | 7.193 | 5.533 |
| 4/21/20 | 7.254 | 5.543 |
| 4/22/20 | 7.248 | 5.494 |
| 4/23/20 | 7.282 | 5.507 |
| 4/24/20 | 7.295 | 5.521 |
| 4/27/20 | 7.27 | 5.499 |
| 4/28/20 | 7.312 | 5.55 |
| 4/29/20 | 7.328 | 5.568 |
| 4/30/20 | 7.357 | 5.609 |
| 5/1/20 | 7.403 | 5.658 |
| 5/4/20 | 7.363 | 5.617 |
| 5/5/20 | 7.374 | 5.631 |
| 5/6/20 | 7.32 | 5.593 |
| 5/7/20 | 7.358 | 5.618 |
| 5/8/20 | 7.312 | 5.582 |
| 5/11/20 | 7.287 | 5.542 |
| 5/12/20 | 7.328 | 5.548 |
| 5/13/20 | 7.36 | 5.536 |
| 5/14/20 | 7.408 | 5.494 |
| 5/15/20 | 7.4 | 5.473 |
| 5/19/20 | 7.332 | 5.428 |
| 5/20/20 | 7.37 | 5.489 |
| 5/21/20 | 7.378 | 5.51 |
| 5/22/20 | 7.408 | 5.549 |
| 5/25/20 | 7.44 | 5.601 |
| 5/26/20 | 7.394 | 5.572 |
| 5/27/20 | 7.379 | 5.571 |
| 5/28/20 | 7.338 | 5.546 |
| 5/29/20 | 7.364 | 5.599 |
| 6/1/20 | 7.357 | 5.646 |
| 6/2/20 | 7.342 | 5.685 |
| 6/3/20 | 7.273 | 5.684 |
| 6/4/20 | 7.222 | 5.665 |
| 6/5/20 | 7.169 | 5.642 |
| 6/8/20 | 7.226 | 5.71 |
| 6/9/20 | 7.282 | 5.754 |
| 6/10/20 | 7.362 | 5.809 |
| 6/11/20 | 7.416 | 5.771 |
| 6/12/20 | 7.422 | 5.775 |
| 6/15/20 | 7.469 | 5.843 |
| 6/16/20 | 7.424 | 5.838 |
| 6/17/20 | 7.452 | 5.867 |
| 6/18/20 | 7.478 | 5.887 |
| 6/19/20 | 7.48 | 5.89 |
| 6/22/20 | 7.489 | 5.907 |
| 6/23/20 | 7.47 | 5.895 |
| 6/24/20 | 7.455 | 5.871 |
| 6/25/20 | 7.469 | 5.878 |
| 6/26/20 | 7.494 | 5.906 |
| 6/29/20 | 7.498 | 5.914 |
| 6/30/20 | 7.495 | 5.917 |
| 7/2/20 | 7.472 | 5.912 |
| 7/3/20 | 7.477 | 5.925 |
| 7/6/20 | 7.467 | 5.931 |
| 7/7/20 | 7.491 | 5.964 |
| 7/8/20 | 7.38 | 5.863 |
| 7/9/20 | 7.416 | 5.914 |
| 7/10/20 | 7.412 | 5.893 |
| 7/13/20 | 7.423 | 5.906 |
| 7/14/20 | 7.439 | 5.924 |
| 7/15/20 | 7.445 | 5.946 |
| 7/16/20 | 7.493 | 5.997 |
| 7/17/20 | 7.484 | 5.996 |
| 7/20/20 | 7.509 | 6.032 |
| 7/21/20 | 7.501 | 6.036 |
| 7/22/20 | 7.484 | 6.022 |
| 7/23/20 | 7.491 | 6.047 |
| 7/24/20 | 7.515 | 6.082 |
| 7/27/20 | 7.497 | 6.063 |
| 7/28/20 | 7.544 | 6.104 |
| 7/29/20 | 7.53 | 6.092 |
| 7/30/20 | 7.564 | 6.118 |
| 7/31/20 | 7.56 | 6.118 |
| 8/4/20 | 7.598 | 6.155 |
| 8/5/20 | 7.542 | 6.124 |
| 8/6/20 | 7.566 | 6.152 |
| 8/7/20 | 7.537 | 6.123 |
| 8/10/20 | 7.508 | 6.101 |
| 8/11/20 | 7.426 | 6.03 |
| 8/12/20 | 7.39 | 5.991 |
| 8/13/20 | 7.342 | 5.937 |
| 8/14/20 | 7.355 | 5.94 |
| 8/17/20 | 7.39 | 5.969 |
| 8/18/20 | 7.418 | 5.992 |
| 8/19/20 | 7.389 | 5.965 |
| 8/20/20 | 7.405 | 5.978 |
| 8/21/20 | 7.414 | 5.989 |
| 8/24/20 | 7.409 | 5.969 |
| 8/25/20 | 7.387 | 5.952 |
| 8/26/20 | 7.362 | 5.921 |
| 8/27/20 | 7.296 | 5.852 |
| 8/28/20 | 7.294 | 5.855 |
| 8/31/20 | 7.32 | 5.877 |
| 9/1/20 | 7.381 | 5.948 |
| 9/2/20 | 7.428 | 6 |
| 9/3/20 | 7.441 | 6.005 |
| 9/4/20 | 7.383 | 5.952 |
| 9/8/20 | 7.405 | 5.952 |
| 9/9/20 | 7.381 | 5.936 |
| 9/10/20 | 7.406 | 5.96 |
| 9/11/20 | 7.425 | 5.979 |
| 9/14/20 | 7.421 | 5.98 |
| 9/15/20 | 7.4 | 5.966 |
| 9/16/20 | 7.376 | 5.941 |
| 9/17/20 | 7.397 | 5.95 |
| 9/18/20 | 7.385 | 5.938 |
| 9/21/20 | 7.406 | 5.946 |
| 9/22/20 | 7.399 | 5.926 |
| 9/23/20 | 7.403 | 5.931 |
| 9/24/20 | 7.406 | 5.914 |
| 9/25/20 | 7.412 | 5.906 |
| 9/28/20 | 7.393 | 5.877 |
| 9/29/20 | 7.402 | 5.889 |
| 9/30/20 | 7.373 | 5.835 |
| 10/1/20 | 7.382 | 5.845 |
| 10/2/20 | 7.372 | 5.845 |
| 10/5/20 | 7.305 | 5.782 |
| 10/6/20 | 7.341 | 5.828 |
| 10/7/20 | 7.285 | 5.778 |
| 10/8/20 | 7.285 | 5.789 |
| 10/9/20 | 7.254 | 5.768 |
| 10/13/20 | 7.292 | 5.806 |
| 10/14/20 | 7.307 | 5.821 |
| 10/15/20 | 7.331 | 5.834 |
| 10/16/20 | 7.321 | 5.825 |
| 10/19/20 | 7.312 | 5.813 |
| 10/20/20 | 7.267 | 5.764 |
| 10/21/20 | 7.27 | 5.762 |
| 10/22/20 | 7.23 | 5.725 |
| 10/23/20 | 7.246 | 5.738 |
| 10/26/20 | 7.27 | 5.751 |
| 10/27/20 | 7.289 | 5.767 |
| 10/28/20 | 7.307 | 5.778 |
| 10/29/20 | 7.267 | 5.726 |
| 10/30/20 | 7.229 | 5.684 |
| 11/2/20 | 7.254 | 5.705 |
| 11/3/20 | 7.212 | 5.668 |
| 11/4/20 | 7.294 | 5.763 |
| 11/5/20 | 7.287 | 5.799 |
| 11/6/20 | 7.262 | 5.785 |
| 11/9/20 | 7.162 | 5.744 |
| 11/10/20 | 7.157 | 5.739 |
| 11/12/20 | 7.205 | 5.787 |
| 11/13/20 | 7.204 | 5.781 |
| 11/16/20 | 7.191 | 5.767 |
| 11/17/20 | 7.236 | 5.81 |
| 11/18/20 | 7.235 | 5.81 |
| 11/19/20 | 7.269 | 5.843 |
| 11/20/20 | 7.314 | 5.888 |
| 11/23/20 | 7.294 | 5.868 |
| 11/24/20 | 7.265 | 5.858 |
| 11/25/20 | 7.263 | 5.866 |
| 11/26/20 | 7.276 | 5.886 |
| 11/27/20 | 7.295 | 5.904 |
| 11/30/20 | 7.312 | 5.932 |
| 12/1/20 | 7.257 | 5.886 |
| 12/2/20 | 7.206 | 5.856 |
| 12/3/20 | 7.225 | 5.903 |
| 12/4/20 | 7.144 | 5.83 |
| 12/7/20 | 7.178 | 5.863 |
| 12/8/20 | 7.193 | 5.873 |
| 12/9/20 | 7.186 | 5.859 |
| 12/10/20 | 7.211 | 5.87 |
| 12/11/20 | 7.218 | 5.865 |
| 12/14/20 | 7.202 | 5.843 |
| 12/15/20 | 7.194 | 5.823 |
| 12/16/20 | 7.187 | 5.821 |
| 12/17/20 | 7.184 | 5.836 |
| 12/18/20 | 7.194 | 5.855 |
| 12/21/20 | 7.205 | 5.856 |
| 12/22/20 | 7.235 | 5.885 |
| 12/23/20 | 7.206 | 5.86 |
| 12/24/20 | 7.223 | 5.877 |
| 12/29/20 | 7.235 | 5.898 |
| 12/30/20 | 7.24 | 5.91 |
| 12/31/20 | 7.274 | 5.946 |
| 1/4/21 | 7.262 | 5.95 |
| 1/5/21 | 7.204 | 5.89 |
| 1/6/21 | 7.121 | 5.813 |
| 1/7/21 | 7.088 | 5.799 |
| 1/8/21 | 7.061 | 5.806 |
| 1/11/21 | 7.032 | 5.782 |
| 1/12/21 | 7.017 | 5.768 |
| 1/13/21 | 7.053 | 5.799 |
| 1/14/21 | 7.004 | 5.757 |
| 1/15/21 | 7.05 | 5.803 |
| 1/18/21 | 7.05 | 5.801 |
| 1/19/21 | 7.044 | 5.811 |
| 1/20/21 | 7.022 | 5.798 |
| 1/21/21 | 6.993 | 5.776 |
| 1/22/21 | 7.021 | 5.781 |
| 1/25/21 | 7.044 | 5.797 |
| 1/26/21 | 7.026 | 5.774 |
| 1/27/21 | 7.036 | 5.765 |
| 1/28/21 | 7.015 | 5.741 |
| 1/29/21 | 7.019 | 5.744 |
| 2/1/21 | 7.02 | 5.755 |
| 2/2/21 | 7.003 | 5.744 |
| 2/3/21 | 6.97 | 5.712 |
| 2/4/21 | 6.943 | 5.689 |
| 2/5/21 | 6.904 | 5.659 |
| 2/8/21 | 6.903 | 5.665 |
| 2/9/21 | 6.912 | 5.673 |
| 2/10/21 | 6.913 | 5.677 |
| 2/11/21 | 6.902 | 5.665 |
| 2/12/21 | 6.858 | 5.62 |
| 2/16/21 | 6.783 | 5.56 |
| 2/17/21 | 6.804 | 5.562 |
| 2/18/21 | 6.771 | 5.53 |
| 2/19/21 | 6.702 | 5.465 |
| 2/22/21 | 6.68 | 5.439 |
| 2/23/21 | 6.638 | 5.398 |
| 2/24/21 | 6.61 | 5.375 |
| 2/25/21 | 6.588 | 5.344 |
| 2/26/21 | 6.752 | 5.484 |
| 3/1/21 | 6.741 | 5.471 |
| 3/2/21 | 6.717 | 5.456 |
| 3/3/21 | 6.685 | 5.406 |
| 3/4/21 | 6.601 | 5.317 |
| 3/5/21 | 6.626 | 5.316 |
| 3/8/21 | 6.593 | 5.294 |
| 3/9/21 | 6.665 | 5.364 |
| 3/10/21 | 6.661 | 5.366 |
| 3/11/21 | 6.617 | 5.327 |
| 3/12/21 | 6.477 | 5.172 |
| 3/15/21 | 6.505 | 5.192 |
| 3/16/21 | 6.477 | 5.143 |
| 3/17/21 | 6.427 | 5.086 |
| 3/18/21 | 6.421 | 5.089 |
| 3/19/21 | 6.454 | 5.105 |
| 3/22/21 | 6.485 | 5.148 |
| 3/23/21 | 6.546 | 5.218 |
| 3/24/21 | 6.585 | 5.268 |
| 3/25/21 | 6.582 | 5.269 |
| 3/26/21 | 6.551 | 5.239 |
| 3/29/21 | 6.507 | 5.192 |
| 3/30/21 | 6.546 | 5.22 |
| 3/31/21 | 6.53 | 5.213 |
| 4/1/21 | 6.552 | 5.249 |
| 4/5/21 | 6.527 | 5.23 |
| 4/6/21 | 6.588 | 5.287 |
| 4/7/21 | 6.561 | 5.265 |
| 4/8/21 | 6.597 | 5.3 |
| 4/9/21 | 6.582 | 5.287 |
| 4/12/21 | 6.568 | 5.277 |
| 4/13/21 | 6.576 | 5.282 |
| 4/14/21 | 6.544 | 5.252 |
| 4/15/21 | 6.613 | 5.313 |
| 4/16/21 | 6.522 | 5.232 |
| 4/19/21 | 6.479 | 5.204 |
| 4/20/21 | 6.495 | 5.199 |
| 4/21/21 | 6.494 | 5.163 |
| 4/22/21 | 6.473 | 5.154 |
| 4/23/21 | 6.451 | 5.138 |
| 4/26/21 | 6.437 | 5.132 |
| 4/27/21 | 6.401 | 5.08 |
| 4/28/21 | 6.434 | 5.109 |
| 4/29/21 | 6.413 | 5.097 |
| 4/30/21 | 6.428 | 5.102 |
| 5/3/21 | 6.438 | 5.112 |
| 5/4/21 | 6.437 | 5.107 |
| 5/5/21 | 6.459 | 5.128 |
| 5/6/21 | 6.43 | 5.108 |
| 5/7/21 | 6.443 | 5.118 |
| 5/10/21 | 6.389 | 5.067 |
| 5/11/21 | 6.363 | 5.039 |
| 5/12/21 | 6.316 | 4.989 |
| 5/13/21 | 6.331 | 4.982 |
| 5/14/21 | 6.328 | 4.993 |
| 5/17/21 | 6.318 | 4.984 |
| 5/18/21 | 6.327 | 4.985 |
| 5/19/21 | 6.324 | 4.979 |
| 5/20/21 | 6.358 | 5.017 |
| 5/21/21 | 6.352 | 5.018 |
| 5/25/21 | 6.438 | 5.104 |
| 5/26/21 | 6.465 | 5.135 |
| 5/27/21 | 6.453 | 5.125 |
| 5/28/21 | 6.476 | 5.15 |
| 5/31/21 | 6.47 | 5.146 |
| 6/1/21 | 6.469 | 5.149 |
| 6/2/21 | 6.48 | 5.162 |
| 6/3/21 | 6.464 | 5.148 |
| 6/4/21 | 6.522 | 5.204 |
| 6/7/21 | 6.505 | 5.193 |
| 6/8/21 | 6.524 | 5.21 |
| 6/9/21 | 6.554 | 5.236 |
| 6/10/21 | 6.556 | 5.24 |
| 6/11/21 | 6.564 | 5.244 |
| 6/14/21 | 6.547 | 5.231 |
| 6/15/21 | 6.562 | 5.24 |
| 6/16/21 | 6.553 | 5.219 |
| 6/17/21 | 6.626 | 5.29 |
| 6/18/21 | 6.697 | 5.364 |
| 6/21/21 | 6.645 | 5.321 |
| 6/22/21 | 6.643 | 5.315 |
| 6/23/21 | 6.653 | 5.317 |
| 6/24/21 | 6.663 | 5.326 |
| 6/25/21 | 6.606 | 5.269 |
| 6/28/21 | 6.63 | 5.294 |
| 6/29/21 | 6.626 | 5.297 |
| 6/30/21 | 6.657 | 5.328 |
| 7/2/21 | 6.661 | 5.335 |
| 7/5/21 | 6.659 | 5.334 |
| 7/6/21 | 6.714 | 5.392 |
| 7/7/21 | 6.736 | 5.413 |
| 7/8/21 | 6.762 | 5.447 |
| 7/9/21 | 6.68 | 5.359 |
| 7/12/21 | 6.674 | 5.357 |
| 7/13/21 | 6.649 | 5.333 |
| 7/14/21 | 6.694 | 5.372 |
| 7/15/21 | 6.718 | 5.4 |
| 7/16/21 | 6.723 | 5.41 |
| 7/19/21 | 6.808 | 5.474 |
| 7/20/21 | 6.745 | 5.415 |
| 7/21/21 | 6.693 | 5.366 |
| 7/22/21 | 6.734 | 5.407 |
| 7/23/21 | 6.712 | 5.392 |
| 7/26/21 | 6.702 | 5.385 |
| 7/27/21 | 6.758 | 5.433 |
| 7/28/21 | 6.768 | 5.444 |
| 7/29/21 | 6.75 | 5.425 |
| 7/30/21 | 6.733 | 5.406 |
| 8/3/21 | 6.798 | 5.473 |
| 8/4/21 | 6.793 | 5.465 |
| 8/5/21 | 6.791 | 5.463 |
| 8/6/21 | 6.733 | 5.404 |
| 8/9/21 | 6.704 | 5.373 |
| 8/10/21 | 6.69 | 5.364 |
| 8/11/21 | 6.674 | 5.344 |
| 8/12/21 | 6.678 | 5.35 |
| 8/13/21 | 6.739 | 5.404 |
| 8/16/21 | 6.754 | 5.424 |
| 8/17/21 | 6.747 | 5.423 |
| 8/18/21 | 6.752 | 5.421 |
| 8/19/21 | 6.779 | 5.447 |
| 8/20/21 | 6.77 | 5.437 |
| 8/23/21 | 6.748 | 5.423 |
| 8/24/21 | 6.725 | 5.394 |
| 8/25/21 | 6.677 | 5.34 |
| 8/26/21 | 6.717 | 5.376 |
| 8/27/21 | 6.745 | 5.411 |
| 8/30/21 | 6.752 | 5.419 |
| 8/31/21 | 6.698 | 5.364 |
| 9/1/21 | 6.757 | 5.421 |
| 9/2/21 | 6.777 | 5.441 |
| 9/3/21 | 6.742 | 5.405 |
| 9/7/21 | 6.701 | 5.369 |
| 9/8/21 | 6.719 | 5.38 |
| 9/9/21 | 6.757 | 5.42 |
| 9/10/21 | 6.693 | 5.346 |
| 9/13/21 | 6.709 | 5.36 |
| 9/14/21 | 6.758 | 5.41 |
| 9/15/21 | 6.725 | 5.379 |
| 9/16/21 | 6.721 | 5.368 |
| 9/17/21 | 6.671 | 5.324 |
| 9/20/21 | 6.734 | 5.372 |
| 9/21/21 | 6.71 | 5.352 |
| 9/22/21 | 6.741 | 5.384 |
| 9/23/21 | 6.666 | 5.317 |
| 9/24/21 | 6.595 | 5.241 |
| 9/27/21 | 6.583 | 5.231 |
| 9/28/21 | 6.531 | 5.173 |
| 9/29/21 | 6.512 | 5.162 |
| 10/1/21 | 6.543 | 5.186 |
| 10/4/21 | 6.532 | 5.186 |
| 10/5/21 | 6.489 | 5.144 |
| 10/6/21 | 6.51 | 5.16 |
| 10/7/21 | 6.461 | 5.115 |
| 10/8/21 | 6.411 | 5.064 |
| 10/12/21 | 6.447 | 5.096 |
| 10/13/21 | 6.482 | 5.13 |
| 10/14/21 | 6.532 | 5.188 |
| 10/15/21 | 6.51 | 5.178 |
| 10/18/21 | 6.537 | 5.201 |
| 10/19/21 | 6.494 | 5.163 |
| 10/20/21 | 6.467 | 5.138 |
| 10/21/21 | 6.422 | 5.095 |
| 10/22/21 | 6.453 | 5.127 |
| 10/25/21 | 6.445 | 5.12 |
| 10/26/21 | 6.49 | 5.166 |
| 10/27/21 | 6.576 | 5.257 |
| 10/28/21 | 6.551 | 5.223 |
| 10/29/21 | 6.473 | 5.148 |
| 11/1/21 | 6.467 | 5.145 |
| 11/2/21 | 6.45 | 5.124 |
| 11/3/21 | 6.452 | 5.124 |
| 11/4/21 | 6.492 | 5.17 |
| 11/5/21 | 6.543 | 5.228 |
| 11/8/21 | 6.52 | 5.205 |
| 11/9/21 | 6.553 | 5.238 |
| 11/10/21 | 6.482 | 5.171 |
| 11/12/21 | 6.47 | 5.158 |
| 11/15/21 | 6.428 | 5.108 |
| 11/16/21 | 6.387 | 5.069 |
| 11/17/21 | 6.446 | 5.125 |
| 11/18/21 | 6.453 | 5.128 |
| 11/19/21 | 6.499 | 5.168 |
| 11/22/21 | 6.401 | 5.102 |
| 11/23/21 | 6.358 | 5.046 |
| 11/24/21 | 6.434 | 5.098 |
| 11/25/21 | 6.429 | 5.085 |
| 11/26/21 | 6.553 | 5.204 |
| 11/29/21 | 6.557 | 5.194 |
| 11/30/21 | 6.598 | 5.212 |
| 12/1/21 | 6.677 | 5.291 |
| 12/2/21 | 6.702 | 5.312 |
| 12/3/21 | 6.758 | 5.368 |
| 12/6/21 | 6.707 | 5.312 |
| 12/7/21 | 6.672 | 5.297 |
| 12/8/21 | 6.655 | 5.278 |
| 12/9/21 | 6.678 | 5.303 |
| 12/10/21 | 6.695 | 5.324 |
| 12/13/21 | 6.749 | 5.374 |
| 12/14/21 | 6.704 | 5.34 |
| 12/15/21 | 6.754 | 5.381 |
| 12/16/21 | 6.8 | 5.43 |
| 12/17/21 | 6.832 | 5.455 |
| 12/20/21 | 6.759 | 5.367 |
| 12/21/21 | 6.733 | 5.346 |
| 12/22/21 | 6.768 | 5.385 |
| 12/23/21 | 6.736 | 5.357 |
| 12/24/21 | 6.732 | 5.354 |
| 12/29/21 | 6.735 | 5.361 |
| 12/30/21 | 6.783 | 5.41 |
| 12/31/21 | 6.819 | 5.449 |
| 1/4/22 | 6.668 | 5.318 |
| 1/5/22 | 6.644 | 5.279 |
| 1/6/22 | 6.567 | 5.201 |
| 1/7/22 | 6.525 | 5.155 |
| 1/10/22 | 6.539 | 5.164 |
| 1/11/22 | 6.542 | 5.16 |
| 1/12/22 | 6.512 | 5.132 |
| 1/13/22 | 6.534 | 5.156 |
| 1/14/22 | 6.485 | 5.102 |
| 1/17/22 | 6.461 | 5.076 |
| 1/18/22 | 6.398 | 4.997 |
| 1/19/22 | 6.417 | 5.022 |
| 1/20/22 | 6.442 | 5.037 |
| 1/21/22 | 6.505 | 5.098 |
| 1/24/22 | 6.453 | 5.036 |
| 1/25/22 | 6.443 | 5.017 |
| 1/26/22 | 6.428 | 4.997 |
| 1/27/22 | 6.505 | 5.054 |
| 1/28/22 | 6.496 | 5.031 |
| 1/31/22 | 6.445 | 4.961 |
| 2/1/22 | 6.416 | 4.933 |
| 2/2/22 | 6.453 | 4.974 |
| 2/3/22 | 6.425 | 4.942 |
| 2/4/22 | 6.398 | 4.902 |
| 2/7/22 | 6.401 | 4.9 |
| 2/8/22 | 6.365 | 4.852 |
| 2/9/22 | 6.357 | 4.846 |
| 2/10/22 | 6.286 | 4.775 |
| 2/11/22 | 6.364 | 4.831 |
| 2/14/22 | 6.306 | 4.765 |
| 2/15/22 | 6.268 | 4.736 |
| 2/16/22 | 6.293 | 4.76 |
| 2/17/22 | 6.324 | 4.787 |
| 2/18/22 | 6.343 | 4.798 |
| 2/22/22 | 6.313 | 4.767 |
| 2/23/22 | 6.26 | 4.712 |
| 2/24/22 | 6.3 | 4.729 |
| 2/25/22 | 6.332 | 4.762 |
| 2/28/22 | 6.376 | 4.809 |
| 3/1/22 | 6.505 | 4.935 |
| 3/2/22 | 6.429 | 4.858 |
| 3/3/22 | 6.471 | 4.872 |
| 3/4/22 | 6.538 | 4.912 |
| 3/7/22 | 6.469 | 4.83 |
| 3/8/22 | 6.374 | 4.715 |
| 3/9/22 | 6.303 | 4.643 |
| 3/10/22 | 6.257 | 4.604 |
| 3/11/22 | 6.212 | 4.557 |
| 3/14/22 | 6.069 | 4.411 |
| 3/15/22 | 6.01 | 4.348 |
| 3/16/22 | 6.122 | 4.48 |
| 3/17/22 | 6.098 | 4.491 |
| 3/18/22 | 6.118 | 4.531 |
| 3/21/22 | 6.031 | 4.451 |
| 3/22/22 | 5.934 | 4.359 |
| 3/23/22 | 6.063 | 4.493 |
| 3/24/22 | 6.034 | 4.472 |
| 3/25/22 | 5.946 | 4.39 |
| 3/28/22 | 6.019 | 4.47 |
| 3/29/22 | 6.042 | 4.513 |
| 3/30/22 | 6.089 | 4.556 |
| 3/31/22 | 6.116 | 4.592 |
| 4/1/22 | 6.124 | 4.596 |
| 4/4/22 | 6.133 | 4.603 |
| 4/5/22 | 6.049 | 4.521 |
| 4/6/22 | 6.047 | 4.51 |
| 4/7/22 | 5.983 | 4.444 |
| 4/8/22 | 5.926 | 4.384 |
| 4/11/22 | 5.849 | 4.288 |
| 4/12/22 | 5.887 | 4.318 |
| 4/13/22 | 5.888 | 4.309 |
| 4/14/22 | 5.786 | 4.173 |
| 4/18/22 | 5.758 | 4.132 |
| 4/19/22 | 5.726 | 4.097 |
| 4/20/22 | 5.735 | 4.102 |
| 4/21/22 | 5.68 | 4.021 |
| 4/22/22 | 5.68 | 4.003 |
| 4/25/22 | 5.718 | 4.031 |
| 4/26/22 | 5.778 | 4.087 |
| 4/27/22 | 5.713 | 3.995 |
| 4/28/22 | 5.755 | 4.052 |
| 4/29/22 | 5.688 | 3.981 |
| 5/2/22 | 5.633 | 3.912 |
| 5/3/22 | 5.618 | 3.903 |
| 5/4/22 | 5.663 | 3.963 |
| 5/5/22 | 5.553 | 3.842 |
| 5/6/22 | 5.463 | 3.75 |
| 5/9/22 | 5.528 | 3.798 |
| 5/10/22 | 5.531 | 3.804 |
| 5/11/22 | 5.55 | 3.841 |
| 5/12/22 | 5.593 | 3.888 |
| 5/13/22 | 5.566 | 3.855 |
| 5/16/22 | 5.582 | 3.868 |
| 5/17/22 | 5.483 | 3.768 |
| 5/18/22 | 5.582 | 3.862 |
| 5/19/22 | 5.636 | 3.898 |
| 5/20/22 | 5.686 | 3.948 |
| 5/24/22 | 5.712 | 3.969 |
| 5/25/22 | 5.738 | 4 |
| 5/26/22 | 5.685 | 3.957 |
| 5/27/22 | 5.703 | 3.974 |
| 5/30/22 | 5.702 | 3.978 |
| 5/31/22 | 5.65 | 3.922 |
| 6/1/22 | 5.623 | 3.909 |
| 6/2/22 | 5.602 | 3.903 |
| 6/3/22 | 5.546 | 3.853 |
| 6/6/22 | 5.41 | 3.734 |
| 6/7/22 | 5.389 | 3.719 |
| 6/8/22 | 5.32 | 3.651 |
| 6/9/22 | 5.358 | 3.696 |
| 6/10/22 | 5.307 | 3.629 |
| 6/13/22 | 5.196 | 3.489 |
| 6/14/22 | 5.1 | 3.389 |
| 6/15/22 | 5.145 | 3.443 |
| 6/16/22 | 5.214 | 3.498 |
| 6/17/22 | 5.193 | 3.482 |
| 6/20/22 | 5.189 | 3.48 |
| 6/21/22 | 5.097 | 3.399 |
| 6/22/22 | 5.163 | 3.468 |
| 6/23/22 | 5.226 | 3.529 |
| 6/24/22 | 5.2 | 3.501 |
| 6/27/22 | 5.151 | 3.451 |
| 6/28/22 | 5.208 | 3.506 |
| 6/29/22 | 5.291 | 3.588 |
| 6/30/22 | 5.36 | 3.65 |
| 7/4/22 | 5.392 | 3.685 |
| 7/5/22 | 5.455 | 3.738 |
| 7/6/22 | 5.39 | 3.675 |
| 7/7/22 | 5.355 | 3.649 |
| 7/8/22 | 5.319 | 3.615 |
| 7/11/22 | 5.354 | 3.663 |
| 7/12/22 | 5.394 | 3.708 |
| 7/13/22 | 5.453 | 3.772 |
| 7/14/22 | 5.435 | 3.755 |
| 7/15/22 | 5.478 | 3.812 |
| 7/18/22 | 5.45 | 3.798 |
| 7/19/22 | 5.459 | 3.824 |
| 7/20/22 | 5.457 | 3.828 |
| 7/21/22 | 5.58 | 3.955 |
| 7/22/22 | 5.677 | 4.056 |
| 7/25/22 | 5.645 | 4.023 |
| 7/26/22 | 5.671 | 4.046 |
| 7/27/22 | 5.662 | 4.039 |
| 7/28/22 | 5.743 | 4.119 |
| 7/29/22 | 5.725 | 4.106 |
| 8/2/22 | 5.668 | 4.043 |
| 8/3/22 | 5.721 | 4.114 |
| 8/4/22 | 5.73 | 4.131 |
| 8/5/22 | 5.682 | 4.081 |
| 8/8/22 | 5.736 | 4.141 |
| 8/9/22 | 5.717 | 4.117 |
| 8/10/22 | 5.726 | 4.144 |
| 8/11/22 | 5.612 | 4.035 |
| 8/12/22 | 5.649 | 4.07 |
| 8/15/22 | 5.651 | 4.066 |
| 8/16/22 | 5.665 | 4.072 |
| 8/17/22 | 5.601 | 4.019 |
| 8/18/22 | 5.609 | 4.026 |
| 8/19/22 | 5.564 | 3.969 |
| 8/22/22 | 5.499 | 3.903 |
| 8/23/22 | 5.474 | 3.875 |
| 8/24/22 | 5.431 | 3.834 |
| 8/25/22 | 5.496 | 3.902 |
| 8/26/22 | 5.517 | 3.917 |
| 8/29/22 | 5.479 | 3.877 |
| 8/30/22 | 5.517 | 3.915 |
| 8/31/22 | 5.472 | 3.873 |
| 9/1/22 | 5.396 | 3.802 |
| 9/2/22 | 5.464 | 3.856 |
| 9/6/22 | 5.345 | 3.747 |
| 9/7/22 | 5.372 | 3.77 |
| 9/8/22 | 5.294 | 3.692 |
| 9/9/22 | 5.35 | 3.746 |
| 9/12/22 | 5.334 | 3.728 |
| 9/13/22 | 5.339 | 3.726 |
| 9/14/22 | 5.395 | 3.782 |
| 9/15/22 | 5.445 | 3.824 |
| 9/16/22 | 5.422 | 3.789 |
| 9/19/22 | 5.45 | 3.82 |
| 9/20/22 | 5.47 | 3.834 |
| 9/21/22 | 5.55 | 3.905 |
| 9/22/22 | 5.493 | 3.85 |
| 9/23/22 | 5.53 | 3.839 |
| 9/26/22 | 5.461 | 3.737 |
| 9/27/22 | 5.316 | 3.574 |
| 9/28/22 | 5.534 | 3.785 |
| 9/29/22 | 5.398 | 3.585 |
| 10/3/22 | 5.348 | 3.56 |
| 10/4/22 | 5.366 | 3.587 |
| 10/5/22 | 5.274 | 3.493 |
| 10/6/22 | 5.265 | 3.491 |
| 10/7/22 | 5.235 | 3.465 |
| 10/11/22 | 5.132 | 3.361 |
| 10/12/22 | 5.108 | 3.338 |
| 10/13/22 | 5.15 | 3.387 |
| 10/14/22 | 5.072 | 3.309 |
| 10/17/22 | 5.069 | 3.298 |
| 10/18/22 | 5.133 | 3.362 |
| 10/19/22 | 4.95 | 3.174 |
| 10/20/22 | 4.834 | 3.055 |
| 10/21/22 | 4.789 | 3.008 |
| 10/24/22 | 4.833 | 3.042 |
| 10/25/22 | 4.903 | 3.109 |
| 10/26/22 | 5.063 | 3.258 |
| 10/27/22 | 5.174 | 3.369 |
| 10/28/22 | 5.185 | 3.385 |
| 10/31/22 | 5.174 | 3.391 |
| 11/1/22 | 5.233 | 3.463 |
| 11/2/22 | 5.153 | 3.416 |
| 11/3/22 | 5.091 | 3.354 |
| 11/4/22 | 4.978 | 3.249 |
| 11/7/22 | 4.857 | 3.118 |
| 11/8/22 | 4.964 | 3.222 |
| 11/9/22 | 5.015 | 3.276 |
| 11/10/22 | 5.216 | 3.476 |
| 11/14/22 | 5.22 | 3.484 |
| 11/15/22 | 5.262 | 3.542 |
| 11/16/22 | 5.363 | 3.641 |
| 11/17/22 | 5.306 | 3.585 |
| 11/18/22 | 5.276 | 3.559 |
| 11/21/22 | 5.348 | 3.64 |
| 11/22/22 | 5.414 | 3.718 |
| 11/23/22 | 5.509 | 3.843 |
| 11/24/22 | 5.546 | 3.89 |
| 11/25/22 | 5.542 | 3.89 |
| 11/28/22 | 5.532 | 3.894 |
| 11/29/22 | 5.476 | 3.849 |
| 11/30/22 | 5.491 | 3.87 |
| 12/1/22 | 5.635 | 4.023 |
| 12/2/22 | 5.705 | 4.097 |
| 12/5/22 | 5.664 | 4.044 |
| 12/6/22 | 5.73 | 4.1 |
| 12/7/22 | 5.753 | 4.139 |
| 12/8/22 | 5.754 | 4.136 |
| 12/9/22 | 5.68 | 4.063 |
| 12/12/22 | 5.615 | 4.008 |
| 12/13/22 | 5.647 | 4.044 |
| 12/14/22 | 5.639 | 4.032 |
| 12/15/22 | 5.682 | 4.057 |
| 12/16/22 | 5.62 | 3.99 |
| 12/19/22 | 5.515 | 3.88 |
| 12/20/22 | 5.461 | 3.809 |
| 12/21/22 | 5.453 | 3.806 |
| 12/22/22 | 5.4 | 3.75 |
| 12/23/22 | 5.328 | 3.677 |
| 12/28/22 | 5.212 | 3.559 |
| 12/29/22 | 5.249 | 3.596 |
| 12/30/22 | 5.239 | 3.572 |
| 1/3/23 | 5.281 | 3.622 |
| 1/4/23 | 5.347 | 3.692 |
| 1/5/23 | 5.343 | 3.686 |
| 1/6/23 | 5.399 | 3.76 |
| 1/9/23 | 5.398 | 3.762 |
| 1/10/23 | 5.365 | 3.729 |
| 1/11/23 | 5.461 | 3.837 |
| 1/12/23 | 5.569 | 3.954 |
| 1/13/23 | 5.572 | 3.97 |
| 1/16/23 | 5.586 | 3.985 |
| 1/17/23 | 5.573 | 3.977 |
| 1/18/23 | 5.652 | 4.076 |
| 1/19/23 | 5.651 | 4.066 |